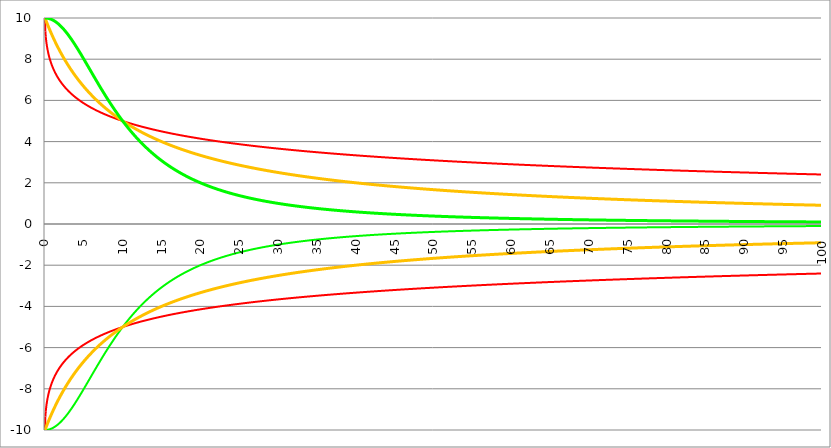
| Category | Series 1 | Series 0 | Series 2 | Series 3 | Series 4 | Series 5 |
|---|---|---|---|---|---|---|
| 0.0 | 10 | -10 | -10 | 10 | -10 | 10 |
| 0.05 | 9.34 | -9.34 | -10 | 9.95 | -9.95 | 10 |
| 0.1 | 9.091 | -9.091 | -9.999 | 9.901 | -9.901 | 9.999 |
| 0.15 | 8.909 | -8.909 | -9.998 | 9.852 | -9.852 | 9.998 |
| 0.2 | 8.761 | -8.761 | -9.996 | 9.804 | -9.804 | 9.996 |
| 0.25 | 8.635 | -8.635 | -9.994 | 9.756 | -9.756 | 9.994 |
| 0.3 | 8.524 | -8.524 | -9.991 | 9.709 | -9.709 | 9.991 |
| 0.35 | 8.424 | -8.424 | -9.988 | 9.662 | -9.662 | 9.988 |
| 0.4 | 8.333 | -8.333 | -9.984 | 9.615 | -9.615 | 9.984 |
| 0.45 | 8.25 | -8.25 | -9.98 | 9.569 | -9.569 | 9.98 |
| 0.5 | 8.173 | -8.173 | -9.975 | 9.524 | -9.524 | 9.975 |
| 0.55 | 8.1 | -8.1 | -9.97 | 9.479 | -9.479 | 9.97 |
| 0.6 | 8.032 | -8.032 | -9.964 | 9.434 | -9.434 | 9.964 |
| 0.65 | 7.968 | -7.968 | -9.958 | 9.39 | -9.39 | 9.958 |
| 0.7 | 7.908 | -7.908 | -9.951 | 9.346 | -9.346 | 9.951 |
| 0.75 | 7.85 | -7.85 | -9.944 | 9.302 | -9.302 | 9.944 |
| 0.8 | 7.795 | -7.795 | -9.936 | 9.259 | -9.259 | 9.936 |
| 0.85 | 7.743 | -7.743 | -9.928 | 9.217 | -9.217 | 9.928 |
| 0.9 | 7.692 | -7.692 | -9.92 | 9.174 | -9.174 | 9.92 |
| 0.95 | 7.644 | -7.644 | -9.911 | 9.132 | -9.132 | 9.911 |
| 1.0 | 7.597 | -7.597 | -9.901 | 9.091 | -9.091 | 9.901 |
| 1.05 | 7.553 | -7.553 | -9.891 | 9.05 | -9.05 | 9.891 |
| 1.1 | 7.509 | -7.509 | -9.88 | 9.009 | -9.009 | 9.88 |
| 1.15 | 7.468 | -7.468 | -9.869 | 8.969 | -8.969 | 9.869 |
| 1.2 | 7.427 | -7.427 | -9.858 | 8.929 | -8.929 | 9.858 |
| 1.25 | 7.388 | -7.388 | -9.846 | 8.889 | -8.889 | 9.846 |
| 1.3 | 7.35 | -7.35 | -9.834 | 8.85 | -8.85 | 9.834 |
| 1.35 | 7.313 | -7.313 | -9.821 | 8.811 | -8.811 | 9.821 |
| 1.400000000000001 | 7.277 | -7.277 | -9.808 | 8.772 | -8.772 | 9.808 |
| 1.450000000000001 | 7.242 | -7.242 | -9.794 | 8.734 | -8.734 | 9.794 |
| 1.500000000000001 | 7.208 | -7.208 | -9.78 | 8.696 | -8.696 | 9.78 |
| 1.550000000000001 | 7.175 | -7.175 | -9.765 | 8.658 | -8.658 | 9.765 |
| 1.600000000000001 | 7.143 | -7.143 | -9.75 | 8.621 | -8.621 | 9.75 |
| 1.650000000000001 | 7.111 | -7.111 | -9.735 | 8.584 | -8.584 | 9.735 |
| 1.700000000000001 | 7.081 | -7.081 | -9.719 | 8.547 | -8.547 | 9.719 |
| 1.750000000000001 | 7.051 | -7.051 | -9.703 | 8.511 | -8.511 | 9.703 |
| 1.800000000000001 | 7.021 | -7.021 | -9.686 | 8.475 | -8.475 | 9.686 |
| 1.850000000000001 | 6.992 | -6.992 | -9.669 | 8.439 | -8.439 | 9.669 |
| 1.900000000000001 | 6.964 | -6.964 | -9.652 | 8.403 | -8.403 | 9.652 |
| 1.950000000000001 | 6.937 | -6.937 | -9.634 | 8.368 | -8.368 | 9.634 |
| 2.000000000000001 | 6.91 | -6.91 | -9.615 | 8.333 | -8.333 | 9.615 |
| 2.050000000000001 | 6.883 | -6.883 | -9.597 | 8.299 | -8.299 | 9.597 |
| 2.100000000000001 | 6.857 | -6.857 | -9.578 | 8.264 | -8.264 | 9.578 |
| 2.15 | 6.832 | -6.832 | -9.558 | 8.23 | -8.23 | 9.558 |
| 2.2 | 6.807 | -6.807 | -9.538 | 8.197 | -8.197 | 9.538 |
| 2.25 | 6.783 | -6.783 | -9.518 | 8.163 | -8.163 | 9.518 |
| 2.3 | 6.759 | -6.759 | -9.498 | 8.13 | -8.13 | 9.498 |
| 2.35 | 6.735 | -6.735 | -9.477 | 8.097 | -8.097 | 9.477 |
| 2.399999999999999 | 6.712 | -6.712 | -9.455 | 8.065 | -8.065 | 9.455 |
| 2.449999999999999 | 6.689 | -6.689 | -9.434 | 8.032 | -8.032 | 9.434 |
| 2.499999999999999 | 6.667 | -6.667 | -9.412 | 8 | -8 | 9.412 |
| 2.549999999999999 | 6.645 | -6.645 | -9.389 | 7.968 | -7.968 | 9.389 |
| 2.599999999999999 | 6.623 | -6.623 | -9.367 | 7.937 | -7.937 | 9.367 |
| 2.649999999999998 | 6.602 | -6.602 | -9.344 | 7.905 | -7.905 | 9.344 |
| 2.699999999999998 | 6.581 | -6.581 | -9.321 | 7.874 | -7.874 | 9.321 |
| 2.749999999999998 | 6.56 | -6.56 | -9.297 | 7.843 | -7.843 | 9.297 |
| 2.799999999999998 | 6.54 | -6.54 | -9.273 | 7.813 | -7.813 | 9.273 |
| 2.849999999999998 | 6.52 | -6.52 | -9.249 | 7.782 | -7.782 | 9.249 |
| 2.899999999999998 | 6.5 | -6.5 | -9.224 | 7.752 | -7.752 | 9.224 |
| 2.949999999999997 | 6.48 | -6.48 | -9.199 | 7.722 | -7.722 | 9.199 |
| 2.999999999999997 | 6.461 | -6.461 | -9.174 | 7.692 | -7.692 | 9.174 |
| 3.049999999999997 | 6.442 | -6.442 | -9.149 | 7.663 | -7.663 | 9.149 |
| 3.099999999999997 | 6.424 | -6.424 | -9.123 | 7.634 | -7.634 | 9.123 |
| 3.149999999999997 | 6.405 | -6.405 | -9.097 | 7.605 | -7.605 | 9.097 |
| 3.199999999999997 | 6.387 | -6.387 | -9.071 | 7.576 | -7.576 | 9.071 |
| 3.249999999999996 | 6.369 | -6.369 | -9.045 | 7.547 | -7.547 | 9.045 |
| 3.299999999999996 | 6.351 | -6.351 | -9.018 | 7.519 | -7.519 | 9.018 |
| 3.349999999999996 | 6.334 | -6.334 | -8.991 | 7.491 | -7.491 | 8.991 |
| 3.399999999999996 | 6.317 | -6.317 | -8.964 | 7.463 | -7.463 | 8.964 |
| 3.449999999999996 | 6.3 | -6.3 | -8.936 | 7.435 | -7.435 | 8.936 |
| 3.499999999999996 | 6.283 | -6.283 | -8.909 | 7.407 | -7.407 | 8.909 |
| 3.549999999999995 | 6.266 | -6.266 | -8.881 | 7.38 | -7.38 | 8.881 |
| 3.599999999999995 | 6.25 | -6.25 | -8.853 | 7.353 | -7.353 | 8.853 |
| 3.649999999999995 | 6.234 | -6.234 | -8.824 | 7.326 | -7.326 | 8.824 |
| 3.699999999999995 | 6.218 | -6.218 | -8.796 | 7.299 | -7.299 | 8.796 |
| 3.749999999999995 | 6.202 | -6.202 | -8.767 | 7.273 | -7.273 | 8.767 |
| 3.799999999999994 | 6.186 | -6.186 | -8.738 | 7.246 | -7.246 | 8.738 |
| 3.849999999999994 | 6.171 | -6.171 | -8.709 | 7.22 | -7.22 | 8.709 |
| 3.899999999999994 | 6.156 | -6.156 | -8.68 | 7.194 | -7.194 | 8.68 |
| 3.949999999999994 | 6.141 | -6.141 | -8.65 | 7.168 | -7.168 | 8.65 |
| 3.999999999999994 | 6.126 | -6.126 | -8.621 | 7.143 | -7.143 | 8.621 |
| 4.049999999999994 | 6.111 | -6.111 | -8.591 | 7.117 | -7.117 | 8.591 |
| 4.099999999999993 | 6.096 | -6.096 | -8.561 | 7.092 | -7.092 | 8.561 |
| 4.149999999999993 | 6.082 | -6.082 | -8.531 | 7.067 | -7.067 | 8.531 |
| 4.199999999999993 | 6.068 | -6.068 | -8.501 | 7.042 | -7.042 | 8.501 |
| 4.249999999999993 | 6.054 | -6.054 | -8.47 | 7.018 | -7.018 | 8.47 |
| 4.299999999999993 | 6.04 | -6.04 | -8.44 | 6.993 | -6.993 | 8.44 |
| 4.349999999999992 | 6.026 | -6.026 | -8.409 | 6.969 | -6.969 | 8.409 |
| 4.399999999999992 | 6.012 | -6.012 | -8.378 | 6.944 | -6.944 | 8.378 |
| 4.449999999999992 | 5.999 | -5.999 | -8.347 | 6.92 | -6.92 | 8.347 |
| 4.499999999999992 | 5.985 | -5.985 | -8.316 | 6.897 | -6.897 | 8.316 |
| 4.549999999999992 | 5.972 | -5.972 | -8.285 | 6.873 | -6.873 | 8.285 |
| 4.599999999999992 | 5.959 | -5.959 | -8.254 | 6.849 | -6.849 | 8.254 |
| 4.649999999999991 | 5.946 | -5.946 | -8.222 | 6.826 | -6.826 | 8.222 |
| 4.699999999999991 | 5.933 | -5.933 | -8.191 | 6.803 | -6.803 | 8.191 |
| 4.749999999999991 | 5.92 | -5.92 | -8.159 | 6.78 | -6.78 | 8.159 |
| 4.799999999999991 | 5.907 | -5.907 | -8.127 | 6.757 | -6.757 | 8.127 |
| 4.849999999999991 | 5.895 | -5.895 | -8.096 | 6.734 | -6.734 | 8.096 |
| 4.899999999999991 | 5.882 | -5.882 | -8.064 | 6.711 | -6.711 | 8.064 |
| 4.94999999999999 | 5.87 | -5.87 | -8.032 | 6.689 | -6.689 | 8.032 |
| 4.99999999999999 | 5.858 | -5.858 | -8 | 6.667 | -6.667 | 8 |
| 5.04999999999999 | 5.846 | -5.846 | -7.968 | 6.645 | -6.645 | 7.968 |
| 5.09999999999999 | 5.834 | -5.834 | -7.936 | 6.623 | -6.623 | 7.936 |
| 5.14999999999999 | 5.822 | -5.822 | -7.904 | 6.601 | -6.601 | 7.904 |
| 5.199999999999989 | 5.81 | -5.81 | -7.872 | 6.579 | -6.579 | 7.872 |
| 5.24999999999999 | 5.799 | -5.799 | -7.839 | 6.557 | -6.557 | 7.839 |
| 5.29999999999999 | 5.787 | -5.787 | -7.807 | 6.536 | -6.536 | 7.807 |
| 5.349999999999989 | 5.776 | -5.776 | -7.775 | 6.515 | -6.515 | 7.775 |
| 5.399999999999989 | 5.764 | -5.764 | -7.742 | 6.494 | -6.494 | 7.742 |
| 5.449999999999988 | 5.753 | -5.753 | -7.71 | 6.472 | -6.472 | 7.71 |
| 5.499999999999988 | 5.742 | -5.742 | -7.678 | 6.452 | -6.452 | 7.678 |
| 5.549999999999988 | 5.731 | -5.731 | -7.645 | 6.431 | -6.431 | 7.645 |
| 5.599999999999988 | 5.72 | -5.72 | -7.613 | 6.41 | -6.41 | 7.613 |
| 5.649999999999988 | 5.709 | -5.709 | -7.58 | 6.39 | -6.39 | 7.58 |
| 5.699999999999988 | 5.698 | -5.698 | -7.548 | 6.369 | -6.369 | 7.548 |
| 5.749999999999987 | 5.687 | -5.687 | -7.515 | 6.349 | -6.349 | 7.515 |
| 5.799999999999987 | 5.677 | -5.677 | -7.483 | 6.329 | -6.329 | 7.483 |
| 5.849999999999987 | 5.666 | -5.666 | -7.45 | 6.309 | -6.309 | 7.45 |
| 5.899999999999987 | 5.656 | -5.656 | -7.418 | 6.289 | -6.289 | 7.418 |
| 5.949999999999986 | 5.645 | -5.645 | -7.385 | 6.27 | -6.27 | 7.385 |
| 5.999999999999986 | 5.635 | -5.635 | -7.353 | 6.25 | -6.25 | 7.353 |
| 6.049999999999986 | 5.625 | -5.625 | -7.321 | 6.231 | -6.231 | 7.321 |
| 6.099999999999986 | 5.615 | -5.615 | -7.288 | 6.211 | -6.211 | 7.288 |
| 6.149999999999986 | 5.605 | -5.605 | -7.256 | 6.192 | -6.192 | 7.256 |
| 6.199999999999986 | 5.595 | -5.595 | -7.223 | 6.173 | -6.173 | 7.223 |
| 6.249999999999985 | 5.585 | -5.585 | -7.191 | 6.154 | -6.154 | 7.191 |
| 6.299999999999985 | 5.575 | -5.575 | -7.159 | 6.135 | -6.135 | 7.159 |
| 6.349999999999985 | 5.565 | -5.565 | -7.126 | 6.116 | -6.116 | 7.126 |
| 6.399999999999985 | 5.556 | -5.556 | -7.094 | 6.098 | -6.098 | 7.094 |
| 6.449999999999985 | 5.546 | -5.546 | -7.062 | 6.079 | -6.079 | 7.062 |
| 6.499999999999984 | 5.536 | -5.536 | -7.03 | 6.061 | -6.061 | 7.03 |
| 6.549999999999984 | 5.527 | -5.527 | -6.998 | 6.042 | -6.042 | 6.998 |
| 6.599999999999984 | 5.518 | -5.518 | -6.966 | 6.024 | -6.024 | 6.966 |
| 6.649999999999984 | 5.508 | -5.508 | -6.934 | 6.006 | -6.006 | 6.934 |
| 6.699999999999984 | 5.499 | -5.499 | -6.902 | 5.988 | -5.988 | 6.902 |
| 6.749999999999984 | 5.49 | -5.49 | -6.87 | 5.97 | -5.97 | 6.87 |
| 6.799999999999984 | 5.481 | -5.481 | -6.838 | 5.952 | -5.952 | 6.838 |
| 6.849999999999984 | 5.472 | -5.472 | -6.806 | 5.935 | -5.935 | 6.806 |
| 6.899999999999983 | 5.463 | -5.463 | -6.775 | 5.917 | -5.917 | 6.775 |
| 6.949999999999983 | 5.454 | -5.454 | -6.743 | 5.9 | -5.9 | 6.743 |
| 6.999999999999983 | 5.445 | -5.445 | -6.711 | 5.882 | -5.882 | 6.711 |
| 7.049999999999983 | 5.436 | -5.436 | -6.68 | 5.865 | -5.865 | 6.68 |
| 7.099999999999983 | 5.427 | -5.427 | -6.648 | 5.848 | -5.848 | 6.648 |
| 7.149999999999983 | 5.418 | -5.418 | -6.617 | 5.831 | -5.831 | 6.617 |
| 7.199999999999982 | 5.41 | -5.41 | -6.586 | 5.814 | -5.814 | 6.586 |
| 7.249999999999982 | 5.401 | -5.401 | -6.555 | 5.797 | -5.797 | 6.555 |
| 7.299999999999982 | 5.393 | -5.393 | -6.524 | 5.78 | -5.78 | 6.524 |
| 7.349999999999982 | 5.384 | -5.384 | -6.493 | 5.764 | -5.764 | 6.493 |
| 7.399999999999982 | 5.376 | -5.376 | -6.462 | 5.747 | -5.747 | 6.462 |
| 7.449999999999981 | 5.367 | -5.367 | -6.431 | 5.731 | -5.731 | 6.431 |
| 7.499999999999981 | 5.359 | -5.359 | -6.4 | 5.714 | -5.714 | 6.4 |
| 7.549999999999981 | 5.351 | -5.351 | -6.369 | 5.698 | -5.698 | 6.369 |
| 7.599999999999981 | 5.343 | -5.343 | -6.339 | 5.682 | -5.682 | 6.339 |
| 7.649999999999981 | 5.334 | -5.334 | -6.308 | 5.666 | -5.666 | 6.308 |
| 7.699999999999981 | 5.326 | -5.326 | -6.278 | 5.65 | -5.65 | 6.278 |
| 7.74999999999998 | 5.318 | -5.318 | -6.248 | 5.634 | -5.634 | 6.248 |
| 7.79999999999998 | 5.31 | -5.31 | -6.217 | 5.618 | -5.618 | 6.217 |
| 7.84999999999998 | 5.302 | -5.302 | -6.187 | 5.602 | -5.602 | 6.187 |
| 7.89999999999998 | 5.294 | -5.294 | -6.157 | 5.587 | -5.587 | 6.157 |
| 7.94999999999998 | 5.286 | -5.286 | -6.127 | 5.571 | -5.571 | 6.127 |
| 7.99999999999998 | 5.279 | -5.279 | -6.098 | 5.556 | -5.556 | 6.098 |
| 8.04999999999998 | 5.271 | -5.271 | -6.068 | 5.54 | -5.54 | 6.068 |
| 8.09999999999998 | 5.263 | -5.263 | -6.038 | 5.525 | -5.525 | 6.038 |
| 8.14999999999998 | 5.255 | -5.255 | -6.009 | 5.51 | -5.51 | 6.009 |
| 8.19999999999998 | 5.248 | -5.248 | -5.979 | 5.495 | -5.495 | 5.979 |
| 8.249999999999982 | 5.24 | -5.24 | -5.95 | 5.479 | -5.479 | 5.95 |
| 8.299999999999981 | 5.233 | -5.233 | -5.921 | 5.464 | -5.464 | 5.921 |
| 8.349999999999984 | 5.225 | -5.225 | -5.892 | 5.45 | -5.45 | 5.892 |
| 8.399999999999984 | 5.218 | -5.218 | -5.863 | 5.435 | -5.435 | 5.863 |
| 8.449999999999985 | 5.21 | -5.21 | -5.834 | 5.42 | -5.42 | 5.834 |
| 8.499999999999986 | 5.203 | -5.203 | -5.806 | 5.405 | -5.405 | 5.806 |
| 8.549999999999986 | 5.196 | -5.196 | -5.777 | 5.391 | -5.391 | 5.777 |
| 8.599999999999987 | 5.188 | -5.188 | -5.748 | 5.376 | -5.376 | 5.748 |
| 8.649999999999986 | 5.181 | -5.181 | -5.72 | 5.362 | -5.362 | 5.72 |
| 8.699999999999989 | 5.174 | -5.174 | -5.692 | 5.348 | -5.348 | 5.692 |
| 8.74999999999999 | 5.167 | -5.167 | -5.664 | 5.333 | -5.333 | 5.664 |
| 8.79999999999999 | 5.16 | -5.16 | -5.636 | 5.319 | -5.319 | 5.636 |
| 8.84999999999999 | 5.153 | -5.153 | -5.608 | 5.305 | -5.305 | 5.608 |
| 8.89999999999999 | 5.146 | -5.146 | -5.58 | 5.291 | -5.291 | 5.58 |
| 8.94999999999999 | 5.139 | -5.139 | -5.552 | 5.277 | -5.277 | 5.552 |
| 8.99999999999999 | 5.132 | -5.132 | -5.525 | 5.263 | -5.263 | 5.525 |
| 9.049999999999994 | 5.125 | -5.125 | -5.497 | 5.249 | -5.249 | 5.497 |
| 9.099999999999994 | 5.118 | -5.118 | -5.47 | 5.236 | -5.236 | 5.47 |
| 9.149999999999995 | 5.111 | -5.111 | -5.443 | 5.222 | -5.222 | 5.443 |
| 9.199999999999996 | 5.104 | -5.104 | -5.416 | 5.208 | -5.208 | 5.416 |
| 9.249999999999996 | 5.097 | -5.097 | -5.389 | 5.195 | -5.195 | 5.389 |
| 9.299999999999997 | 5.091 | -5.091 | -5.362 | 5.181 | -5.181 | 5.362 |
| 9.349999999999998 | 5.084 | -5.084 | -5.336 | 5.168 | -5.168 | 5.336 |
| 9.399999999999999 | 5.077 | -5.077 | -5.309 | 5.155 | -5.155 | 5.309 |
| 9.45 | 5.071 | -5.071 | -5.283 | 5.141 | -5.141 | 5.283 |
| 9.5 | 5.064 | -5.064 | -5.256 | 5.128 | -5.128 | 5.256 |
| 9.55 | 5.058 | -5.058 | -5.23 | 5.115 | -5.115 | 5.23 |
| 9.600000000000001 | 5.051 | -5.051 | -5.204 | 5.102 | -5.102 | 5.204 |
| 9.650000000000002 | 5.045 | -5.045 | -5.178 | 5.089 | -5.089 | 5.178 |
| 9.700000000000003 | 5.038 | -5.038 | -5.152 | 5.076 | -5.076 | 5.152 |
| 9.750000000000004 | 5.032 | -5.032 | -5.127 | 5.063 | -5.063 | 5.127 |
| 9.800000000000004 | 5.025 | -5.025 | -5.101 | 5.051 | -5.051 | 5.101 |
| 9.850000000000003 | 5.019 | -5.019 | -5.076 | 5.038 | -5.038 | 5.076 |
| 9.900000000000006 | 5.013 | -5.013 | -5.05 | 5.025 | -5.025 | 5.05 |
| 9.950000000000006 | 5.006 | -5.006 | -5.025 | 5.013 | -5.013 | 5.025 |
| 10.00000000000001 | 5 | -5 | -5 | 5 | -5 | 5 |
| 10.05000000000001 | 4.994 | -4.994 | -4.975 | 4.988 | -4.988 | 4.975 |
| 10.10000000000001 | 4.988 | -4.988 | -4.95 | 4.975 | -4.975 | 4.95 |
| 10.15000000000001 | 4.981 | -4.981 | -4.926 | 4.963 | -4.963 | 4.926 |
| 10.20000000000001 | 4.975 | -4.975 | -4.901 | 4.95 | -4.95 | 4.901 |
| 10.25000000000001 | 4.969 | -4.969 | -4.877 | 4.938 | -4.938 | 4.877 |
| 10.30000000000001 | 4.963 | -4.963 | -4.852 | 4.926 | -4.926 | 4.852 |
| 10.35000000000001 | 4.957 | -4.957 | -4.828 | 4.914 | -4.914 | 4.828 |
| 10.40000000000001 | 4.951 | -4.951 | -4.804 | 4.902 | -4.902 | 4.804 |
| 10.45000000000001 | 4.945 | -4.945 | -4.78 | 4.89 | -4.89 | 4.78 |
| 10.50000000000001 | 4.939 | -4.939 | -4.756 | 4.878 | -4.878 | 4.756 |
| 10.55000000000001 | 4.933 | -4.933 | -4.733 | 4.866 | -4.866 | 4.733 |
| 10.60000000000002 | 4.927 | -4.927 | -4.709 | 4.854 | -4.854 | 4.709 |
| 10.65000000000002 | 4.921 | -4.921 | -4.686 | 4.843 | -4.843 | 4.686 |
| 10.70000000000002 | 4.915 | -4.915 | -4.662 | 4.831 | -4.831 | 4.662 |
| 10.75000000000002 | 4.91 | -4.91 | -4.639 | 4.819 | -4.819 | 4.639 |
| 10.80000000000002 | 4.904 | -4.904 | -4.616 | 4.808 | -4.808 | 4.616 |
| 10.85000000000002 | 4.898 | -4.898 | -4.593 | 4.796 | -4.796 | 4.593 |
| 10.90000000000002 | 4.892 | -4.892 | -4.57 | 4.785 | -4.785 | 4.57 |
| 10.95000000000002 | 4.887 | -4.887 | -4.547 | 4.773 | -4.773 | 4.547 |
| 11.00000000000002 | 4.881 | -4.881 | -4.525 | 4.762 | -4.762 | 4.525 |
| 11.05000000000002 | 4.875 | -4.875 | -4.502 | 4.751 | -4.751 | 4.502 |
| 11.10000000000002 | 4.87 | -4.87 | -4.48 | 4.739 | -4.739 | 4.48 |
| 11.15000000000002 | 4.864 | -4.864 | -4.458 | 4.728 | -4.728 | 4.458 |
| 11.20000000000002 | 4.858 | -4.858 | -4.436 | 4.717 | -4.717 | 4.436 |
| 11.25000000000002 | 4.853 | -4.853 | -4.414 | 4.706 | -4.706 | 4.414 |
| 11.30000000000003 | 4.847 | -4.847 | -4.392 | 4.695 | -4.695 | 4.392 |
| 11.35000000000003 | 4.842 | -4.842 | -4.37 | 4.684 | -4.684 | 4.37 |
| 11.40000000000003 | 4.836 | -4.836 | -4.349 | 4.673 | -4.673 | 4.349 |
| 11.45000000000003 | 4.831 | -4.831 | -4.327 | 4.662 | -4.662 | 4.327 |
| 11.50000000000003 | 4.825 | -4.825 | -4.306 | 4.651 | -4.651 | 4.306 |
| 11.55000000000003 | 4.82 | -4.82 | -4.284 | 4.64 | -4.64 | 4.284 |
| 11.60000000000003 | 4.815 | -4.815 | -4.263 | 4.63 | -4.63 | 4.263 |
| 11.65000000000003 | 4.809 | -4.809 | -4.242 | 4.619 | -4.619 | 4.242 |
| 11.70000000000003 | 4.804 | -4.804 | -4.221 | 4.608 | -4.608 | 4.221 |
| 11.75000000000003 | 4.799 | -4.799 | -4.201 | 4.598 | -4.598 | 4.201 |
| 11.80000000000003 | 4.793 | -4.793 | -4.18 | 4.587 | -4.587 | 4.18 |
| 11.85000000000003 | 4.788 | -4.788 | -4.159 | 4.577 | -4.577 | 4.159 |
| 11.90000000000003 | 4.783 | -4.783 | -4.139 | 4.566 | -4.566 | 4.139 |
| 11.95000000000003 | 4.777 | -4.777 | -4.119 | 4.556 | -4.556 | 4.119 |
| 12.00000000000004 | 4.772 | -4.772 | -4.098 | 4.545 | -4.545 | 4.098 |
| 12.05000000000004 | 4.767 | -4.767 | -4.078 | 4.535 | -4.535 | 4.078 |
| 12.10000000000004 | 4.762 | -4.762 | -4.058 | 4.525 | -4.525 | 4.058 |
| 12.15000000000004 | 4.757 | -4.757 | -4.038 | 4.515 | -4.515 | 4.038 |
| 12.20000000000004 | 4.752 | -4.752 | -4.019 | 4.505 | -4.505 | 4.019 |
| 12.25000000000004 | 4.747 | -4.747 | -3.999 | 4.494 | -4.494 | 3.999 |
| 12.30000000000004 | 4.741 | -4.741 | -3.979 | 4.484 | -4.484 | 3.979 |
| 12.35000000000004 | 4.736 | -4.736 | -3.96 | 4.474 | -4.474 | 3.96 |
| 12.40000000000004 | 4.731 | -4.731 | -3.941 | 4.464 | -4.464 | 3.941 |
| 12.45000000000004 | 4.726 | -4.726 | -3.922 | 4.454 | -4.454 | 3.922 |
| 12.50000000000004 | 4.721 | -4.721 | -3.902 | 4.444 | -4.444 | 3.902 |
| 12.55000000000004 | 4.716 | -4.716 | -3.883 | 4.435 | -4.435 | 3.883 |
| 12.60000000000004 | 4.711 | -4.711 | -3.865 | 4.425 | -4.425 | 3.865 |
| 12.65000000000004 | 4.706 | -4.706 | -3.846 | 4.415 | -4.415 | 3.846 |
| 12.70000000000005 | 4.702 | -4.702 | -3.827 | 4.405 | -4.405 | 3.827 |
| 12.75000000000005 | 4.697 | -4.697 | -3.809 | 4.396 | -4.396 | 3.809 |
| 12.80000000000005 | 4.692 | -4.692 | -3.79 | 4.386 | -4.386 | 3.79 |
| 12.85000000000005 | 4.687 | -4.687 | -3.772 | 4.376 | -4.376 | 3.772 |
| 12.90000000000005 | 4.682 | -4.682 | -3.754 | 4.367 | -4.367 | 3.754 |
| 12.95000000000005 | 4.677 | -4.677 | -3.735 | 4.357 | -4.357 | 3.735 |
| 13.00000000000005 | 4.673 | -4.673 | -3.717 | 4.348 | -4.348 | 3.717 |
| 13.05000000000005 | 4.668 | -4.668 | -3.7 | 4.338 | -4.338 | 3.7 |
| 13.10000000000005 | 4.663 | -4.663 | -3.682 | 4.329 | -4.329 | 3.682 |
| 13.15000000000005 | 4.658 | -4.658 | -3.664 | 4.32 | -4.32 | 3.664 |
| 13.20000000000005 | 4.654 | -4.654 | -3.646 | 4.31 | -4.31 | 3.646 |
| 13.25000000000005 | 4.649 | -4.649 | -3.629 | 4.301 | -4.301 | 3.629 |
| 13.30000000000005 | 4.644 | -4.644 | -3.612 | 4.292 | -4.292 | 3.612 |
| 13.35000000000005 | 4.639 | -4.639 | -3.594 | 4.283 | -4.283 | 3.594 |
| 13.40000000000006 | 4.635 | -4.635 | -3.577 | 4.274 | -4.274 | 3.577 |
| 13.45000000000006 | 4.63 | -4.63 | -3.56 | 4.264 | -4.264 | 3.56 |
| 13.50000000000006 | 4.626 | -4.626 | -3.543 | 4.255 | -4.255 | 3.543 |
| 13.55000000000006 | 4.621 | -4.621 | -3.526 | 4.246 | -4.246 | 3.526 |
| 13.60000000000006 | 4.616 | -4.616 | -3.509 | 4.237 | -4.237 | 3.509 |
| 13.65000000000006 | 4.612 | -4.612 | -3.493 | 4.228 | -4.228 | 3.493 |
| 13.70000000000006 | 4.607 | -4.607 | -3.476 | 4.219 | -4.219 | 3.476 |
| 13.75000000000006 | 4.603 | -4.603 | -3.459 | 4.211 | -4.211 | 3.459 |
| 13.80000000000006 | 4.598 | -4.598 | -3.443 | 4.202 | -4.202 | 3.443 |
| 13.85000000000006 | 4.594 | -4.594 | -3.427 | 4.193 | -4.193 | 3.427 |
| 13.90000000000006 | 4.589 | -4.589 | -3.411 | 4.184 | -4.184 | 3.411 |
| 13.95000000000006 | 4.585 | -4.585 | -3.394 | 4.175 | -4.175 | 3.394 |
| 14.00000000000006 | 4.58 | -4.58 | -3.378 | 4.167 | -4.167 | 3.378 |
| 14.05000000000006 | 4.576 | -4.576 | -3.362 | 4.158 | -4.158 | 3.362 |
| 14.10000000000007 | 4.572 | -4.572 | -3.347 | 4.149 | -4.149 | 3.347 |
| 14.15000000000007 | 4.567 | -4.567 | -3.331 | 4.141 | -4.141 | 3.331 |
| 14.20000000000007 | 4.563 | -4.563 | -3.315 | 4.132 | -4.132 | 3.315 |
| 14.25000000000007 | 4.558 | -4.558 | -3.3 | 4.124 | -4.124 | 3.3 |
| 14.30000000000007 | 4.554 | -4.554 | -3.284 | 4.115 | -4.115 | 3.284 |
| 14.35000000000007 | 4.55 | -4.55 | -3.269 | 4.107 | -4.107 | 3.269 |
| 14.40000000000007 | 4.545 | -4.545 | -3.254 | 4.098 | -4.098 | 3.254 |
| 14.45000000000007 | 4.541 | -4.541 | -3.238 | 4.09 | -4.09 | 3.238 |
| 14.50000000000007 | 4.537 | -4.537 | -3.223 | 4.082 | -4.082 | 3.223 |
| 14.55000000000007 | 4.533 | -4.533 | -3.208 | 4.073 | -4.073 | 3.208 |
| 14.60000000000007 | 4.528 | -4.528 | -3.193 | 4.065 | -4.065 | 3.193 |
| 14.65000000000007 | 4.524 | -4.524 | -3.178 | 4.057 | -4.057 | 3.178 |
| 14.70000000000007 | 4.52 | -4.52 | -3.164 | 4.049 | -4.049 | 3.164 |
| 14.75000000000007 | 4.516 | -4.516 | -3.149 | 4.04 | -4.04 | 3.149 |
| 14.80000000000008 | 4.512 | -4.512 | -3.134 | 4.032 | -4.032 | 3.134 |
| 14.85000000000008 | 4.507 | -4.507 | -3.12 | 4.024 | -4.024 | 3.12 |
| 14.90000000000008 | 4.503 | -4.503 | -3.105 | 4.016 | -4.016 | 3.105 |
| 14.95000000000008 | 4.499 | -4.499 | -3.091 | 4.008 | -4.008 | 3.091 |
| 15.00000000000008 | 4.495 | -4.495 | -3.077 | 4 | -4 | 3.077 |
| 15.05000000000008 | 4.491 | -4.491 | -3.063 | 3.992 | -3.992 | 3.063 |
| 15.10000000000008 | 4.487 | -4.487 | -3.049 | 3.984 | -3.984 | 3.049 |
| 15.15000000000008 | 4.483 | -4.483 | -3.035 | 3.976 | -3.976 | 3.035 |
| 15.20000000000008 | 4.479 | -4.479 | -3.021 | 3.968 | -3.968 | 3.021 |
| 15.25000000000008 | 4.474 | -4.474 | -3.007 | 3.96 | -3.96 | 3.007 |
| 15.30000000000008 | 4.47 | -4.47 | -2.993 | 3.953 | -3.953 | 2.993 |
| 15.35000000000008 | 4.466 | -4.466 | -2.98 | 3.945 | -3.945 | 2.98 |
| 15.40000000000008 | 4.462 | -4.462 | -2.966 | 3.937 | -3.937 | 2.966 |
| 15.45000000000008 | 4.458 | -4.458 | -2.952 | 3.929 | -3.929 | 2.952 |
| 15.50000000000009 | 4.454 | -4.454 | -2.939 | 3.922 | -3.922 | 2.939 |
| 15.55000000000009 | 4.45 | -4.45 | -2.926 | 3.914 | -3.914 | 2.926 |
| 15.60000000000009 | 4.446 | -4.446 | -2.912 | 3.906 | -3.906 | 2.912 |
| 15.65000000000009 | 4.442 | -4.442 | -2.899 | 3.899 | -3.899 | 2.899 |
| 15.70000000000009 | 4.439 | -4.439 | -2.886 | 3.891 | -3.891 | 2.886 |
| 15.75000000000009 | 4.435 | -4.435 | -2.873 | 3.883 | -3.883 | 2.873 |
| 15.80000000000009 | 4.431 | -4.431 | -2.86 | 3.876 | -3.876 | 2.86 |
| 15.8500000000001 | 4.427 | -4.427 | -2.847 | 3.868 | -3.868 | 2.847 |
| 15.9000000000001 | 4.423 | -4.423 | -2.834 | 3.861 | -3.861 | 2.834 |
| 15.9500000000001 | 4.419 | -4.419 | -2.822 | 3.854 | -3.854 | 2.822 |
| 16.00000000000009 | 4.415 | -4.415 | -2.809 | 3.846 | -3.846 | 2.809 |
| 16.05000000000009 | 4.411 | -4.411 | -2.796 | 3.839 | -3.839 | 2.796 |
| 16.10000000000009 | 4.408 | -4.408 | -2.784 | 3.831 | -3.831 | 2.784 |
| 16.15000000000009 | 4.404 | -4.404 | -2.771 | 3.824 | -3.824 | 2.771 |
| 16.2000000000001 | 4.4 | -4.4 | -2.759 | 3.817 | -3.817 | 2.759 |
| 16.2500000000001 | 4.396 | -4.396 | -2.747 | 3.81 | -3.81 | 2.747 |
| 16.3000000000001 | 4.392 | -4.392 | -2.735 | 3.802 | -3.802 | 2.735 |
| 16.3500000000001 | 4.389 | -4.389 | -2.722 | 3.795 | -3.795 | 2.722 |
| 16.4000000000001 | 4.385 | -4.385 | -2.71 | 3.788 | -3.788 | 2.71 |
| 16.4500000000001 | 4.381 | -4.381 | -2.698 | 3.781 | -3.781 | 2.698 |
| 16.5000000000001 | 4.377 | -4.377 | -2.686 | 3.774 | -3.774 | 2.686 |
| 16.5500000000001 | 4.374 | -4.374 | -2.674 | 3.766 | -3.766 | 2.674 |
| 16.6000000000001 | 4.37 | -4.37 | -2.663 | 3.759 | -3.759 | 2.663 |
| 16.6500000000001 | 4.366 | -4.366 | -2.651 | 3.752 | -3.752 | 2.651 |
| 16.7000000000001 | 4.362 | -4.362 | -2.639 | 3.745 | -3.745 | 2.639 |
| 16.7500000000001 | 4.359 | -4.359 | -2.628 | 3.738 | -3.738 | 2.628 |
| 16.8000000000001 | 4.355 | -4.355 | -2.616 | 3.731 | -3.731 | 2.616 |
| 16.8500000000001 | 4.351 | -4.351 | -2.605 | 3.724 | -3.724 | 2.605 |
| 16.90000000000011 | 4.348 | -4.348 | -2.593 | 3.717 | -3.717 | 2.593 |
| 16.95000000000011 | 4.344 | -4.344 | -2.582 | 3.711 | -3.711 | 2.582 |
| 17.00000000000011 | 4.341 | -4.341 | -2.571 | 3.704 | -3.704 | 2.571 |
| 17.05000000000011 | 4.337 | -4.337 | -2.559 | 3.697 | -3.697 | 2.559 |
| 17.10000000000011 | 4.333 | -4.333 | -2.548 | 3.69 | -3.69 | 2.548 |
| 17.15000000000011 | 4.33 | -4.33 | -2.537 | 3.683 | -3.683 | 2.537 |
| 17.20000000000011 | 4.326 | -4.326 | -2.526 | 3.676 | -3.676 | 2.526 |
| 17.25000000000011 | 4.323 | -4.323 | -2.515 | 3.67 | -3.67 | 2.515 |
| 17.30000000000011 | 4.319 | -4.319 | -2.504 | 3.663 | -3.663 | 2.504 |
| 17.35000000000011 | 4.316 | -4.316 | -2.494 | 3.656 | -3.656 | 2.494 |
| 17.40000000000011 | 4.312 | -4.312 | -2.483 | 3.65 | -3.65 | 2.483 |
| 17.45000000000011 | 4.309 | -4.309 | -2.472 | 3.643 | -3.643 | 2.472 |
| 17.50000000000011 | 4.305 | -4.305 | -2.462 | 3.636 | -3.636 | 2.462 |
| 17.55000000000011 | 4.302 | -4.302 | -2.451 | 3.63 | -3.63 | 2.451 |
| 17.60000000000012 | 4.298 | -4.298 | -2.44 | 3.623 | -3.623 | 2.44 |
| 17.65000000000012 | 4.295 | -4.295 | -2.43 | 3.617 | -3.617 | 2.43 |
| 17.70000000000012 | 4.291 | -4.291 | -2.42 | 3.61 | -3.61 | 2.42 |
| 17.75000000000012 | 4.288 | -4.288 | -2.409 | 3.604 | -3.604 | 2.409 |
| 17.80000000000012 | 4.284 | -4.284 | -2.399 | 3.597 | -3.597 | 2.399 |
| 17.85000000000012 | 4.281 | -4.281 | -2.389 | 3.591 | -3.591 | 2.389 |
| 17.90000000000012 | 4.277 | -4.277 | -2.379 | 3.584 | -3.584 | 2.379 |
| 17.95000000000012 | 4.274 | -4.274 | -2.369 | 3.578 | -3.578 | 2.369 |
| 18.00000000000012 | 4.271 | -4.271 | -2.358 | 3.571 | -3.571 | 2.358 |
| 18.05000000000012 | 4.267 | -4.267 | -2.349 | 3.565 | -3.565 | 2.349 |
| 18.10000000000012 | 4.264 | -4.264 | -2.339 | 3.559 | -3.559 | 2.339 |
| 18.15000000000012 | 4.26 | -4.26 | -2.329 | 3.552 | -3.552 | 2.329 |
| 18.20000000000012 | 4.257 | -4.257 | -2.319 | 3.546 | -3.546 | 2.319 |
| 18.25000000000012 | 4.254 | -4.254 | -2.309 | 3.54 | -3.54 | 2.309 |
| 18.30000000000013 | 4.25 | -4.25 | -2.299 | 3.534 | -3.534 | 2.299 |
| 18.35000000000013 | 4.247 | -4.247 | -2.29 | 3.527 | -3.527 | 2.29 |
| 18.40000000000013 | 4.244 | -4.244 | -2.28 | 3.521 | -3.521 | 2.28 |
| 18.45000000000013 | 4.24 | -4.24 | -2.271 | 3.515 | -3.515 | 2.271 |
| 18.50000000000013 | 4.237 | -4.237 | -2.261 | 3.509 | -3.509 | 2.261 |
| 18.55000000000013 | 4.234 | -4.234 | -2.252 | 3.503 | -3.503 | 2.252 |
| 18.60000000000013 | 4.23 | -4.23 | -2.242 | 3.497 | -3.497 | 2.242 |
| 18.65000000000013 | 4.227 | -4.227 | -2.233 | 3.49 | -3.49 | 2.233 |
| 18.70000000000013 | 4.224 | -4.224 | -2.224 | 3.484 | -3.484 | 2.224 |
| 18.75000000000013 | 4.221 | -4.221 | -2.215 | 3.478 | -3.478 | 2.215 |
| 18.80000000000013 | 4.217 | -4.217 | -2.205 | 3.472 | -3.472 | 2.205 |
| 18.85000000000013 | 4.214 | -4.214 | -2.196 | 3.466 | -3.466 | 2.196 |
| 18.90000000000013 | 4.211 | -4.211 | -2.187 | 3.46 | -3.46 | 2.187 |
| 18.95000000000013 | 4.208 | -4.208 | -2.178 | 3.454 | -3.454 | 2.178 |
| 19.00000000000014 | 4.204 | -4.204 | -2.169 | 3.448 | -3.448 | 2.169 |
| 19.05000000000014 | 4.201 | -4.201 | -2.16 | 3.442 | -3.442 | 2.16 |
| 19.10000000000014 | 4.198 | -4.198 | -2.151 | 3.436 | -3.436 | 2.151 |
| 19.15000000000014 | 4.195 | -4.195 | -2.143 | 3.431 | -3.431 | 2.143 |
| 19.20000000000014 | 4.192 | -4.192 | -2.134 | 3.425 | -3.425 | 2.134 |
| 19.25000000000014 | 4.189 | -4.189 | -2.125 | 3.419 | -3.419 | 2.125 |
| 19.30000000000014 | 4.185 | -4.185 | -2.116 | 3.413 | -3.413 | 2.116 |
| 19.35000000000014 | 4.182 | -4.182 | -2.108 | 3.407 | -3.407 | 2.108 |
| 19.40000000000014 | 4.179 | -4.179 | -2.099 | 3.401 | -3.401 | 2.099 |
| 19.45000000000014 | 4.176 | -4.176 | -2.091 | 3.396 | -3.396 | 2.091 |
| 19.50000000000014 | 4.173 | -4.173 | -2.082 | 3.39 | -3.39 | 2.082 |
| 19.55000000000014 | 4.17 | -4.17 | -2.074 | 3.384 | -3.384 | 2.074 |
| 19.60000000000014 | 4.167 | -4.167 | -2.065 | 3.378 | -3.378 | 2.065 |
| 19.65000000000014 | 4.164 | -4.164 | -2.057 | 3.373 | -3.373 | 2.057 |
| 19.70000000000014 | 4.16 | -4.16 | -2.049 | 3.367 | -3.367 | 2.049 |
| 19.75000000000015 | 4.157 | -4.157 | -2.041 | 3.361 | -3.361 | 2.041 |
| 19.80000000000015 | 4.154 | -4.154 | -2.032 | 3.356 | -3.356 | 2.032 |
| 19.85000000000015 | 4.151 | -4.151 | -2.024 | 3.35 | -3.35 | 2.024 |
| 19.90000000000015 | 4.148 | -4.148 | -2.016 | 3.344 | -3.344 | 2.016 |
| 19.95000000000015 | 4.145 | -4.145 | -2.008 | 3.339 | -3.339 | 2.008 |
| 20.00000000000015 | 4.142 | -4.142 | -2 | 3.333 | -3.333 | 2 |
| 20.05000000000015 | 4.139 | -4.139 | -1.992 | 3.328 | -3.328 | 1.992 |
| 20.10000000000015 | 4.136 | -4.136 | -1.984 | 3.322 | -3.322 | 1.984 |
| 20.15000000000015 | 4.133 | -4.133 | -1.976 | 3.317 | -3.317 | 1.976 |
| 20.20000000000015 | 4.13 | -4.13 | -1.968 | 3.311 | -3.311 | 1.968 |
| 20.25000000000015 | 4.127 | -4.127 | -1.961 | 3.306 | -3.306 | 1.961 |
| 20.30000000000015 | 4.124 | -4.124 | -1.953 | 3.3 | -3.3 | 1.953 |
| 20.35000000000015 | 4.121 | -4.121 | -1.945 | 3.295 | -3.295 | 1.945 |
| 20.40000000000015 | 4.118 | -4.118 | -1.937 | 3.289 | -3.289 | 1.937 |
| 20.45000000000016 | 4.115 | -4.115 | -1.93 | 3.284 | -3.284 | 1.93 |
| 20.50000000000016 | 4.112 | -4.112 | -1.922 | 3.279 | -3.279 | 1.922 |
| 20.55000000000016 | 4.109 | -4.109 | -1.915 | 3.273 | -3.273 | 1.915 |
| 20.60000000000016 | 4.106 | -4.106 | -1.907 | 3.268 | -3.268 | 1.907 |
| 20.65000000000016 | 4.103 | -4.103 | -1.9 | 3.263 | -3.263 | 1.9 |
| 20.70000000000016 | 4.1 | -4.1 | -1.892 | 3.257 | -3.257 | 1.892 |
| 20.75000000000016 | 4.098 | -4.098 | -1.885 | 3.252 | -3.252 | 1.885 |
| 20.80000000000016 | 4.095 | -4.095 | -1.877 | 3.247 | -3.247 | 1.877 |
| 20.85000000000016 | 4.092 | -4.092 | -1.87 | 3.241 | -3.241 | 1.87 |
| 20.90000000000016 | 4.089 | -4.089 | -1.863 | 3.236 | -3.236 | 1.863 |
| 20.95000000000016 | 4.086 | -4.086 | -1.856 | 3.231 | -3.231 | 1.856 |
| 21.00000000000016 | 4.083 | -4.083 | -1.848 | 3.226 | -3.226 | 1.848 |
| 21.05000000000016 | 4.08 | -4.08 | -1.841 | 3.221 | -3.221 | 1.841 |
| 21.10000000000016 | 4.077 | -4.077 | -1.834 | 3.215 | -3.215 | 1.834 |
| 21.15000000000017 | 4.074 | -4.074 | -1.827 | 3.21 | -3.21 | 1.827 |
| 21.20000000000017 | 4.072 | -4.072 | -1.82 | 3.205 | -3.205 | 1.82 |
| 21.25000000000017 | 4.069 | -4.069 | -1.813 | 3.2 | -3.2 | 1.813 |
| 21.30000000000017 | 4.066 | -4.066 | -1.806 | 3.195 | -3.195 | 1.806 |
| 21.35000000000017 | 4.063 | -4.063 | -1.799 | 3.19 | -3.19 | 1.799 |
| 21.40000000000017 | 4.06 | -4.06 | -1.792 | 3.185 | -3.185 | 1.792 |
| 21.45000000000017 | 4.057 | -4.057 | -1.785 | 3.18 | -3.18 | 1.785 |
| 21.50000000000017 | 4.055 | -4.055 | -1.779 | 3.175 | -3.175 | 1.779 |
| 21.55000000000017 | 4.052 | -4.052 | -1.772 | 3.17 | -3.17 | 1.772 |
| 21.60000000000017 | 4.049 | -4.049 | -1.765 | 3.165 | -3.165 | 1.765 |
| 21.65000000000017 | 4.046 | -4.046 | -1.758 | 3.16 | -3.16 | 1.758 |
| 21.70000000000017 | 4.044 | -4.044 | -1.752 | 3.155 | -3.155 | 1.752 |
| 21.75000000000017 | 4.041 | -4.041 | -1.745 | 3.15 | -3.15 | 1.745 |
| 21.80000000000017 | 4.038 | -4.038 | -1.738 | 3.145 | -3.145 | 1.738 |
| 21.85000000000018 | 4.035 | -4.035 | -1.732 | 3.14 | -3.14 | 1.732 |
| 21.90000000000018 | 4.032 | -4.032 | -1.725 | 3.135 | -3.135 | 1.725 |
| 21.95000000000018 | 4.03 | -4.03 | -1.719 | 3.13 | -3.13 | 1.719 |
| 22.00000000000018 | 4.027 | -4.027 | -1.712 | 3.125 | -3.125 | 1.712 |
| 22.05000000000018 | 4.024 | -4.024 | -1.706 | 3.12 | -3.12 | 1.706 |
| 22.10000000000018 | 4.022 | -4.022 | -1.699 | 3.115 | -3.115 | 1.699 |
| 22.15000000000018 | 4.019 | -4.019 | -1.693 | 3.11 | -3.11 | 1.693 |
| 22.20000000000018 | 4.016 | -4.016 | -1.687 | 3.106 | -3.106 | 1.687 |
| 22.25000000000018 | 4.013 | -4.013 | -1.68 | 3.101 | -3.101 | 1.68 |
| 22.30000000000018 | 4.011 | -4.011 | -1.674 | 3.096 | -3.096 | 1.674 |
| 22.35000000000018 | 4.008 | -4.008 | -1.668 | 3.091 | -3.091 | 1.668 |
| 22.40000000000018 | 4.005 | -4.005 | -1.662 | 3.086 | -3.086 | 1.662 |
| 22.45000000000018 | 4.003 | -4.003 | -1.656 | 3.082 | -3.082 | 1.656 |
| 22.50000000000018 | 4 | -4 | -1.649 | 3.077 | -3.077 | 1.649 |
| 22.55000000000019 | 3.997 | -3.997 | -1.643 | 3.072 | -3.072 | 1.643 |
| 22.60000000000019 | 3.995 | -3.995 | -1.637 | 3.067 | -3.067 | 1.637 |
| 22.65000000000019 | 3.992 | -3.992 | -1.631 | 3.063 | -3.063 | 1.631 |
| 22.70000000000019 | 3.989 | -3.989 | -1.625 | 3.058 | -3.058 | 1.625 |
| 22.75000000000019 | 3.987 | -3.987 | -1.619 | 3.053 | -3.053 | 1.619 |
| 22.80000000000019 | 3.984 | -3.984 | -1.613 | 3.049 | -3.049 | 1.613 |
| 22.85000000000019 | 3.981 | -3.981 | -1.607 | 3.044 | -3.044 | 1.607 |
| 22.90000000000019 | 3.979 | -3.979 | -1.602 | 3.04 | -3.04 | 1.602 |
| 22.95000000000019 | 3.976 | -3.976 | -1.596 | 3.035 | -3.035 | 1.596 |
| 23.00000000000019 | 3.974 | -3.974 | -1.59 | 3.03 | -3.03 | 1.59 |
| 23.05000000000019 | 3.971 | -3.971 | -1.584 | 3.026 | -3.026 | 1.584 |
| 23.10000000000019 | 3.968 | -3.968 | -1.578 | 3.021 | -3.021 | 1.578 |
| 23.15000000000019 | 3.966 | -3.966 | -1.573 | 3.017 | -3.017 | 1.573 |
| 23.20000000000019 | 3.963 | -3.963 | -1.567 | 3.012 | -3.012 | 1.567 |
| 23.2500000000002 | 3.961 | -3.961 | -1.561 | 3.008 | -3.008 | 1.561 |
| 23.3000000000002 | 3.958 | -3.958 | -1.555 | 3.003 | -3.003 | 1.555 |
| 23.3500000000002 | 3.956 | -3.956 | -1.55 | 2.999 | -2.999 | 1.55 |
| 23.4000000000002 | 3.953 | -3.953 | -1.544 | 2.994 | -2.994 | 1.544 |
| 23.4500000000002 | 3.95 | -3.95 | -1.539 | 2.99 | -2.99 | 1.539 |
| 23.5000000000002 | 3.948 | -3.948 | -1.533 | 2.985 | -2.985 | 1.533 |
| 23.5500000000002 | 3.945 | -3.945 | -1.528 | 2.981 | -2.981 | 1.528 |
| 23.6000000000002 | 3.943 | -3.943 | -1.522 | 2.976 | -2.976 | 1.522 |
| 23.6500000000002 | 3.94 | -3.94 | -1.517 | 2.972 | -2.972 | 1.517 |
| 23.7000000000002 | 3.938 | -3.938 | -1.511 | 2.967 | -2.967 | 1.511 |
| 23.7500000000002 | 3.935 | -3.935 | -1.506 | 2.963 | -2.963 | 1.506 |
| 23.8000000000002 | 3.933 | -3.933 | -1.501 | 2.959 | -2.959 | 1.501 |
| 23.8500000000002 | 3.93 | -3.93 | -1.495 | 2.954 | -2.954 | 1.495 |
| 23.9000000000002 | 3.928 | -3.928 | -1.49 | 2.95 | -2.95 | 1.49 |
| 23.95000000000021 | 3.925 | -3.925 | -1.485 | 2.946 | -2.946 | 1.485 |
| 24.00000000000021 | 3.923 | -3.923 | -1.479 | 2.941 | -2.941 | 1.479 |
| 24.05000000000021 | 3.92 | -3.92 | -1.474 | 2.937 | -2.937 | 1.474 |
| 24.10000000000021 | 3.918 | -3.918 | -1.469 | 2.933 | -2.933 | 1.469 |
| 24.15000000000021 | 3.915 | -3.915 | -1.464 | 2.928 | -2.928 | 1.464 |
| 24.20000000000021 | 3.913 | -3.913 | -1.458 | 2.924 | -2.924 | 1.458 |
| 24.25000000000021 | 3.91 | -3.91 | -1.453 | 2.92 | -2.92 | 1.453 |
| 24.30000000000021 | 3.908 | -3.908 | -1.448 | 2.915 | -2.915 | 1.448 |
| 24.35000000000021 | 3.906 | -3.906 | -1.443 | 2.911 | -2.911 | 1.443 |
| 24.40000000000021 | 3.903 | -3.903 | -1.438 | 2.907 | -2.907 | 1.438 |
| 24.45000000000021 | 3.901 | -3.901 | -1.433 | 2.903 | -2.903 | 1.433 |
| 24.50000000000021 | 3.898 | -3.898 | -1.428 | 2.899 | -2.899 | 1.428 |
| 24.55000000000021 | 3.896 | -3.896 | -1.423 | 2.894 | -2.894 | 1.423 |
| 24.60000000000021 | 3.893 | -3.893 | -1.418 | 2.89 | -2.89 | 1.418 |
| 24.65000000000022 | 3.891 | -3.891 | -1.413 | 2.886 | -2.886 | 1.413 |
| 24.70000000000022 | 3.889 | -3.889 | -1.408 | 2.882 | -2.882 | 1.408 |
| 24.75000000000022 | 3.886 | -3.886 | -1.403 | 2.878 | -2.878 | 1.403 |
| 24.80000000000022 | 3.884 | -3.884 | -1.399 | 2.874 | -2.874 | 1.399 |
| 24.85000000000022 | 3.881 | -3.881 | -1.394 | 2.869 | -2.869 | 1.394 |
| 24.90000000000022 | 3.879 | -3.879 | -1.389 | 2.865 | -2.865 | 1.389 |
| 24.95000000000022 | 3.877 | -3.877 | -1.384 | 2.861 | -2.861 | 1.384 |
| 25.00000000000022 | 3.874 | -3.874 | -1.379 | 2.857 | -2.857 | 1.379 |
| 25.05000000000022 | 3.872 | -3.872 | -1.375 | 2.853 | -2.853 | 1.375 |
| 25.10000000000022 | 3.87 | -3.87 | -1.37 | 2.849 | -2.849 | 1.37 |
| 25.15000000000022 | 3.867 | -3.867 | -1.365 | 2.845 | -2.845 | 1.365 |
| 25.20000000000022 | 3.865 | -3.865 | -1.36 | 2.841 | -2.841 | 1.36 |
| 25.25000000000022 | 3.862 | -3.862 | -1.356 | 2.837 | -2.837 | 1.356 |
| 25.30000000000022 | 3.86 | -3.86 | -1.351 | 2.833 | -2.833 | 1.351 |
| 25.35000000000023 | 3.858 | -3.858 | -1.347 | 2.829 | -2.829 | 1.347 |
| 25.40000000000023 | 3.855 | -3.855 | -1.342 | 2.825 | -2.825 | 1.342 |
| 25.45000000000023 | 3.853 | -3.853 | -1.337 | 2.821 | -2.821 | 1.337 |
| 25.50000000000023 | 3.851 | -3.851 | -1.333 | 2.817 | -2.817 | 1.333 |
| 25.55000000000023 | 3.848 | -3.848 | -1.328 | 2.813 | -2.813 | 1.328 |
| 25.60000000000023 | 3.846 | -3.846 | -1.324 | 2.809 | -2.809 | 1.324 |
| 25.65000000000023 | 3.844 | -3.844 | -1.319 | 2.805 | -2.805 | 1.319 |
| 25.70000000000023 | 3.842 | -3.842 | -1.315 | 2.801 | -2.801 | 1.315 |
| 25.75000000000023 | 3.839 | -3.839 | -1.311 | 2.797 | -2.797 | 1.311 |
| 25.80000000000023 | 3.837 | -3.837 | -1.306 | 2.793 | -2.793 | 1.306 |
| 25.85000000000023 | 3.835 | -3.835 | -1.302 | 2.789 | -2.789 | 1.302 |
| 25.90000000000023 | 3.832 | -3.832 | -1.297 | 2.786 | -2.786 | 1.297 |
| 25.95000000000023 | 3.83 | -3.83 | -1.293 | 2.782 | -2.782 | 1.293 |
| 26.00000000000023 | 3.828 | -3.828 | -1.289 | 2.778 | -2.778 | 1.289 |
| 26.05000000000024 | 3.826 | -3.826 | -1.284 | 2.774 | -2.774 | 1.284 |
| 26.10000000000024 | 3.823 | -3.823 | -1.28 | 2.77 | -2.77 | 1.28 |
| 26.15000000000024 | 3.821 | -3.821 | -1.276 | 2.766 | -2.766 | 1.276 |
| 26.20000000000024 | 3.819 | -3.819 | -1.272 | 2.762 | -2.762 | 1.272 |
| 26.25000000000024 | 3.817 | -3.817 | -1.267 | 2.759 | -2.759 | 1.267 |
| 26.30000000000024 | 3.814 | -3.814 | -1.263 | 2.755 | -2.755 | 1.263 |
| 26.35000000000024 | 3.812 | -3.812 | -1.259 | 2.751 | -2.751 | 1.259 |
| 26.40000000000024 | 3.81 | -3.81 | -1.255 | 2.747 | -2.747 | 1.255 |
| 26.45000000000024 | 3.808 | -3.808 | -1.251 | 2.743 | -2.743 | 1.251 |
| 26.50000000000024 | 3.805 | -3.805 | -1.246 | 2.74 | -2.74 | 1.246 |
| 26.55000000000024 | 3.803 | -3.803 | -1.242 | 2.736 | -2.736 | 1.242 |
| 26.60000000000024 | 3.801 | -3.801 | -1.238 | 2.732 | -2.732 | 1.238 |
| 26.65000000000024 | 3.799 | -3.799 | -1.234 | 2.729 | -2.729 | 1.234 |
| 26.70000000000024 | 3.796 | -3.796 | -1.23 | 2.725 | -2.725 | 1.23 |
| 26.75000000000025 | 3.794 | -3.794 | -1.226 | 2.721 | -2.721 | 1.226 |
| 26.80000000000025 | 3.792 | -3.792 | -1.222 | 2.717 | -2.717 | 1.222 |
| 26.85000000000025 | 3.79 | -3.79 | -1.218 | 2.714 | -2.714 | 1.218 |
| 26.90000000000025 | 3.788 | -3.788 | -1.214 | 2.71 | -2.71 | 1.214 |
| 26.95000000000025 | 3.786 | -3.786 | -1.21 | 2.706 | -2.706 | 1.21 |
| 27.00000000000025 | 3.783 | -3.783 | -1.206 | 2.703 | -2.703 | 1.206 |
| 27.05000000000025 | 3.781 | -3.781 | -1.202 | 2.699 | -2.699 | 1.202 |
| 27.10000000000025 | 3.779 | -3.779 | -1.198 | 2.695 | -2.695 | 1.198 |
| 27.15000000000025 | 3.777 | -3.777 | -1.195 | 2.692 | -2.692 | 1.195 |
| 27.20000000000025 | 3.775 | -3.775 | -1.191 | 2.688 | -2.688 | 1.191 |
| 27.25000000000025 | 3.773 | -3.773 | -1.187 | 2.685 | -2.685 | 1.187 |
| 27.30000000000025 | 3.77 | -3.77 | -1.183 | 2.681 | -2.681 | 1.183 |
| 27.35000000000025 | 3.768 | -3.768 | -1.179 | 2.677 | -2.677 | 1.179 |
| 27.40000000000025 | 3.766 | -3.766 | -1.175 | 2.674 | -2.674 | 1.175 |
| 27.45000000000026 | 3.764 | -3.764 | -1.172 | 2.67 | -2.67 | 1.172 |
| 27.50000000000026 | 3.762 | -3.762 | -1.168 | 2.667 | -2.667 | 1.168 |
| 27.55000000000026 | 3.76 | -3.76 | -1.164 | 2.663 | -2.663 | 1.164 |
| 27.60000000000026 | 3.758 | -3.758 | -1.16 | 2.66 | -2.66 | 1.16 |
| 27.65000000000026 | 3.755 | -3.755 | -1.157 | 2.656 | -2.656 | 1.157 |
| 27.70000000000026 | 3.753 | -3.753 | -1.153 | 2.653 | -2.653 | 1.153 |
| 27.75000000000026 | 3.751 | -3.751 | -1.149 | 2.649 | -2.649 | 1.149 |
| 27.80000000000026 | 3.749 | -3.749 | -1.146 | 2.646 | -2.646 | 1.146 |
| 27.85000000000026 | 3.747 | -3.747 | -1.142 | 2.642 | -2.642 | 1.142 |
| 27.90000000000026 | 3.745 | -3.745 | -1.138 | 2.639 | -2.639 | 1.138 |
| 27.95000000000026 | 3.743 | -3.743 | -1.135 | 2.635 | -2.635 | 1.135 |
| 28.00000000000026 | 3.741 | -3.741 | -1.131 | 2.632 | -2.632 | 1.131 |
| 28.05000000000026 | 3.739 | -3.739 | -1.128 | 2.628 | -2.628 | 1.128 |
| 28.10000000000026 | 3.736 | -3.736 | -1.124 | 2.625 | -2.625 | 1.124 |
| 28.15000000000027 | 3.734 | -3.734 | -1.121 | 2.621 | -2.621 | 1.121 |
| 28.20000000000027 | 3.732 | -3.732 | -1.117 | 2.618 | -2.618 | 1.117 |
| 28.25000000000027 | 3.73 | -3.73 | -1.114 | 2.614 | -2.614 | 1.114 |
| 28.30000000000027 | 3.728 | -3.728 | -1.11 | 2.611 | -2.611 | 1.11 |
| 28.35000000000027 | 3.726 | -3.726 | -1.107 | 2.608 | -2.608 | 1.107 |
| 28.40000000000027 | 3.724 | -3.724 | -1.103 | 2.604 | -2.604 | 1.103 |
| 28.45000000000027 | 3.722 | -3.722 | -1.1 | 2.601 | -2.601 | 1.1 |
| 28.50000000000027 | 3.72 | -3.72 | -1.096 | 2.597 | -2.597 | 1.096 |
| 28.55000000000027 | 3.718 | -3.718 | -1.093 | 2.594 | -2.594 | 1.093 |
| 28.60000000000027 | 3.716 | -3.716 | -1.089 | 2.591 | -2.591 | 1.089 |
| 28.65000000000027 | 3.714 | -3.714 | -1.086 | 2.587 | -2.587 | 1.086 |
| 28.70000000000027 | 3.712 | -3.712 | -1.083 | 2.584 | -2.584 | 1.083 |
| 28.75000000000027 | 3.71 | -3.71 | -1.079 | 2.581 | -2.581 | 1.079 |
| 28.80000000000027 | 3.708 | -3.708 | -1.076 | 2.577 | -2.577 | 1.076 |
| 28.85000000000027 | 3.706 | -3.706 | -1.073 | 2.574 | -2.574 | 1.073 |
| 28.90000000000028 | 3.704 | -3.704 | -1.069 | 2.571 | -2.571 | 1.069 |
| 28.95000000000028 | 3.702 | -3.702 | -1.066 | 2.567 | -2.567 | 1.066 |
| 29.00000000000028 | 3.7 | -3.7 | -1.063 | 2.564 | -2.564 | 1.063 |
| 29.05000000000028 | 3.698 | -3.698 | -1.059 | 2.561 | -2.561 | 1.059 |
| 29.10000000000028 | 3.696 | -3.696 | -1.056 | 2.558 | -2.558 | 1.056 |
| 29.15000000000028 | 3.694 | -3.694 | -1.053 | 2.554 | -2.554 | 1.053 |
| 29.20000000000028 | 3.692 | -3.692 | -1.05 | 2.551 | -2.551 | 1.05 |
| 29.25000000000028 | 3.69 | -3.69 | -1.047 | 2.548 | -2.548 | 1.047 |
| 29.30000000000028 | 3.688 | -3.688 | -1.043 | 2.545 | -2.545 | 1.043 |
| 29.35000000000028 | 3.686 | -3.686 | -1.04 | 2.541 | -2.541 | 1.04 |
| 29.40000000000028 | 3.684 | -3.684 | -1.037 | 2.538 | -2.538 | 1.037 |
| 29.45000000000028 | 3.682 | -3.682 | -1.034 | 2.535 | -2.535 | 1.034 |
| 29.50000000000028 | 3.68 | -3.68 | -1.031 | 2.532 | -2.532 | 1.031 |
| 29.55000000000028 | 3.678 | -3.678 | -1.028 | 2.528 | -2.528 | 1.028 |
| 29.60000000000029 | 3.676 | -3.676 | -1.024 | 2.525 | -2.525 | 1.024 |
| 29.65000000000029 | 3.674 | -3.674 | -1.021 | 2.522 | -2.522 | 1.021 |
| 29.70000000000029 | 3.672 | -3.672 | -1.018 | 2.519 | -2.519 | 1.018 |
| 29.75000000000029 | 3.67 | -3.67 | -1.015 | 2.516 | -2.516 | 1.015 |
| 29.80000000000029 | 3.668 | -3.668 | -1.012 | 2.513 | -2.513 | 1.012 |
| 29.85000000000029 | 3.666 | -3.666 | -1.009 | 2.509 | -2.509 | 1.009 |
| 29.90000000000029 | 3.664 | -3.664 | -1.006 | 2.506 | -2.506 | 1.006 |
| 29.95000000000029 | 3.662 | -3.662 | -1.003 | 2.503 | -2.503 | 1.003 |
| 30.00000000000029 | 3.66 | -3.66 | -1 | 2.5 | -2.5 | 1 |
| 30.05000000000029 | 3.658 | -3.658 | -0.997 | 2.497 | -2.497 | 0.997 |
| 30.10000000000029 | 3.656 | -3.656 | -0.994 | 2.494 | -2.494 | 0.994 |
| 30.15000000000029 | 3.654 | -3.654 | -0.991 | 2.491 | -2.491 | 0.991 |
| 30.20000000000029 | 3.653 | -3.653 | -0.988 | 2.488 | -2.488 | 0.988 |
| 30.25000000000029 | 3.651 | -3.651 | -0.985 | 2.484 | -2.484 | 0.985 |
| 30.3000000000003 | 3.649 | -3.649 | -0.982 | 2.481 | -2.481 | 0.982 |
| 30.3500000000003 | 3.647 | -3.647 | -0.979 | 2.478 | -2.478 | 0.979 |
| 30.4000000000003 | 3.645 | -3.645 | -0.976 | 2.475 | -2.475 | 0.976 |
| 30.4500000000003 | 3.643 | -3.643 | -0.974 | 2.472 | -2.472 | 0.974 |
| 30.5000000000003 | 3.641 | -3.641 | -0.971 | 2.469 | -2.469 | 0.971 |
| 30.5500000000003 | 3.639 | -3.639 | -0.968 | 2.466 | -2.466 | 0.968 |
| 30.6000000000003 | 3.637 | -3.637 | -0.965 | 2.463 | -2.463 | 0.965 |
| 30.6500000000003 | 3.635 | -3.635 | -0.962 | 2.46 | -2.46 | 0.962 |
| 30.7000000000003 | 3.634 | -3.634 | -0.959 | 2.457 | -2.457 | 0.959 |
| 30.7500000000003 | 3.632 | -3.632 | -0.956 | 2.454 | -2.454 | 0.956 |
| 30.8000000000003 | 3.63 | -3.63 | -0.954 | 2.451 | -2.451 | 0.954 |
| 30.8500000000003 | 3.628 | -3.628 | -0.951 | 2.448 | -2.448 | 0.951 |
| 30.9000000000003 | 3.626 | -3.626 | -0.948 | 2.445 | -2.445 | 0.948 |
| 30.9500000000003 | 3.624 | -3.624 | -0.945 | 2.442 | -2.442 | 0.945 |
| 31.00000000000031 | 3.622 | -3.622 | -0.943 | 2.439 | -2.439 | 0.943 |
| 31.05000000000031 | 3.62 | -3.62 | -0.94 | 2.436 | -2.436 | 0.94 |
| 31.10000000000031 | 3.619 | -3.619 | -0.937 | 2.433 | -2.433 | 0.937 |
| 31.15000000000031 | 3.617 | -3.617 | -0.934 | 2.43 | -2.43 | 0.934 |
| 31.20000000000031 | 3.615 | -3.615 | -0.932 | 2.427 | -2.427 | 0.932 |
| 31.25000000000031 | 3.613 | -3.613 | -0.929 | 2.424 | -2.424 | 0.929 |
| 31.30000000000031 | 3.611 | -3.611 | -0.926 | 2.421 | -2.421 | 0.926 |
| 31.35000000000031 | 3.609 | -3.609 | -0.924 | 2.418 | -2.418 | 0.924 |
| 31.40000000000031 | 3.607 | -3.607 | -0.921 | 2.415 | -2.415 | 0.921 |
| 31.45000000000031 | 3.606 | -3.606 | -0.918 | 2.413 | -2.413 | 0.918 |
| 31.50000000000031 | 3.604 | -3.604 | -0.916 | 2.41 | -2.41 | 0.916 |
| 31.55000000000031 | 3.602 | -3.602 | -0.913 | 2.407 | -2.407 | 0.913 |
| 31.60000000000031 | 3.6 | -3.6 | -0.91 | 2.404 | -2.404 | 0.91 |
| 31.65000000000031 | 3.598 | -3.598 | -0.908 | 2.401 | -2.401 | 0.908 |
| 31.70000000000032 | 3.597 | -3.597 | -0.905 | 2.398 | -2.398 | 0.905 |
| 31.75000000000032 | 3.595 | -3.595 | -0.902 | 2.395 | -2.395 | 0.902 |
| 31.80000000000032 | 3.593 | -3.593 | -0.9 | 2.392 | -2.392 | 0.9 |
| 31.85000000000032 | 3.591 | -3.591 | -0.897 | 2.389 | -2.389 | 0.897 |
| 31.90000000000032 | 3.589 | -3.589 | -0.895 | 2.387 | -2.387 | 0.895 |
| 31.95000000000032 | 3.588 | -3.588 | -0.892 | 2.384 | -2.384 | 0.892 |
| 32.00000000000032 | 3.586 | -3.586 | -0.89 | 2.381 | -2.381 | 0.89 |
| 32.05000000000032 | 3.584 | -3.584 | -0.887 | 2.378 | -2.378 | 0.887 |
| 32.10000000000031 | 3.582 | -3.582 | -0.885 | 2.375 | -2.375 | 0.885 |
| 32.15000000000031 | 3.58 | -3.58 | -0.882 | 2.372 | -2.372 | 0.882 |
| 32.20000000000031 | 3.579 | -3.579 | -0.88 | 2.37 | -2.37 | 0.88 |
| 32.25000000000031 | 3.577 | -3.577 | -0.877 | 2.367 | -2.367 | 0.877 |
| 32.3000000000003 | 3.575 | -3.575 | -0.875 | 2.364 | -2.364 | 0.875 |
| 32.3500000000003 | 3.573 | -3.573 | -0.872 | 2.361 | -2.361 | 0.872 |
| 32.4000000000003 | 3.571 | -3.571 | -0.87 | 2.358 | -2.358 | 0.87 |
| 32.45000000000029 | 3.57 | -3.57 | -0.867 | 2.356 | -2.356 | 0.867 |
| 32.5000000000003 | 3.568 | -3.568 | -0.865 | 2.353 | -2.353 | 0.865 |
| 32.55000000000029 | 3.566 | -3.566 | -0.862 | 2.35 | -2.35 | 0.862 |
| 32.60000000000029 | 3.564 | -3.564 | -0.86 | 2.347 | -2.347 | 0.86 |
| 32.65000000000028 | 3.563 | -3.563 | -0.858 | 2.345 | -2.345 | 0.858 |
| 32.70000000000028 | 3.561 | -3.561 | -0.855 | 2.342 | -2.342 | 0.855 |
| 32.75000000000028 | 3.559 | -3.559 | -0.853 | 2.339 | -2.339 | 0.853 |
| 32.80000000000027 | 3.557 | -3.557 | -0.85 | 2.336 | -2.336 | 0.85 |
| 32.85000000000027 | 3.556 | -3.556 | -0.848 | 2.334 | -2.334 | 0.848 |
| 32.90000000000027 | 3.554 | -3.554 | -0.846 | 2.331 | -2.331 | 0.846 |
| 32.95000000000027 | 3.552 | -3.552 | -0.843 | 2.328 | -2.328 | 0.843 |
| 33.00000000000026 | 3.55 | -3.55 | -0.841 | 2.326 | -2.326 | 0.841 |
| 33.05000000000026 | 3.549 | -3.549 | -0.839 | 2.323 | -2.323 | 0.839 |
| 33.10000000000026 | 3.547 | -3.547 | -0.836 | 2.32 | -2.32 | 0.836 |
| 33.15000000000025 | 3.545 | -3.545 | -0.834 | 2.317 | -2.317 | 0.834 |
| 33.20000000000025 | 3.543 | -3.543 | -0.832 | 2.315 | -2.315 | 0.832 |
| 33.25000000000025 | 3.542 | -3.542 | -0.829 | 2.312 | -2.312 | 0.829 |
| 33.30000000000025 | 3.54 | -3.54 | -0.827 | 2.309 | -2.309 | 0.827 |
| 33.35000000000024 | 3.538 | -3.538 | -0.825 | 2.307 | -2.307 | 0.825 |
| 33.40000000000024 | 3.537 | -3.537 | -0.823 | 2.304 | -2.304 | 0.823 |
| 33.45000000000024 | 3.535 | -3.535 | -0.82 | 2.301 | -2.301 | 0.82 |
| 33.50000000000023 | 3.533 | -3.533 | -0.818 | 2.299 | -2.299 | 0.818 |
| 33.55000000000023 | 3.531 | -3.531 | -0.816 | 2.296 | -2.296 | 0.816 |
| 33.60000000000023 | 3.53 | -3.53 | -0.814 | 2.294 | -2.294 | 0.814 |
| 33.65000000000023 | 3.528 | -3.528 | -0.811 | 2.291 | -2.291 | 0.811 |
| 33.70000000000022 | 3.526 | -3.526 | -0.809 | 2.288 | -2.288 | 0.809 |
| 33.75000000000022 | 3.525 | -3.525 | -0.807 | 2.286 | -2.286 | 0.807 |
| 33.80000000000022 | 3.523 | -3.523 | -0.805 | 2.283 | -2.283 | 0.805 |
| 33.85000000000021 | 3.521 | -3.521 | -0.803 | 2.281 | -2.281 | 0.803 |
| 33.90000000000021 | 3.52 | -3.52 | -0.801 | 2.278 | -2.278 | 0.801 |
| 33.95000000000021 | 3.518 | -3.518 | -0.798 | 2.275 | -2.275 | 0.798 |
| 34.00000000000021 | 3.516 | -3.516 | -0.796 | 2.273 | -2.273 | 0.796 |
| 34.0500000000002 | 3.515 | -3.515 | -0.794 | 2.27 | -2.27 | 0.794 |
| 34.1000000000002 | 3.513 | -3.513 | -0.792 | 2.268 | -2.268 | 0.792 |
| 34.1500000000002 | 3.511 | -3.511 | -0.79 | 2.265 | -2.265 | 0.79 |
| 34.2000000000002 | 3.51 | -3.51 | -0.788 | 2.262 | -2.262 | 0.788 |
| 34.2500000000002 | 3.508 | -3.508 | -0.786 | 2.26 | -2.26 | 0.786 |
| 34.30000000000019 | 3.506 | -3.506 | -0.783 | 2.257 | -2.257 | 0.783 |
| 34.35000000000019 | 3.505 | -3.505 | -0.781 | 2.255 | -2.255 | 0.781 |
| 34.40000000000018 | 3.503 | -3.503 | -0.779 | 2.252 | -2.252 | 0.779 |
| 34.45000000000018 | 3.501 | -3.501 | -0.777 | 2.25 | -2.25 | 0.777 |
| 34.50000000000018 | 3.5 | -3.5 | -0.775 | 2.247 | -2.247 | 0.775 |
| 34.55000000000017 | 3.498 | -3.498 | -0.773 | 2.245 | -2.245 | 0.773 |
| 34.60000000000017 | 3.496 | -3.496 | -0.771 | 2.242 | -2.242 | 0.771 |
| 34.65000000000017 | 3.495 | -3.495 | -0.769 | 2.24 | -2.24 | 0.769 |
| 34.70000000000017 | 3.493 | -3.493 | -0.767 | 2.237 | -2.237 | 0.767 |
| 34.75000000000016 | 3.491 | -3.491 | -0.765 | 2.235 | -2.235 | 0.765 |
| 34.80000000000016 | 3.49 | -3.49 | -0.763 | 2.232 | -2.232 | 0.763 |
| 34.85000000000016 | 3.488 | -3.488 | -0.761 | 2.23 | -2.23 | 0.761 |
| 34.90000000000015 | 3.487 | -3.487 | -0.759 | 2.227 | -2.227 | 0.759 |
| 34.95000000000015 | 3.485 | -3.485 | -0.757 | 2.225 | -2.225 | 0.757 |
| 35.00000000000015 | 3.483 | -3.483 | -0.755 | 2.222 | -2.222 | 0.755 |
| 35.05000000000015 | 3.482 | -3.482 | -0.753 | 2.22 | -2.22 | 0.753 |
| 35.10000000000014 | 3.48 | -3.48 | -0.751 | 2.217 | -2.217 | 0.751 |
| 35.15000000000014 | 3.478 | -3.478 | -0.749 | 2.215 | -2.215 | 0.749 |
| 35.20000000000014 | 3.477 | -3.477 | -0.747 | 2.212 | -2.212 | 0.747 |
| 35.25000000000013 | 3.475 | -3.475 | -0.745 | 2.21 | -2.21 | 0.745 |
| 35.30000000000013 | 3.474 | -3.474 | -0.743 | 2.208 | -2.208 | 0.743 |
| 35.35000000000013 | 3.472 | -3.472 | -0.741 | 2.205 | -2.205 | 0.741 |
| 35.40000000000013 | 3.47 | -3.47 | -0.739 | 2.203 | -2.203 | 0.739 |
| 35.45000000000012 | 3.469 | -3.469 | -0.737 | 2.2 | -2.2 | 0.737 |
| 35.50000000000012 | 3.467 | -3.467 | -0.735 | 2.198 | -2.198 | 0.735 |
| 35.55000000000012 | 3.466 | -3.466 | -0.733 | 2.195 | -2.195 | 0.733 |
| 35.60000000000012 | 3.464 | -3.464 | -0.731 | 2.193 | -2.193 | 0.731 |
| 35.65000000000011 | 3.462 | -3.462 | -0.729 | 2.191 | -2.191 | 0.729 |
| 35.70000000000011 | 3.461 | -3.461 | -0.728 | 2.188 | -2.188 | 0.728 |
| 35.75000000000011 | 3.459 | -3.459 | -0.726 | 2.186 | -2.186 | 0.726 |
| 35.8000000000001 | 3.458 | -3.458 | -0.724 | 2.183 | -2.183 | 0.724 |
| 35.8500000000001 | 3.456 | -3.456 | -0.722 | 2.181 | -2.181 | 0.722 |
| 35.9000000000001 | 3.455 | -3.455 | -0.72 | 2.179 | -2.179 | 0.72 |
| 35.9500000000001 | 3.453 | -3.453 | -0.718 | 2.176 | -2.176 | 0.718 |
| 36.0000000000001 | 3.451 | -3.451 | -0.716 | 2.174 | -2.174 | 0.716 |
| 36.05000000000009 | 3.45 | -3.45 | -0.714 | 2.172 | -2.172 | 0.714 |
| 36.10000000000009 | 3.448 | -3.448 | -0.713 | 2.169 | -2.169 | 0.713 |
| 36.15000000000008 | 3.447 | -3.447 | -0.711 | 2.167 | -2.167 | 0.711 |
| 36.20000000000008 | 3.445 | -3.445 | -0.709 | 2.165 | -2.165 | 0.709 |
| 36.25000000000008 | 3.444 | -3.444 | -0.707 | 2.162 | -2.162 | 0.707 |
| 36.30000000000008 | 3.442 | -3.442 | -0.705 | 2.16 | -2.16 | 0.705 |
| 36.35000000000007 | 3.44 | -3.44 | -0.704 | 2.157 | -2.157 | 0.704 |
| 36.40000000000007 | 3.439 | -3.439 | -0.702 | 2.155 | -2.155 | 0.702 |
| 36.45000000000007 | 3.437 | -3.437 | -0.7 | 2.153 | -2.153 | 0.7 |
| 36.50000000000006 | 3.436 | -3.436 | -0.698 | 2.151 | -2.151 | 0.698 |
| 36.55000000000006 | 3.434 | -3.434 | -0.696 | 2.148 | -2.148 | 0.696 |
| 36.60000000000006 | 3.433 | -3.433 | -0.695 | 2.146 | -2.146 | 0.695 |
| 36.65000000000006 | 3.431 | -3.431 | -0.693 | 2.144 | -2.144 | 0.693 |
| 36.70000000000005 | 3.43 | -3.43 | -0.691 | 2.141 | -2.141 | 0.691 |
| 36.75000000000005 | 3.428 | -3.428 | -0.689 | 2.139 | -2.139 | 0.689 |
| 36.80000000000005 | 3.427 | -3.427 | -0.688 | 2.137 | -2.137 | 0.688 |
| 36.85000000000004 | 3.425 | -3.425 | -0.686 | 2.134 | -2.134 | 0.686 |
| 36.90000000000004 | 3.424 | -3.424 | -0.684 | 2.132 | -2.132 | 0.684 |
| 36.95000000000004 | 3.422 | -3.422 | -0.682 | 2.13 | -2.13 | 0.682 |
| 37.00000000000004 | 3.421 | -3.421 | -0.681 | 2.128 | -2.128 | 0.681 |
| 37.05000000000003 | 3.419 | -3.419 | -0.679 | 2.125 | -2.125 | 0.679 |
| 37.10000000000003 | 3.417 | -3.417 | -0.677 | 2.123 | -2.123 | 0.677 |
| 37.15000000000003 | 3.416 | -3.416 | -0.676 | 2.121 | -2.121 | 0.676 |
| 37.20000000000002 | 3.414 | -3.414 | -0.674 | 2.119 | -2.119 | 0.674 |
| 37.25000000000002 | 3.413 | -3.413 | -0.672 | 2.116 | -2.116 | 0.672 |
| 37.30000000000002 | 3.411 | -3.411 | -0.671 | 2.114 | -2.114 | 0.671 |
| 37.35000000000002 | 3.41 | -3.41 | -0.669 | 2.112 | -2.112 | 0.669 |
| 37.40000000000001 | 3.408 | -3.408 | -0.667 | 2.11 | -2.11 | 0.667 |
| 37.45000000000001 | 3.407 | -3.407 | -0.666 | 2.107 | -2.107 | 0.666 |
| 37.50000000000001 | 3.405 | -3.405 | -0.664 | 2.105 | -2.105 | 0.664 |
| 37.55 | 3.404 | -3.404 | -0.662 | 2.103 | -2.103 | 0.662 |
| 37.6 | 3.402 | -3.402 | -0.661 | 2.101 | -2.101 | 0.661 |
| 37.65 | 3.401 | -3.401 | -0.659 | 2.099 | -2.099 | 0.659 |
| 37.7 | 3.399 | -3.399 | -0.657 | 2.096 | -2.096 | 0.657 |
| 37.75 | 3.398 | -3.398 | -0.656 | 2.094 | -2.094 | 0.656 |
| 37.79999999999998 | 3.396 | -3.396 | -0.654 | 2.092 | -2.092 | 0.654 |
| 37.84999999999999 | 3.395 | -3.395 | -0.652 | 2.09 | -2.09 | 0.652 |
| 37.89999999999998 | 3.394 | -3.394 | -0.651 | 2.088 | -2.088 | 0.651 |
| 37.94999999999998 | 3.392 | -3.392 | -0.649 | 2.086 | -2.086 | 0.649 |
| 37.99999999999997 | 3.391 | -3.391 | -0.648 | 2.083 | -2.083 | 0.648 |
| 38.04999999999997 | 3.389 | -3.389 | -0.646 | 2.081 | -2.081 | 0.646 |
| 38.09999999999997 | 3.388 | -3.388 | -0.644 | 2.079 | -2.079 | 0.644 |
| 38.14999999999997 | 3.386 | -3.386 | -0.643 | 2.077 | -2.077 | 0.643 |
| 38.19999999999996 | 3.385 | -3.385 | -0.641 | 2.075 | -2.075 | 0.641 |
| 38.24999999999996 | 3.383 | -3.383 | -0.64 | 2.073 | -2.073 | 0.64 |
| 38.29999999999996 | 3.382 | -3.382 | -0.638 | 2.07 | -2.07 | 0.638 |
| 38.34999999999996 | 3.38 | -3.38 | -0.637 | 2.068 | -2.068 | 0.637 |
| 38.39999999999995 | 3.379 | -3.379 | -0.635 | 2.066 | -2.066 | 0.635 |
| 38.44999999999995 | 3.377 | -3.377 | -0.634 | 2.064 | -2.064 | 0.634 |
| 38.49999999999995 | 3.376 | -3.376 | -0.632 | 2.062 | -2.062 | 0.632 |
| 38.54999999999994 | 3.374 | -3.374 | -0.63 | 2.06 | -2.06 | 0.63 |
| 38.59999999999994 | 3.373 | -3.373 | -0.629 | 2.058 | -2.058 | 0.629 |
| 38.64999999999994 | 3.372 | -3.372 | -0.627 | 2.055 | -2.055 | 0.627 |
| 38.69999999999993 | 3.37 | -3.37 | -0.626 | 2.053 | -2.053 | 0.626 |
| 38.74999999999993 | 3.369 | -3.369 | -0.624 | 2.051 | -2.051 | 0.624 |
| 38.79999999999993 | 3.367 | -3.367 | -0.623 | 2.049 | -2.049 | 0.623 |
| 38.84999999999993 | 3.366 | -3.366 | -0.621 | 2.047 | -2.047 | 0.621 |
| 38.89999999999992 | 3.364 | -3.364 | -0.62 | 2.045 | -2.045 | 0.62 |
| 38.94999999999992 | 3.363 | -3.363 | -0.618 | 2.043 | -2.043 | 0.618 |
| 38.99999999999992 | 3.362 | -3.362 | -0.617 | 2.041 | -2.041 | 0.617 |
| 39.04999999999992 | 3.36 | -3.36 | -0.615 | 2.039 | -2.039 | 0.615 |
| 39.09999999999991 | 3.359 | -3.359 | -0.614 | 2.037 | -2.037 | 0.614 |
| 39.14999999999991 | 3.357 | -3.357 | -0.612 | 2.035 | -2.035 | 0.612 |
| 39.1999999999999 | 3.356 | -3.356 | -0.611 | 2.033 | -2.033 | 0.611 |
| 39.2499999999999 | 3.354 | -3.354 | -0.61 | 2.03 | -2.03 | 0.61 |
| 39.2999999999999 | 3.353 | -3.353 | -0.608 | 2.028 | -2.028 | 0.608 |
| 39.3499999999999 | 3.352 | -3.352 | -0.607 | 2.026 | -2.026 | 0.607 |
| 39.3999999999999 | 3.35 | -3.35 | -0.605 | 2.024 | -2.024 | 0.605 |
| 39.4499999999999 | 3.349 | -3.349 | -0.604 | 2.022 | -2.022 | 0.604 |
| 39.4999999999999 | 3.347 | -3.347 | -0.602 | 2.02 | -2.02 | 0.602 |
| 39.5499999999999 | 3.346 | -3.346 | -0.601 | 2.018 | -2.018 | 0.601 |
| 39.59999999999988 | 3.345 | -3.345 | -0.599 | 2.016 | -2.016 | 0.599 |
| 39.64999999999988 | 3.343 | -3.343 | -0.598 | 2.014 | -2.014 | 0.598 |
| 39.69999999999988 | 3.342 | -3.342 | -0.597 | 2.012 | -2.012 | 0.597 |
| 39.74999999999987 | 3.34 | -3.34 | -0.595 | 2.01 | -2.01 | 0.595 |
| 39.79999999999987 | 3.339 | -3.339 | -0.594 | 2.008 | -2.008 | 0.594 |
| 39.84999999999987 | 3.338 | -3.338 | -0.592 | 2.006 | -2.006 | 0.592 |
| 39.89999999999987 | 3.336 | -3.336 | -0.591 | 2.004 | -2.004 | 0.591 |
| 39.94999999999987 | 3.335 | -3.335 | -0.59 | 2.002 | -2.002 | 0.59 |
| 39.99999999999986 | 3.333 | -3.333 | -0.588 | 2 | -2 | 0.588 |
| 40.04999999999986 | 3.332 | -3.332 | -0.587 | 1.998 | -1.998 | 0.587 |
| 40.09999999999985 | 3.331 | -3.331 | -0.585 | 1.996 | -1.996 | 0.585 |
| 40.14999999999985 | 3.329 | -3.329 | -0.584 | 1.994 | -1.994 | 0.584 |
| 40.19999999999985 | 3.328 | -3.328 | -0.583 | 1.992 | -1.992 | 0.583 |
| 40.24999999999985 | 3.326 | -3.326 | -0.581 | 1.99 | -1.99 | 0.581 |
| 40.29999999999984 | 3.325 | -3.325 | -0.58 | 1.988 | -1.988 | 0.58 |
| 40.34999999999984 | 3.324 | -3.324 | -0.579 | 1.986 | -1.986 | 0.579 |
| 40.39999999999984 | 3.322 | -3.322 | -0.577 | 1.984 | -1.984 | 0.577 |
| 40.44999999999984 | 3.321 | -3.321 | -0.576 | 1.982 | -1.982 | 0.576 |
| 40.49999999999983 | 3.32 | -3.32 | -0.575 | 1.98 | -1.98 | 0.575 |
| 40.54999999999983 | 3.318 | -3.318 | -0.573 | 1.978 | -1.978 | 0.573 |
| 40.59999999999983 | 3.317 | -3.317 | -0.572 | 1.976 | -1.976 | 0.572 |
| 40.64999999999982 | 3.315 | -3.315 | -0.571 | 1.974 | -1.974 | 0.571 |
| 40.69999999999982 | 3.314 | -3.314 | -0.569 | 1.972 | -1.972 | 0.569 |
| 40.74999999999982 | 3.313 | -3.313 | -0.568 | 1.97 | -1.97 | 0.568 |
| 40.79999999999981 | 3.311 | -3.311 | -0.567 | 1.969 | -1.969 | 0.567 |
| 40.84999999999982 | 3.31 | -3.31 | -0.565 | 1.967 | -1.967 | 0.565 |
| 40.89999999999981 | 3.309 | -3.309 | -0.564 | 1.965 | -1.965 | 0.564 |
| 40.94999999999981 | 3.307 | -3.307 | -0.563 | 1.963 | -1.963 | 0.563 |
| 40.9999999999998 | 3.306 | -3.306 | -0.561 | 1.961 | -1.961 | 0.561 |
| 41.0499999999998 | 3.305 | -3.305 | -0.56 | 1.959 | -1.959 | 0.56 |
| 41.0999999999998 | 3.303 | -3.303 | -0.559 | 1.957 | -1.957 | 0.559 |
| 41.1499999999998 | 3.302 | -3.302 | -0.558 | 1.955 | -1.955 | 0.558 |
| 41.1999999999998 | 3.301 | -3.301 | -0.556 | 1.953 | -1.953 | 0.556 |
| 41.2499999999998 | 3.299 | -3.299 | -0.555 | 1.951 | -1.951 | 0.555 |
| 41.2999999999998 | 3.298 | -3.298 | -0.554 | 1.949 | -1.949 | 0.554 |
| 41.34999999999979 | 3.297 | -3.297 | -0.553 | 1.947 | -1.947 | 0.553 |
| 41.39999999999978 | 3.295 | -3.295 | -0.551 | 1.946 | -1.946 | 0.551 |
| 41.44999999999978 | 3.294 | -3.294 | -0.55 | 1.944 | -1.944 | 0.55 |
| 41.49999999999977 | 3.293 | -3.293 | -0.549 | 1.942 | -1.942 | 0.549 |
| 41.54999999999977 | 3.291 | -3.291 | -0.548 | 1.94 | -1.94 | 0.548 |
| 41.59999999999977 | 3.29 | -3.29 | -0.546 | 1.938 | -1.938 | 0.546 |
| 41.64999999999977 | 3.289 | -3.289 | -0.545 | 1.936 | -1.936 | 0.545 |
| 41.69999999999976 | 3.287 | -3.287 | -0.544 | 1.934 | -1.934 | 0.544 |
| 41.74999999999976 | 3.286 | -3.286 | -0.543 | 1.932 | -1.932 | 0.543 |
| 41.79999999999976 | 3.285 | -3.285 | -0.541 | 1.931 | -1.931 | 0.541 |
| 41.84999999999976 | 3.283 | -3.283 | -0.54 | 1.929 | -1.929 | 0.54 |
| 41.89999999999975 | 3.282 | -3.282 | -0.539 | 1.927 | -1.927 | 0.539 |
| 41.94999999999975 | 3.281 | -3.281 | -0.538 | 1.925 | -1.925 | 0.538 |
| 41.99999999999975 | 3.279 | -3.279 | -0.536 | 1.923 | -1.923 | 0.536 |
| 42.04999999999974 | 3.278 | -3.278 | -0.535 | 1.921 | -1.921 | 0.535 |
| 42.09999999999974 | 3.277 | -3.277 | -0.534 | 1.919 | -1.919 | 0.534 |
| 42.14999999999974 | 3.275 | -3.275 | -0.533 | 1.918 | -1.918 | 0.533 |
| 42.19999999999973 | 3.274 | -3.274 | -0.532 | 1.916 | -1.916 | 0.532 |
| 42.24999999999973 | 3.273 | -3.273 | -0.53 | 1.914 | -1.914 | 0.53 |
| 42.29999999999973 | 3.272 | -3.272 | -0.529 | 1.912 | -1.912 | 0.529 |
| 42.34999999999973 | 3.27 | -3.27 | -0.528 | 1.91 | -1.91 | 0.528 |
| 42.39999999999972 | 3.269 | -3.269 | -0.527 | 1.908 | -1.908 | 0.527 |
| 42.44999999999972 | 3.268 | -3.268 | -0.526 | 1.907 | -1.907 | 0.526 |
| 42.49999999999972 | 3.266 | -3.266 | -0.525 | 1.905 | -1.905 | 0.525 |
| 42.54999999999972 | 3.265 | -3.265 | -0.523 | 1.903 | -1.903 | 0.523 |
| 42.59999999999971 | 3.264 | -3.264 | -0.522 | 1.901 | -1.901 | 0.522 |
| 42.64999999999971 | 3.262 | -3.262 | -0.521 | 1.899 | -1.899 | 0.521 |
| 42.6999999999997 | 3.261 | -3.261 | -0.52 | 1.898 | -1.898 | 0.52 |
| 42.7499999999997 | 3.26 | -3.26 | -0.519 | 1.896 | -1.896 | 0.519 |
| 42.7999999999997 | 3.259 | -3.259 | -0.518 | 1.894 | -1.894 | 0.518 |
| 42.8499999999997 | 3.257 | -3.257 | -0.516 | 1.892 | -1.892 | 0.516 |
| 42.8999999999997 | 3.256 | -3.256 | -0.515 | 1.89 | -1.89 | 0.515 |
| 42.9499999999997 | 3.255 | -3.255 | -0.514 | 1.889 | -1.889 | 0.514 |
| 42.9999999999997 | 3.253 | -3.253 | -0.513 | 1.887 | -1.887 | 0.513 |
| 43.0499999999997 | 3.252 | -3.252 | -0.512 | 1.885 | -1.885 | 0.512 |
| 43.09999999999969 | 3.251 | -3.251 | -0.511 | 1.883 | -1.883 | 0.511 |
| 43.14999999999969 | 3.25 | -3.25 | -0.51 | 1.881 | -1.881 | 0.51 |
| 43.19999999999968 | 3.248 | -3.248 | -0.509 | 1.88 | -1.88 | 0.509 |
| 43.24999999999968 | 3.247 | -3.247 | -0.507 | 1.878 | -1.878 | 0.507 |
| 43.29999999999967 | 3.246 | -3.246 | -0.506 | 1.876 | -1.876 | 0.506 |
| 43.34999999999967 | 3.245 | -3.245 | -0.505 | 1.874 | -1.874 | 0.505 |
| 43.39999999999967 | 3.243 | -3.243 | -0.504 | 1.873 | -1.873 | 0.504 |
| 43.44999999999967 | 3.242 | -3.242 | -0.503 | 1.871 | -1.871 | 0.503 |
| 43.49999999999967 | 3.241 | -3.241 | -0.502 | 1.869 | -1.869 | 0.502 |
| 43.54999999999966 | 3.24 | -3.24 | -0.501 | 1.867 | -1.867 | 0.501 |
| 43.59999999999966 | 3.238 | -3.238 | -0.5 | 1.866 | -1.866 | 0.5 |
| 43.64999999999966 | 3.237 | -3.237 | -0.499 | 1.864 | -1.864 | 0.499 |
| 43.69999999999965 | 3.236 | -3.236 | -0.498 | 1.862 | -1.862 | 0.498 |
| 43.74999999999965 | 3.235 | -3.235 | -0.497 | 1.86 | -1.86 | 0.497 |
| 43.79999999999964 | 3.233 | -3.233 | -0.495 | 1.859 | -1.859 | 0.495 |
| 43.84999999999965 | 3.232 | -3.232 | -0.494 | 1.857 | -1.857 | 0.494 |
| 43.89999999999964 | 3.231 | -3.231 | -0.493 | 1.855 | -1.855 | 0.493 |
| 43.94999999999964 | 3.23 | -3.23 | -0.492 | 1.854 | -1.854 | 0.492 |
| 43.99999999999964 | 3.228 | -3.228 | -0.491 | 1.852 | -1.852 | 0.491 |
| 44.04999999999963 | 3.227 | -3.227 | -0.49 | 1.85 | -1.85 | 0.49 |
| 44.09999999999963 | 3.226 | -3.226 | -0.489 | 1.848 | -1.848 | 0.489 |
| 44.14999999999963 | 3.225 | -3.225 | -0.488 | 1.847 | -1.847 | 0.488 |
| 44.19999999999962 | 3.223 | -3.223 | -0.487 | 1.845 | -1.845 | 0.487 |
| 44.24999999999962 | 3.222 | -3.222 | -0.486 | 1.843 | -1.843 | 0.486 |
| 44.29999999999962 | 3.221 | -3.221 | -0.485 | 1.842 | -1.842 | 0.485 |
| 44.34999999999962 | 3.22 | -3.22 | -0.484 | 1.84 | -1.84 | 0.484 |
| 44.39999999999961 | 3.218 | -3.218 | -0.483 | 1.838 | -1.838 | 0.483 |
| 44.44999999999961 | 3.217 | -3.217 | -0.482 | 1.837 | -1.837 | 0.482 |
| 44.49999999999961 | 3.216 | -3.216 | -0.481 | 1.835 | -1.835 | 0.481 |
| 44.54999999999961 | 3.215 | -3.215 | -0.48 | 1.833 | -1.833 | 0.48 |
| 44.5999999999996 | 3.214 | -3.214 | -0.479 | 1.832 | -1.832 | 0.479 |
| 44.6499999999996 | 3.212 | -3.212 | -0.478 | 1.83 | -1.83 | 0.478 |
| 44.6999999999996 | 3.211 | -3.211 | -0.477 | 1.828 | -1.828 | 0.477 |
| 44.7499999999996 | 3.21 | -3.21 | -0.476 | 1.826 | -1.826 | 0.476 |
| 44.7999999999996 | 3.209 | -3.209 | -0.475 | 1.825 | -1.825 | 0.475 |
| 44.84999999999959 | 3.207 | -3.207 | -0.474 | 1.823 | -1.823 | 0.474 |
| 44.89999999999959 | 3.206 | -3.206 | -0.473 | 1.821 | -1.821 | 0.473 |
| 44.94999999999958 | 3.205 | -3.205 | -0.472 | 1.82 | -1.82 | 0.472 |
| 44.99999999999958 | 3.204 | -3.204 | -0.471 | 1.818 | -1.818 | 0.471 |
| 45.04999999999958 | 3.203 | -3.203 | -0.47 | 1.817 | -1.817 | 0.47 |
| 45.09999999999957 | 3.201 | -3.201 | -0.469 | 1.815 | -1.815 | 0.469 |
| 45.14999999999957 | 3.2 | -3.2 | -0.468 | 1.813 | -1.813 | 0.468 |
| 45.19999999999957 | 3.199 | -3.199 | -0.467 | 1.812 | -1.812 | 0.467 |
| 45.24999999999957 | 3.198 | -3.198 | -0.466 | 1.81 | -1.81 | 0.466 |
| 45.29999999999956 | 3.197 | -3.197 | -0.465 | 1.808 | -1.808 | 0.465 |
| 45.34999999999956 | 3.195 | -3.195 | -0.464 | 1.807 | -1.807 | 0.464 |
| 45.39999999999956 | 3.194 | -3.194 | -0.463 | 1.805 | -1.805 | 0.463 |
| 45.44999999999956 | 3.193 | -3.193 | -0.462 | 1.803 | -1.803 | 0.462 |
| 45.49999999999955 | 3.192 | -3.192 | -0.461 | 1.802 | -1.802 | 0.461 |
| 45.54999999999955 | 3.191 | -3.191 | -0.46 | 1.8 | -1.8 | 0.46 |
| 45.59999999999954 | 3.189 | -3.189 | -0.459 | 1.799 | -1.799 | 0.459 |
| 45.64999999999954 | 3.188 | -3.188 | -0.458 | 1.797 | -1.797 | 0.458 |
| 45.69999999999954 | 3.187 | -3.187 | -0.457 | 1.795 | -1.795 | 0.457 |
| 45.74999999999954 | 3.186 | -3.186 | -0.456 | 1.794 | -1.794 | 0.456 |
| 45.79999999999953 | 3.185 | -3.185 | -0.455 | 1.792 | -1.792 | 0.455 |
| 45.84999999999953 | 3.183 | -3.183 | -0.454 | 1.791 | -1.791 | 0.454 |
| 45.89999999999953 | 3.182 | -3.182 | -0.453 | 1.789 | -1.789 | 0.453 |
| 45.94999999999953 | 3.181 | -3.181 | -0.452 | 1.787 | -1.787 | 0.452 |
| 45.99999999999952 | 3.18 | -3.18 | -0.451 | 1.786 | -1.786 | 0.451 |
| 46.04999999999952 | 3.179 | -3.179 | -0.45 | 1.784 | -1.784 | 0.45 |
| 46.09999999999952 | 3.178 | -3.178 | -0.449 | 1.783 | -1.783 | 0.449 |
| 46.14999999999952 | 3.176 | -3.176 | -0.448 | 1.781 | -1.781 | 0.448 |
| 46.19999999999951 | 3.175 | -3.175 | -0.448 | 1.779 | -1.779 | 0.448 |
| 46.24999999999951 | 3.174 | -3.174 | -0.447 | 1.778 | -1.778 | 0.447 |
| 46.2999999999995 | 3.173 | -3.173 | -0.446 | 1.776 | -1.776 | 0.446 |
| 46.3499999999995 | 3.172 | -3.172 | -0.445 | 1.775 | -1.775 | 0.445 |
| 46.3999999999995 | 3.171 | -3.171 | -0.444 | 1.773 | -1.773 | 0.444 |
| 46.4499999999995 | 3.169 | -3.169 | -0.443 | 1.771 | -1.771 | 0.443 |
| 46.4999999999995 | 3.168 | -3.168 | -0.442 | 1.77 | -1.77 | 0.442 |
| 46.5499999999995 | 3.167 | -3.167 | -0.441 | 1.768 | -1.768 | 0.441 |
| 46.59999999999949 | 3.166 | -3.166 | -0.44 | 1.767 | -1.767 | 0.44 |
| 46.64999999999949 | 3.165 | -3.165 | -0.439 | 1.765 | -1.765 | 0.439 |
| 46.69999999999948 | 3.164 | -3.164 | -0.438 | 1.764 | -1.764 | 0.438 |
| 46.74999999999948 | 3.162 | -3.162 | -0.438 | 1.762 | -1.762 | 0.438 |
| 46.79999999999947 | 3.161 | -3.161 | -0.437 | 1.761 | -1.761 | 0.437 |
| 46.84999999999948 | 3.16 | -3.16 | -0.436 | 1.759 | -1.759 | 0.436 |
| 46.89999999999947 | 3.159 | -3.159 | -0.435 | 1.757 | -1.757 | 0.435 |
| 46.94999999999947 | 3.158 | -3.158 | -0.434 | 1.756 | -1.756 | 0.434 |
| 46.99999999999947 | 3.157 | -3.157 | -0.433 | 1.754 | -1.754 | 0.433 |
| 47.04999999999946 | 3.155 | -3.155 | -0.432 | 1.753 | -1.753 | 0.432 |
| 47.09999999999946 | 3.154 | -3.154 | -0.431 | 1.751 | -1.751 | 0.431 |
| 47.14999999999946 | 3.153 | -3.153 | -0.43 | 1.75 | -1.75 | 0.43 |
| 47.19999999999945 | 3.152 | -3.152 | -0.43 | 1.748 | -1.748 | 0.43 |
| 47.24999999999945 | 3.151 | -3.151 | -0.429 | 1.747 | -1.747 | 0.429 |
| 47.29999999999945 | 3.15 | -3.15 | -0.428 | 1.745 | -1.745 | 0.428 |
| 47.34999999999945 | 3.149 | -3.149 | -0.427 | 1.744 | -1.744 | 0.427 |
| 47.39999999999944 | 3.147 | -3.147 | -0.426 | 1.742 | -1.742 | 0.426 |
| 47.44999999999944 | 3.146 | -3.146 | -0.425 | 1.741 | -1.741 | 0.425 |
| 47.49999999999944 | 3.145 | -3.145 | -0.424 | 1.739 | -1.739 | 0.424 |
| 47.54999999999944 | 3.144 | -3.144 | -0.424 | 1.738 | -1.738 | 0.424 |
| 47.59999999999943 | 3.143 | -3.143 | -0.423 | 1.736 | -1.736 | 0.423 |
| 47.64999999999943 | 3.142 | -3.142 | -0.422 | 1.735 | -1.735 | 0.422 |
| 47.69999999999942 | 3.141 | -3.141 | -0.421 | 1.733 | -1.733 | 0.421 |
| 47.74999999999942 | 3.14 | -3.14 | -0.42 | 1.732 | -1.732 | 0.42 |
| 47.79999999999942 | 3.138 | -3.138 | -0.419 | 1.73 | -1.73 | 0.419 |
| 47.84999999999942 | 3.137 | -3.137 | -0.418 | 1.729 | -1.729 | 0.418 |
| 47.89999999999942 | 3.136 | -3.136 | -0.418 | 1.727 | -1.727 | 0.418 |
| 47.94999999999941 | 3.135 | -3.135 | -0.417 | 1.726 | -1.726 | 0.417 |
| 47.99999999999941 | 3.134 | -3.134 | -0.416 | 1.724 | -1.724 | 0.416 |
| 48.04999999999941 | 3.133 | -3.133 | -0.415 | 1.723 | -1.723 | 0.415 |
| 48.0999999999994 | 3.132 | -3.132 | -0.414 | 1.721 | -1.721 | 0.414 |
| 48.1499999999994 | 3.131 | -3.131 | -0.413 | 1.72 | -1.72 | 0.413 |
| 48.1999999999994 | 3.129 | -3.129 | -0.413 | 1.718 | -1.718 | 0.413 |
| 48.2499999999994 | 3.128 | -3.128 | -0.412 | 1.717 | -1.717 | 0.412 |
| 48.2999999999994 | 3.127 | -3.127 | -0.411 | 1.715 | -1.715 | 0.411 |
| 48.3499999999994 | 3.126 | -3.126 | -0.41 | 1.714 | -1.714 | 0.41 |
| 48.39999999999939 | 3.125 | -3.125 | -0.409 | 1.712 | -1.712 | 0.409 |
| 48.44999999999938 | 3.124 | -3.124 | -0.409 | 1.711 | -1.711 | 0.409 |
| 48.49999999999938 | 3.123 | -3.123 | -0.408 | 1.709 | -1.709 | 0.408 |
| 48.54999999999938 | 3.122 | -3.122 | -0.407 | 1.708 | -1.708 | 0.407 |
| 48.59999999999937 | 3.121 | -3.121 | -0.406 | 1.706 | -1.706 | 0.406 |
| 48.64999999999937 | 3.119 | -3.119 | -0.405 | 1.705 | -1.705 | 0.405 |
| 48.69999999999937 | 3.118 | -3.118 | -0.405 | 1.704 | -1.704 | 0.405 |
| 48.74999999999937 | 3.117 | -3.117 | -0.404 | 1.702 | -1.702 | 0.404 |
| 48.79999999999936 | 3.116 | -3.116 | -0.403 | 1.701 | -1.701 | 0.403 |
| 48.84999999999936 | 3.115 | -3.115 | -0.402 | 1.699 | -1.699 | 0.402 |
| 48.89999999999936 | 3.114 | -3.114 | -0.401 | 1.698 | -1.698 | 0.401 |
| 48.94999999999936 | 3.113 | -3.113 | -0.401 | 1.696 | -1.696 | 0.401 |
| 48.99999999999935 | 3.112 | -3.112 | -0.4 | 1.695 | -1.695 | 0.4 |
| 49.04999999999935 | 3.111 | -3.111 | -0.399 | 1.693 | -1.693 | 0.399 |
| 49.09999999999934 | 3.11 | -3.11 | -0.398 | 1.692 | -1.692 | 0.398 |
| 49.14999999999934 | 3.109 | -3.109 | -0.398 | 1.691 | -1.691 | 0.398 |
| 49.19999999999934 | 3.107 | -3.107 | -0.397 | 1.689 | -1.689 | 0.397 |
| 49.24999999999934 | 3.106 | -3.106 | -0.396 | 1.688 | -1.688 | 0.396 |
| 49.29999999999933 | 3.105 | -3.105 | -0.395 | 1.686 | -1.686 | 0.395 |
| 49.34999999999933 | 3.104 | -3.104 | -0.394 | 1.685 | -1.685 | 0.394 |
| 49.39999999999933 | 3.103 | -3.103 | -0.394 | 1.684 | -1.684 | 0.394 |
| 49.44999999999933 | 3.102 | -3.102 | -0.393 | 1.682 | -1.682 | 0.393 |
| 49.49999999999932 | 3.101 | -3.101 | -0.392 | 1.681 | -1.681 | 0.392 |
| 49.54999999999932 | 3.1 | -3.1 | -0.391 | 1.679 | -1.679 | 0.391 |
| 49.59999999999932 | 3.099 | -3.099 | -0.391 | 1.678 | -1.678 | 0.391 |
| 49.64999999999932 | 3.098 | -3.098 | -0.39 | 1.676 | -1.676 | 0.39 |
| 49.69999999999931 | 3.097 | -3.097 | -0.389 | 1.675 | -1.675 | 0.389 |
| 49.74999999999931 | 3.096 | -3.096 | -0.388 | 1.674 | -1.674 | 0.388 |
| 49.7999999999993 | 3.094 | -3.094 | -0.388 | 1.672 | -1.672 | 0.388 |
| 49.84999999999931 | 3.093 | -3.093 | -0.387 | 1.671 | -1.671 | 0.387 |
| 49.8999999999993 | 3.092 | -3.092 | -0.386 | 1.669 | -1.669 | 0.386 |
| 49.9499999999993 | 3.091 | -3.091 | -0.385 | 1.668 | -1.668 | 0.385 |
| 49.9999999999993 | 3.09 | -3.09 | -0.385 | 1.667 | -1.667 | 0.385 |
| 50.0499999999993 | 3.089 | -3.089 | -0.384 | 1.665 | -1.665 | 0.384 |
| 50.0999999999993 | 3.088 | -3.088 | -0.383 | 1.664 | -1.664 | 0.383 |
| 50.14999999999929 | 3.087 | -3.087 | -0.382 | 1.663 | -1.663 | 0.382 |
| 50.19999999999928 | 3.086 | -3.086 | -0.382 | 1.661 | -1.661 | 0.382 |
| 50.24999999999928 | 3.085 | -3.085 | -0.381 | 1.66 | -1.66 | 0.381 |
| 50.29999999999927 | 3.084 | -3.084 | -0.38 | 1.658 | -1.658 | 0.38 |
| 50.34999999999928 | 3.083 | -3.083 | -0.379 | 1.657 | -1.657 | 0.379 |
| 50.39999999999927 | 3.082 | -3.082 | -0.379 | 1.656 | -1.656 | 0.379 |
| 50.44999999999927 | 3.081 | -3.081 | -0.378 | 1.654 | -1.654 | 0.378 |
| 50.49999999999927 | 3.08 | -3.08 | -0.377 | 1.653 | -1.653 | 0.377 |
| 50.54999999999927 | 3.079 | -3.079 | -0.377 | 1.652 | -1.652 | 0.377 |
| 50.59999999999926 | 3.077 | -3.077 | -0.376 | 1.65 | -1.65 | 0.376 |
| 50.64999999999926 | 3.076 | -3.076 | -0.375 | 1.649 | -1.649 | 0.375 |
| 50.69999999999925 | 3.075 | -3.075 | -0.374 | 1.647 | -1.647 | 0.374 |
| 50.74999999999925 | 3.074 | -3.074 | -0.374 | 1.646 | -1.646 | 0.374 |
| 50.79999999999925 | 3.073 | -3.073 | -0.373 | 1.645 | -1.645 | 0.373 |
| 50.84999999999925 | 3.072 | -3.072 | -0.372 | 1.643 | -1.643 | 0.372 |
| 50.89999999999924 | 3.071 | -3.071 | -0.372 | 1.642 | -1.642 | 0.372 |
| 50.94999999999924 | 3.07 | -3.07 | -0.371 | 1.641 | -1.641 | 0.371 |
| 50.99999999999924 | 3.069 | -3.069 | -0.37 | 1.639 | -1.639 | 0.37 |
| 51.04999999999924 | 3.068 | -3.068 | -0.37 | 1.638 | -1.638 | 0.37 |
| 51.09999999999923 | 3.067 | -3.067 | -0.369 | 1.637 | -1.637 | 0.369 |
| 51.14999999999923 | 3.066 | -3.066 | -0.368 | 1.635 | -1.635 | 0.368 |
| 51.19999999999922 | 3.065 | -3.065 | -0.367 | 1.634 | -1.634 | 0.367 |
| 51.24999999999922 | 3.064 | -3.064 | -0.367 | 1.633 | -1.633 | 0.367 |
| 51.29999999999922 | 3.063 | -3.063 | -0.366 | 1.631 | -1.631 | 0.366 |
| 51.34999999999922 | 3.062 | -3.062 | -0.365 | 1.63 | -1.63 | 0.365 |
| 51.39999999999922 | 3.061 | -3.061 | -0.365 | 1.629 | -1.629 | 0.365 |
| 51.44999999999921 | 3.06 | -3.06 | -0.364 | 1.627 | -1.627 | 0.364 |
| 51.49999999999921 | 3.059 | -3.059 | -0.363 | 1.626 | -1.626 | 0.363 |
| 51.54999999999921 | 3.058 | -3.058 | -0.363 | 1.625 | -1.625 | 0.363 |
| 51.5999999999992 | 3.057 | -3.057 | -0.362 | 1.623 | -1.623 | 0.362 |
| 51.6499999999992 | 3.056 | -3.056 | -0.361 | 1.622 | -1.622 | 0.361 |
| 51.6999999999992 | 3.055 | -3.055 | -0.361 | 1.621 | -1.621 | 0.361 |
| 51.7499999999992 | 3.054 | -3.054 | -0.36 | 1.619 | -1.619 | 0.36 |
| 51.7999999999992 | 3.053 | -3.053 | -0.359 | 1.618 | -1.618 | 0.359 |
| 51.8499999999992 | 3.052 | -3.052 | -0.359 | 1.617 | -1.617 | 0.359 |
| 51.89999999999919 | 3.05 | -3.05 | -0.358 | 1.616 | -1.616 | 0.358 |
| 51.94999999999919 | 3.049 | -3.049 | -0.357 | 1.614 | -1.614 | 0.357 |
| 51.99999999999918 | 3.048 | -3.048 | -0.357 | 1.613 | -1.613 | 0.357 |
| 52.04999999999918 | 3.047 | -3.047 | -0.356 | 1.612 | -1.612 | 0.356 |
| 52.09999999999917 | 3.046 | -3.046 | -0.355 | 1.61 | -1.61 | 0.355 |
| 52.14999999999917 | 3.045 | -3.045 | -0.355 | 1.609 | -1.609 | 0.355 |
| 52.19999999999917 | 3.044 | -3.044 | -0.354 | 1.608 | -1.608 | 0.354 |
| 52.24999999999917 | 3.043 | -3.043 | -0.353 | 1.606 | -1.606 | 0.353 |
| 52.29999999999916 | 3.042 | -3.042 | -0.353 | 1.605 | -1.605 | 0.353 |
| 52.34999999999916 | 3.041 | -3.041 | -0.352 | 1.604 | -1.604 | 0.352 |
| 52.39999999999916 | 3.04 | -3.04 | -0.351 | 1.603 | -1.603 | 0.351 |
| 52.44999999999916 | 3.039 | -3.039 | -0.351 | 1.601 | -1.601 | 0.351 |
| 52.49999999999915 | 3.038 | -3.038 | -0.35 | 1.6 | -1.6 | 0.35 |
| 52.54999999999915 | 3.037 | -3.037 | -0.349 | 1.599 | -1.599 | 0.349 |
| 52.59999999999914 | 3.036 | -3.036 | -0.349 | 1.597 | -1.597 | 0.349 |
| 52.64999999999914 | 3.035 | -3.035 | -0.348 | 1.596 | -1.596 | 0.348 |
| 52.69999999999914 | 3.034 | -3.034 | -0.348 | 1.595 | -1.595 | 0.348 |
| 52.74999999999914 | 3.033 | -3.033 | -0.347 | 1.594 | -1.594 | 0.347 |
| 52.79999999999913 | 3.032 | -3.032 | -0.346 | 1.592 | -1.592 | 0.346 |
| 52.84999999999913 | 3.031 | -3.031 | -0.346 | 1.591 | -1.591 | 0.346 |
| 52.89999999999913 | 3.03 | -3.03 | -0.345 | 1.59 | -1.59 | 0.345 |
| 52.94999999999913 | 3.029 | -3.029 | -0.344 | 1.589 | -1.589 | 0.344 |
| 52.99999999999912 | 3.028 | -3.028 | -0.344 | 1.587 | -1.587 | 0.344 |
| 53.04999999999912 | 3.027 | -3.027 | -0.343 | 1.586 | -1.586 | 0.343 |
| 53.09999999999912 | 3.026 | -3.026 | -0.343 | 1.585 | -1.585 | 0.343 |
| 53.14999999999912 | 3.025 | -3.025 | -0.342 | 1.584 | -1.584 | 0.342 |
| 53.19999999999911 | 3.024 | -3.024 | -0.341 | 1.582 | -1.582 | 0.341 |
| 53.24999999999911 | 3.023 | -3.023 | -0.341 | 1.581 | -1.581 | 0.341 |
| 53.2999999999991 | 3.022 | -3.022 | -0.34 | 1.58 | -1.58 | 0.34 |
| 53.34999999999911 | 3.021 | -3.021 | -0.339 | 1.579 | -1.579 | 0.339 |
| 53.3999999999991 | 3.02 | -3.02 | -0.339 | 1.577 | -1.577 | 0.339 |
| 53.4499999999991 | 3.019 | -3.019 | -0.338 | 1.576 | -1.576 | 0.338 |
| 53.4999999999991 | 3.018 | -3.018 | -0.338 | 1.575 | -1.575 | 0.338 |
| 53.5499999999991 | 3.017 | -3.017 | -0.337 | 1.574 | -1.574 | 0.337 |
| 53.5999999999991 | 3.016 | -3.016 | -0.336 | 1.572 | -1.572 | 0.336 |
| 53.64999999999909 | 3.015 | -3.015 | -0.336 | 1.571 | -1.571 | 0.336 |
| 53.69999999999908 | 3.014 | -3.014 | -0.335 | 1.57 | -1.57 | 0.335 |
| 53.74999999999908 | 3.013 | -3.013 | -0.335 | 1.569 | -1.569 | 0.335 |
| 53.79999999999908 | 3.013 | -3.013 | -0.334 | 1.567 | -1.567 | 0.334 |
| 53.84999999999908 | 3.012 | -3.012 | -0.333 | 1.566 | -1.566 | 0.333 |
| 53.89999999999907 | 3.011 | -3.011 | -0.333 | 1.565 | -1.565 | 0.333 |
| 53.94999999999907 | 3.01 | -3.01 | -0.332 | 1.564 | -1.564 | 0.332 |
| 53.99999999999907 | 3.009 | -3.009 | -0.332 | 1.563 | -1.563 | 0.332 |
| 54.04999999999907 | 3.008 | -3.008 | -0.331 | 1.561 | -1.561 | 0.331 |
| 54.09999999999906 | 3.007 | -3.007 | -0.33 | 1.56 | -1.56 | 0.33 |
| 54.14999999999906 | 3.006 | -3.006 | -0.33 | 1.559 | -1.559 | 0.33 |
| 54.19999999999905 | 3.005 | -3.005 | -0.329 | 1.558 | -1.558 | 0.329 |
| 54.24999999999905 | 3.004 | -3.004 | -0.329 | 1.556 | -1.556 | 0.329 |
| 54.29999999999905 | 3.003 | -3.003 | -0.328 | 1.555 | -1.555 | 0.328 |
| 54.34999999999905 | 3.002 | -3.002 | -0.327 | 1.554 | -1.554 | 0.327 |
| 54.39999999999904 | 3.001 | -3.001 | -0.327 | 1.553 | -1.553 | 0.327 |
| 54.44999999999904 | 3 | -3 | -0.326 | 1.552 | -1.552 | 0.326 |
| 54.49999999999904 | 2.999 | -2.999 | -0.326 | 1.55 | -1.55 | 0.326 |
| 54.54999999999904 | 2.998 | -2.998 | -0.325 | 1.549 | -1.549 | 0.325 |
| 54.59999999999903 | 2.997 | -2.997 | -0.325 | 1.548 | -1.548 | 0.325 |
| 54.64999999999903 | 2.996 | -2.996 | -0.324 | 1.547 | -1.547 | 0.324 |
| 54.69999999999902 | 2.995 | -2.995 | -0.323 | 1.546 | -1.546 | 0.323 |
| 54.74999999999902 | 2.994 | -2.994 | -0.323 | 1.544 | -1.544 | 0.323 |
| 54.79999999999902 | 2.993 | -2.993 | -0.322 | 1.543 | -1.543 | 0.322 |
| 54.84999999999902 | 2.992 | -2.992 | -0.322 | 1.542 | -1.542 | 0.322 |
| 54.89999999999902 | 2.991 | -2.991 | -0.321 | 1.541 | -1.541 | 0.321 |
| 54.94999999999902 | 2.99 | -2.99 | -0.321 | 1.54 | -1.54 | 0.321 |
| 54.99999999999901 | 2.989 | -2.989 | -0.32 | 1.538 | -1.538 | 0.32 |
| 55.04999999999901 | 2.988 | -2.988 | -0.319 | 1.537 | -1.537 | 0.319 |
| 55.099999999999 | 2.987 | -2.987 | -0.319 | 1.536 | -1.536 | 0.319 |
| 55.149999999999 | 2.986 | -2.986 | -0.318 | 1.535 | -1.535 | 0.318 |
| 55.199999999999 | 2.986 | -2.986 | -0.318 | 1.534 | -1.534 | 0.318 |
| 55.249999999999 | 2.985 | -2.985 | -0.317 | 1.533 | -1.533 | 0.317 |
| 55.299999999999 | 2.984 | -2.984 | -0.317 | 1.531 | -1.531 | 0.317 |
| 55.349999999999 | 2.983 | -2.983 | -0.316 | 1.53 | -1.53 | 0.316 |
| 55.39999999999899 | 2.982 | -2.982 | -0.316 | 1.529 | -1.529 | 0.316 |
| 55.44999999999899 | 2.981 | -2.981 | -0.315 | 1.528 | -1.528 | 0.315 |
| 55.49999999999898 | 2.98 | -2.98 | -0.314 | 1.527 | -1.527 | 0.314 |
| 55.54999999999898 | 2.979 | -2.979 | -0.314 | 1.526 | -1.526 | 0.314 |
| 55.59999999999897 | 2.978 | -2.978 | -0.313 | 1.524 | -1.524 | 0.313 |
| 55.64999999999897 | 2.977 | -2.977 | -0.313 | 1.523 | -1.523 | 0.313 |
| 55.69999999999897 | 2.976 | -2.976 | -0.312 | 1.522 | -1.522 | 0.312 |
| 55.74999999999897 | 2.975 | -2.975 | -0.312 | 1.521 | -1.521 | 0.312 |
| 55.79999999999896 | 2.974 | -2.974 | -0.311 | 1.52 | -1.52 | 0.311 |
| 55.84999999999896 | 2.973 | -2.973 | -0.311 | 1.519 | -1.519 | 0.311 |
| 55.89999999999896 | 2.972 | -2.972 | -0.31 | 1.517 | -1.517 | 0.31 |
| 55.94999999999896 | 2.971 | -2.971 | -0.31 | 1.516 | -1.516 | 0.31 |
| 55.99999999999895 | 2.971 | -2.971 | -0.309 | 1.515 | -1.515 | 0.309 |
| 56.04999999999895 | 2.97 | -2.97 | -0.308 | 1.514 | -1.514 | 0.308 |
| 56.09999999999894 | 2.969 | -2.969 | -0.308 | 1.513 | -1.513 | 0.308 |
| 56.14999999999894 | 2.968 | -2.968 | -0.307 | 1.512 | -1.512 | 0.307 |
| 56.19999999999894 | 2.967 | -2.967 | -0.307 | 1.511 | -1.511 | 0.307 |
| 56.24999999999894 | 2.966 | -2.966 | -0.306 | 1.509 | -1.509 | 0.306 |
| 56.29999999999893 | 2.965 | -2.965 | -0.306 | 1.508 | -1.508 | 0.306 |
| 56.34999999999894 | 2.964 | -2.964 | -0.305 | 1.507 | -1.507 | 0.305 |
| 56.39999999999893 | 2.963 | -2.963 | -0.305 | 1.506 | -1.506 | 0.305 |
| 56.44999999999893 | 2.962 | -2.962 | -0.304 | 1.505 | -1.505 | 0.304 |
| 56.49999999999892 | 2.961 | -2.961 | -0.304 | 1.504 | -1.504 | 0.304 |
| 56.54999999999892 | 2.96 | -2.96 | -0.303 | 1.503 | -1.503 | 0.303 |
| 56.59999999999892 | 2.959 | -2.959 | -0.303 | 1.502 | -1.502 | 0.303 |
| 56.64999999999892 | 2.958 | -2.958 | -0.302 | 1.5 | -1.5 | 0.302 |
| 56.69999999999891 | 2.958 | -2.958 | -0.302 | 1.499 | -1.499 | 0.302 |
| 56.74999999999891 | 2.957 | -2.957 | -0.301 | 1.498 | -1.498 | 0.301 |
| 56.7999999999989 | 2.956 | -2.956 | -0.301 | 1.497 | -1.497 | 0.301 |
| 56.84999999999891 | 2.955 | -2.955 | -0.3 | 1.496 | -1.496 | 0.3 |
| 56.8999999999989 | 2.954 | -2.954 | -0.3 | 1.495 | -1.495 | 0.3 |
| 56.9499999999989 | 2.953 | -2.953 | -0.299 | 1.494 | -1.494 | 0.299 |
| 56.9999999999989 | 2.952 | -2.952 | -0.299 | 1.493 | -1.493 | 0.299 |
| 57.0499999999989 | 2.951 | -2.951 | -0.298 | 1.491 | -1.491 | 0.298 |
| 57.0999999999989 | 2.95 | -2.95 | -0.298 | 1.49 | -1.49 | 0.298 |
| 57.1499999999989 | 2.949 | -2.949 | -0.297 | 1.489 | -1.489 | 0.297 |
| 57.19999999999888 | 2.948 | -2.948 | -0.297 | 1.488 | -1.488 | 0.297 |
| 57.24999999999888 | 2.948 | -2.948 | -0.296 | 1.487 | -1.487 | 0.296 |
| 57.29999999999888 | 2.947 | -2.947 | -0.296 | 1.486 | -1.486 | 0.296 |
| 57.34999999999888 | 2.946 | -2.946 | -0.295 | 1.485 | -1.485 | 0.295 |
| 57.39999999999887 | 2.945 | -2.945 | -0.295 | 1.484 | -1.484 | 0.295 |
| 57.44999999999887 | 2.944 | -2.944 | -0.294 | 1.483 | -1.483 | 0.294 |
| 57.49999999999887 | 2.943 | -2.943 | -0.294 | 1.481 | -1.481 | 0.294 |
| 57.54999999999887 | 2.942 | -2.942 | -0.293 | 1.48 | -1.48 | 0.293 |
| 57.59999999999886 | 2.941 | -2.941 | -0.293 | 1.479 | -1.479 | 0.293 |
| 57.64999999999886 | 2.94 | -2.94 | -0.292 | 1.478 | -1.478 | 0.292 |
| 57.69999999999885 | 2.939 | -2.939 | -0.292 | 1.477 | -1.477 | 0.292 |
| 57.74999999999885 | 2.938 | -2.938 | -0.291 | 1.476 | -1.476 | 0.291 |
| 57.79999999999885 | 2.938 | -2.938 | -0.291 | 1.475 | -1.475 | 0.291 |
| 57.84999999999885 | 2.937 | -2.937 | -0.29 | 1.474 | -1.474 | 0.29 |
| 57.89999999999884 | 2.936 | -2.936 | -0.29 | 1.473 | -1.473 | 0.29 |
| 57.94999999999884 | 2.935 | -2.935 | -0.289 | 1.472 | -1.472 | 0.289 |
| 57.99999999999884 | 2.934 | -2.934 | -0.289 | 1.471 | -1.471 | 0.289 |
| 58.04999999999884 | 2.933 | -2.933 | -0.288 | 1.47 | -1.47 | 0.288 |
| 58.09999999999883 | 2.932 | -2.932 | -0.288 | 1.468 | -1.468 | 0.288 |
| 58.14999999999883 | 2.931 | -2.931 | -0.287 | 1.467 | -1.467 | 0.287 |
| 58.19999999999883 | 2.93 | -2.93 | -0.287 | 1.466 | -1.466 | 0.287 |
| 58.24999999999882 | 2.93 | -2.93 | -0.286 | 1.465 | -1.465 | 0.286 |
| 58.29999999999882 | 2.929 | -2.929 | -0.286 | 1.464 | -1.464 | 0.286 |
| 58.34999999999882 | 2.928 | -2.928 | -0.285 | 1.463 | -1.463 | 0.285 |
| 58.39999999999882 | 2.927 | -2.927 | -0.285 | 1.462 | -1.462 | 0.285 |
| 58.44999999999882 | 2.926 | -2.926 | -0.284 | 1.461 | -1.461 | 0.284 |
| 58.49999999999881 | 2.925 | -2.925 | -0.284 | 1.46 | -1.46 | 0.284 |
| 58.54999999999881 | 2.924 | -2.924 | -0.283 | 1.459 | -1.459 | 0.283 |
| 58.5999999999988 | 2.923 | -2.923 | -0.283 | 1.458 | -1.458 | 0.283 |
| 58.6499999999988 | 2.922 | -2.922 | -0.283 | 1.457 | -1.457 | 0.283 |
| 58.6999999999988 | 2.922 | -2.922 | -0.282 | 1.456 | -1.456 | 0.282 |
| 58.7499999999988 | 2.921 | -2.921 | -0.282 | 1.455 | -1.455 | 0.282 |
| 58.7999999999988 | 2.92 | -2.92 | -0.281 | 1.453 | -1.453 | 0.281 |
| 58.8499999999988 | 2.919 | -2.919 | -0.281 | 1.452 | -1.452 | 0.281 |
| 58.8999999999988 | 2.918 | -2.918 | -0.28 | 1.451 | -1.451 | 0.28 |
| 58.94999999999879 | 2.917 | -2.917 | -0.28 | 1.45 | -1.45 | 0.28 |
| 58.99999999999878 | 2.916 | -2.916 | -0.279 | 1.449 | -1.449 | 0.279 |
| 59.04999999999878 | 2.915 | -2.915 | -0.279 | 1.448 | -1.448 | 0.279 |
| 59.09999999999877 | 2.915 | -2.915 | -0.278 | 1.447 | -1.447 | 0.278 |
| 59.14999999999877 | 2.914 | -2.914 | -0.278 | 1.446 | -1.446 | 0.278 |
| 59.19999999999877 | 2.913 | -2.913 | -0.277 | 1.445 | -1.445 | 0.277 |
| 59.24999999999877 | 2.912 | -2.912 | -0.277 | 1.444 | -1.444 | 0.277 |
| 59.29999999999876 | 2.911 | -2.911 | -0.277 | 1.443 | -1.443 | 0.277 |
| 59.34999999999877 | 2.91 | -2.91 | -0.276 | 1.442 | -1.442 | 0.276 |
| 59.39999999999876 | 2.909 | -2.909 | -0.276 | 1.441 | -1.441 | 0.276 |
| 59.44999999999876 | 2.908 | -2.908 | -0.275 | 1.44 | -1.44 | 0.275 |
| 59.49999999999875 | 2.908 | -2.908 | -0.275 | 1.439 | -1.439 | 0.275 |
| 59.54999999999875 | 2.907 | -2.907 | -0.274 | 1.438 | -1.438 | 0.274 |
| 59.59999999999875 | 2.906 | -2.906 | -0.274 | 1.437 | -1.437 | 0.274 |
| 59.64999999999874 | 2.905 | -2.905 | -0.273 | 1.436 | -1.436 | 0.273 |
| 59.69999999999874 | 2.904 | -2.904 | -0.273 | 1.435 | -1.435 | 0.273 |
| 59.74999999999874 | 2.903 | -2.903 | -0.272 | 1.434 | -1.434 | 0.272 |
| 59.79999999999873 | 2.902 | -2.902 | -0.272 | 1.433 | -1.433 | 0.272 |
| 59.84999999999874 | 2.902 | -2.902 | -0.272 | 1.432 | -1.432 | 0.272 |
| 59.89999999999873 | 2.901 | -2.901 | -0.271 | 1.431 | -1.431 | 0.271 |
| 59.94999999999873 | 2.9 | -2.9 | -0.271 | 1.43 | -1.43 | 0.271 |
| 59.99999999999872 | 2.899 | -2.899 | -0.27 | 1.429 | -1.429 | 0.27 |
| 60.04999999999872 | 2.898 | -2.898 | -0.27 | 1.428 | -1.428 | 0.27 |
| 60.09999999999872 | 2.897 | -2.897 | -0.269 | 1.427 | -1.427 | 0.269 |
| 60.14999999999872 | 2.896 | -2.896 | -0.269 | 1.426 | -1.426 | 0.269 |
| 60.19999999999871 | 2.896 | -2.896 | -0.269 | 1.425 | -1.425 | 0.269 |
| 60.24999999999871 | 2.895 | -2.895 | -0.268 | 1.423 | -1.423 | 0.268 |
| 60.2999999999987 | 2.894 | -2.894 | -0.268 | 1.422 | -1.422 | 0.268 |
| 60.34999999999871 | 2.893 | -2.893 | -0.267 | 1.421 | -1.421 | 0.267 |
| 60.3999999999987 | 2.892 | -2.892 | -0.267 | 1.42 | -1.42 | 0.267 |
| 60.4499999999987 | 2.891 | -2.891 | -0.266 | 1.419 | -1.419 | 0.266 |
| 60.4999999999987 | 2.89 | -2.89 | -0.266 | 1.418 | -1.418 | 0.266 |
| 60.5499999999987 | 2.89 | -2.89 | -0.266 | 1.417 | -1.417 | 0.266 |
| 60.5999999999987 | 2.889 | -2.889 | -0.265 | 1.416 | -1.416 | 0.265 |
| 60.6499999999987 | 2.888 | -2.888 | -0.265 | 1.415 | -1.415 | 0.265 |
| 60.69999999999869 | 2.887 | -2.887 | -0.264 | 1.414 | -1.414 | 0.264 |
| 60.74999999999869 | 2.886 | -2.886 | -0.264 | 1.413 | -1.413 | 0.264 |
| 60.79999999999868 | 2.885 | -2.885 | -0.263 | 1.412 | -1.412 | 0.263 |
| 60.84999999999868 | 2.885 | -2.885 | -0.263 | 1.411 | -1.411 | 0.263 |
| 60.89999999999868 | 2.884 | -2.884 | -0.263 | 1.41 | -1.41 | 0.263 |
| 60.94999999999867 | 2.883 | -2.883 | -0.262 | 1.409 | -1.409 | 0.262 |
| 60.99999999999867 | 2.882 | -2.882 | -0.262 | 1.408 | -1.408 | 0.262 |
| 61.04999999999867 | 2.881 | -2.881 | -0.261 | 1.407 | -1.407 | 0.261 |
| 61.09999999999867 | 2.88 | -2.88 | -0.261 | 1.406 | -1.406 | 0.261 |
| 61.14999999999866 | 2.879 | -2.879 | -0.26 | 1.405 | -1.405 | 0.26 |
| 61.19999999999866 | 2.879 | -2.879 | -0.26 | 1.404 | -1.404 | 0.26 |
| 61.24999999999866 | 2.878 | -2.878 | -0.26 | 1.404 | -1.404 | 0.26 |
| 61.29999999999865 | 2.877 | -2.877 | -0.259 | 1.403 | -1.403 | 0.259 |
| 61.34999999999865 | 2.876 | -2.876 | -0.259 | 1.402 | -1.402 | 0.259 |
| 61.39999999999865 | 2.875 | -2.875 | -0.258 | 1.401 | -1.401 | 0.258 |
| 61.44999999999865 | 2.874 | -2.874 | -0.258 | 1.4 | -1.4 | 0.258 |
| 61.49999999999864 | 2.874 | -2.874 | -0.258 | 1.399 | -1.399 | 0.258 |
| 61.54999999999864 | 2.873 | -2.873 | -0.257 | 1.398 | -1.398 | 0.257 |
| 61.59999999999864 | 2.872 | -2.872 | -0.257 | 1.397 | -1.397 | 0.257 |
| 61.64999999999863 | 2.871 | -2.871 | -0.256 | 1.396 | -1.396 | 0.256 |
| 61.69999999999863 | 2.87 | -2.87 | -0.256 | 1.395 | -1.395 | 0.256 |
| 61.74999999999863 | 2.869 | -2.869 | -0.256 | 1.394 | -1.394 | 0.256 |
| 61.79999999999862 | 2.869 | -2.869 | -0.255 | 1.393 | -1.393 | 0.255 |
| 61.84999999999862 | 2.868 | -2.868 | -0.255 | 1.392 | -1.392 | 0.255 |
| 61.89999999999862 | 2.867 | -2.867 | -0.254 | 1.391 | -1.391 | 0.254 |
| 61.94999999999862 | 2.866 | -2.866 | -0.254 | 1.39 | -1.39 | 0.254 |
| 61.99999999999861 | 2.865 | -2.865 | -0.254 | 1.389 | -1.389 | 0.254 |
| 62.04999999999861 | 2.865 | -2.865 | -0.253 | 1.388 | -1.388 | 0.253 |
| 62.09999999999861 | 2.864 | -2.864 | -0.253 | 1.387 | -1.387 | 0.253 |
| 62.14999999999861 | 2.863 | -2.863 | -0.252 | 1.386 | -1.386 | 0.252 |
| 62.1999999999986 | 2.862 | -2.862 | -0.252 | 1.385 | -1.385 | 0.252 |
| 62.2499999999986 | 2.861 | -2.861 | -0.252 | 1.384 | -1.384 | 0.252 |
| 62.2999999999986 | 2.86 | -2.86 | -0.251 | 1.383 | -1.383 | 0.251 |
| 62.34999999999859 | 2.86 | -2.86 | -0.251 | 1.382 | -1.382 | 0.251 |
| 62.3999999999986 | 2.859 | -2.859 | -0.25 | 1.381 | -1.381 | 0.25 |
| 62.44999999999859 | 2.858 | -2.858 | -0.25 | 1.38 | -1.38 | 0.25 |
| 62.49999999999859 | 2.857 | -2.857 | -0.25 | 1.379 | -1.379 | 0.25 |
| 62.54999999999858 | 2.856 | -2.856 | -0.249 | 1.378 | -1.378 | 0.249 |
| 62.59999999999858 | 2.856 | -2.856 | -0.249 | 1.377 | -1.377 | 0.249 |
| 62.64999999999858 | 2.855 | -2.855 | -0.248 | 1.376 | -1.376 | 0.248 |
| 62.69999999999857 | 2.854 | -2.854 | -0.248 | 1.376 | -1.376 | 0.248 |
| 62.74999999999857 | 2.853 | -2.853 | -0.248 | 1.375 | -1.375 | 0.248 |
| 62.79999999999857 | 2.852 | -2.852 | -0.247 | 1.374 | -1.374 | 0.247 |
| 62.84999999999857 | 2.851 | -2.851 | -0.247 | 1.373 | -1.373 | 0.247 |
| 62.89999999999856 | 2.851 | -2.851 | -0.247 | 1.372 | -1.372 | 0.247 |
| 62.94999999999856 | 2.85 | -2.85 | -0.246 | 1.371 | -1.371 | 0.246 |
| 62.99999999999856 | 2.849 | -2.849 | -0.246 | 1.37 | -1.37 | 0.246 |
| 63.04999999999855 | 2.848 | -2.848 | -0.245 | 1.369 | -1.369 | 0.245 |
| 63.09999999999855 | 2.847 | -2.847 | -0.245 | 1.368 | -1.368 | 0.245 |
| 63.14999999999855 | 2.847 | -2.847 | -0.245 | 1.367 | -1.367 | 0.245 |
| 63.19999999999854 | 2.846 | -2.846 | -0.244 | 1.366 | -1.366 | 0.244 |
| 63.24999999999854 | 2.845 | -2.845 | -0.244 | 1.365 | -1.365 | 0.244 |
| 63.29999999999854 | 2.844 | -2.844 | -0.243 | 1.364 | -1.364 | 0.243 |
| 63.34999999999854 | 2.843 | -2.843 | -0.243 | 1.363 | -1.363 | 0.243 |
| 63.39999999999853 | 2.843 | -2.843 | -0.243 | 1.362 | -1.362 | 0.243 |
| 63.44999999999853 | 2.842 | -2.842 | -0.242 | 1.361 | -1.361 | 0.242 |
| 63.49999999999853 | 2.841 | -2.841 | -0.242 | 1.361 | -1.361 | 0.242 |
| 63.54999999999853 | 2.84 | -2.84 | -0.242 | 1.36 | -1.36 | 0.242 |
| 63.59999999999852 | 2.839 | -2.839 | -0.241 | 1.359 | -1.359 | 0.241 |
| 63.64999999999852 | 2.839 | -2.839 | -0.241 | 1.358 | -1.358 | 0.241 |
| 63.69999999999852 | 2.838 | -2.838 | -0.241 | 1.357 | -1.357 | 0.241 |
| 63.74999999999851 | 2.837 | -2.837 | -0.24 | 1.356 | -1.356 | 0.24 |
| 63.79999999999851 | 2.836 | -2.836 | -0.24 | 1.355 | -1.355 | 0.24 |
| 63.84999999999851 | 2.835 | -2.835 | -0.239 | 1.354 | -1.354 | 0.239 |
| 63.89999999999851 | 2.835 | -2.835 | -0.239 | 1.353 | -1.353 | 0.239 |
| 63.9499999999985 | 2.834 | -2.834 | -0.239 | 1.352 | -1.352 | 0.239 |
| 63.9999999999985 | 2.833 | -2.833 | -0.238 | 1.351 | -1.351 | 0.238 |
| 64.0499999999985 | 2.832 | -2.832 | -0.238 | 1.35 | -1.35 | 0.238 |
| 64.0999999999985 | 2.831 | -2.831 | -0.238 | 1.35 | -1.35 | 0.238 |
| 64.1499999999985 | 2.831 | -2.831 | -0.237 | 1.349 | -1.349 | 0.237 |
| 64.1999999999985 | 2.83 | -2.83 | -0.237 | 1.348 | -1.348 | 0.237 |
| 64.2499999999985 | 2.829 | -2.829 | -0.237 | 1.347 | -1.347 | 0.237 |
| 64.2999999999985 | 2.828 | -2.828 | -0.236 | 1.346 | -1.346 | 0.236 |
| 64.34999999999847 | 2.827 | -2.827 | -0.236 | 1.345 | -1.345 | 0.236 |
| 64.39999999999849 | 2.827 | -2.827 | -0.235 | 1.344 | -1.344 | 0.235 |
| 64.44999999999848 | 2.826 | -2.826 | -0.235 | 1.343 | -1.343 | 0.235 |
| 64.49999999999847 | 2.825 | -2.825 | -0.235 | 1.342 | -1.342 | 0.235 |
| 64.54999999999848 | 2.824 | -2.824 | -0.234 | 1.341 | -1.341 | 0.234 |
| 64.59999999999847 | 2.824 | -2.824 | -0.234 | 1.34 | -1.34 | 0.234 |
| 64.64999999999847 | 2.823 | -2.823 | -0.234 | 1.34 | -1.34 | 0.234 |
| 64.69999999999845 | 2.822 | -2.822 | -0.233 | 1.339 | -1.339 | 0.233 |
| 64.74999999999847 | 2.821 | -2.821 | -0.233 | 1.338 | -1.338 | 0.233 |
| 64.79999999999846 | 2.82 | -2.82 | -0.233 | 1.337 | -1.337 | 0.233 |
| 64.84999999999845 | 2.82 | -2.82 | -0.232 | 1.336 | -1.336 | 0.232 |
| 64.89999999999846 | 2.819 | -2.819 | -0.232 | 1.335 | -1.335 | 0.232 |
| 64.94999999999845 | 2.818 | -2.818 | -0.232 | 1.334 | -1.334 | 0.232 |
| 64.99999999999845 | 2.817 | -2.817 | -0.231 | 1.333 | -1.333 | 0.231 |
| 65.04999999999843 | 2.817 | -2.817 | -0.231 | 1.332 | -1.332 | 0.231 |
| 65.09999999999845 | 2.816 | -2.816 | -0.231 | 1.332 | -1.332 | 0.231 |
| 65.14999999999844 | 2.815 | -2.815 | -0.23 | 1.331 | -1.331 | 0.23 |
| 65.19999999999843 | 2.814 | -2.814 | -0.23 | 1.33 | -1.33 | 0.23 |
| 65.24999999999844 | 2.813 | -2.813 | -0.229 | 1.329 | -1.329 | 0.229 |
| 65.29999999999843 | 2.813 | -2.813 | -0.229 | 1.328 | -1.328 | 0.229 |
| 65.34999999999843 | 2.812 | -2.812 | -0.229 | 1.327 | -1.327 | 0.229 |
| 65.39999999999841 | 2.811 | -2.811 | -0.228 | 1.326 | -1.326 | 0.228 |
| 65.4499999999984 | 2.81 | -2.81 | -0.228 | 1.325 | -1.325 | 0.228 |
| 65.4999999999984 | 2.81 | -2.81 | -0.228 | 1.325 | -1.325 | 0.228 |
| 65.5499999999984 | 2.809 | -2.809 | -0.227 | 1.324 | -1.324 | 0.227 |
| 65.5999999999984 | 2.808 | -2.808 | -0.227 | 1.323 | -1.323 | 0.227 |
| 65.6499999999984 | 2.807 | -2.807 | -0.227 | 1.322 | -1.322 | 0.227 |
| 65.6999999999984 | 2.806 | -2.806 | -0.226 | 1.321 | -1.321 | 0.226 |
| 65.7499999999984 | 2.806 | -2.806 | -0.226 | 1.32 | -1.32 | 0.226 |
| 65.7999999999984 | 2.805 | -2.805 | -0.226 | 1.319 | -1.319 | 0.226 |
| 65.8499999999984 | 2.804 | -2.804 | -0.225 | 1.318 | -1.318 | 0.225 |
| 65.8999999999984 | 2.803 | -2.803 | -0.225 | 1.318 | -1.318 | 0.225 |
| 65.9499999999984 | 2.803 | -2.803 | -0.225 | 1.317 | -1.317 | 0.225 |
| 65.9999999999984 | 2.802 | -2.802 | -0.224 | 1.316 | -1.316 | 0.224 |
| 66.0499999999984 | 2.801 | -2.801 | -0.224 | 1.315 | -1.315 | 0.224 |
| 66.09999999999837 | 2.8 | -2.8 | -0.224 | 1.314 | -1.314 | 0.224 |
| 66.14999999999839 | 2.8 | -2.8 | -0.223 | 1.313 | -1.313 | 0.223 |
| 66.19999999999838 | 2.799 | -2.799 | -0.223 | 1.312 | -1.312 | 0.223 |
| 66.24999999999837 | 2.798 | -2.798 | -0.223 | 1.311 | -1.311 | 0.223 |
| 66.29999999999836 | 2.797 | -2.797 | -0.222 | 1.311 | -1.311 | 0.222 |
| 66.34999999999837 | 2.797 | -2.797 | -0.222 | 1.31 | -1.31 | 0.222 |
| 66.39999999999837 | 2.796 | -2.796 | -0.222 | 1.309 | -1.309 | 0.222 |
| 66.44999999999835 | 2.795 | -2.795 | -0.221 | 1.308 | -1.308 | 0.221 |
| 66.49999999999837 | 2.794 | -2.794 | -0.221 | 1.307 | -1.307 | 0.221 |
| 66.54999999999836 | 2.794 | -2.794 | -0.221 | 1.306 | -1.306 | 0.221 |
| 66.59999999999836 | 2.793 | -2.793 | -0.22 | 1.305 | -1.305 | 0.22 |
| 66.64999999999834 | 2.792 | -2.792 | -0.22 | 1.305 | -1.305 | 0.22 |
| 66.69999999999835 | 2.791 | -2.791 | -0.22 | 1.304 | -1.304 | 0.22 |
| 66.74999999999835 | 2.79 | -2.79 | -0.22 | 1.303 | -1.303 | 0.22 |
| 66.79999999999833 | 2.79 | -2.79 | -0.219 | 1.302 | -1.302 | 0.219 |
| 66.84999999999835 | 2.789 | -2.789 | -0.219 | 1.301 | -1.301 | 0.219 |
| 66.89999999999834 | 2.788 | -2.788 | -0.219 | 1.3 | -1.3 | 0.219 |
| 66.94999999999834 | 2.787 | -2.787 | -0.218 | 1.3 | -1.3 | 0.218 |
| 66.99999999999832 | 2.787 | -2.787 | -0.218 | 1.299 | -1.299 | 0.218 |
| 67.04999999999833 | 2.786 | -2.786 | -0.218 | 1.298 | -1.298 | 0.218 |
| 67.09999999999833 | 2.785 | -2.785 | -0.217 | 1.297 | -1.297 | 0.217 |
| 67.14999999999831 | 2.784 | -2.784 | -0.217 | 1.296 | -1.296 | 0.217 |
| 67.19999999999833 | 2.784 | -2.784 | -0.217 | 1.295 | -1.295 | 0.217 |
| 67.2499999999983 | 2.783 | -2.783 | -0.216 | 1.294 | -1.294 | 0.216 |
| 67.2999999999983 | 2.782 | -2.782 | -0.216 | 1.294 | -1.294 | 0.216 |
| 67.3499999999983 | 2.781 | -2.781 | -0.216 | 1.293 | -1.293 | 0.216 |
| 67.3999999999983 | 2.781 | -2.781 | -0.215 | 1.292 | -1.292 | 0.215 |
| 67.4499999999983 | 2.78 | -2.78 | -0.215 | 1.291 | -1.291 | 0.215 |
| 67.4999999999983 | 2.779 | -2.779 | -0.215 | 1.29 | -1.29 | 0.215 |
| 67.5499999999983 | 2.779 | -2.779 | -0.214 | 1.289 | -1.289 | 0.214 |
| 67.5999999999983 | 2.778 | -2.778 | -0.214 | 1.289 | -1.289 | 0.214 |
| 67.6499999999983 | 2.777 | -2.777 | -0.214 | 1.288 | -1.288 | 0.214 |
| 67.6999999999983 | 2.776 | -2.776 | -0.214 | 1.287 | -1.287 | 0.214 |
| 67.7499999999983 | 2.776 | -2.776 | -0.213 | 1.286 | -1.286 | 0.213 |
| 67.7999999999983 | 2.775 | -2.775 | -0.213 | 1.285 | -1.285 | 0.213 |
| 67.84999999999827 | 2.774 | -2.774 | -0.213 | 1.285 | -1.285 | 0.213 |
| 67.89999999999829 | 2.773 | -2.773 | -0.212 | 1.284 | -1.284 | 0.212 |
| 67.94999999999828 | 2.773 | -2.773 | -0.212 | 1.283 | -1.283 | 0.212 |
| 67.99999999999828 | 2.772 | -2.772 | -0.212 | 1.282 | -1.282 | 0.212 |
| 68.04999999999826 | 2.771 | -2.771 | -0.211 | 1.281 | -1.281 | 0.211 |
| 68.09999999999827 | 2.77 | -2.77 | -0.211 | 1.28 | -1.28 | 0.211 |
| 68.14999999999827 | 2.77 | -2.77 | -0.211 | 1.28 | -1.28 | 0.211 |
| 68.19999999999825 | 2.769 | -2.769 | -0.21 | 1.279 | -1.279 | 0.21 |
| 68.24999999999827 | 2.768 | -2.768 | -0.21 | 1.278 | -1.278 | 0.21 |
| 68.29999999999826 | 2.767 | -2.767 | -0.21 | 1.277 | -1.277 | 0.21 |
| 68.34999999999826 | 2.767 | -2.767 | -0.21 | 1.276 | -1.276 | 0.21 |
| 68.39999999999824 | 2.766 | -2.766 | -0.209 | 1.276 | -1.276 | 0.209 |
| 68.44999999999825 | 2.765 | -2.765 | -0.209 | 1.275 | -1.275 | 0.209 |
| 68.49999999999825 | 2.765 | -2.765 | -0.209 | 1.274 | -1.274 | 0.209 |
| 68.54999999999824 | 2.764 | -2.764 | -0.208 | 1.273 | -1.273 | 0.208 |
| 68.59999999999825 | 2.763 | -2.763 | -0.208 | 1.272 | -1.272 | 0.208 |
| 68.64999999999824 | 2.762 | -2.762 | -0.208 | 1.271 | -1.271 | 0.208 |
| 68.69999999999824 | 2.762 | -2.762 | -0.207 | 1.271 | -1.271 | 0.207 |
| 68.74999999999822 | 2.761 | -2.761 | -0.207 | 1.27 | -1.27 | 0.207 |
| 68.79999999999824 | 2.76 | -2.76 | -0.207 | 1.269 | -1.269 | 0.207 |
| 68.84999999999823 | 2.759 | -2.759 | -0.207 | 1.268 | -1.268 | 0.207 |
| 68.89999999999822 | 2.759 | -2.759 | -0.206 | 1.267 | -1.267 | 0.206 |
| 68.9499999999982 | 2.758 | -2.758 | -0.206 | 1.267 | -1.267 | 0.206 |
| 68.9999999999982 | 2.757 | -2.757 | -0.206 | 1.266 | -1.266 | 0.206 |
| 69.0499999999982 | 2.757 | -2.757 | -0.205 | 1.265 | -1.265 | 0.205 |
| 69.0999999999982 | 2.756 | -2.756 | -0.205 | 1.264 | -1.264 | 0.205 |
| 69.1499999999982 | 2.755 | -2.755 | -0.205 | 1.263 | -1.263 | 0.205 |
| 69.1999999999982 | 2.754 | -2.754 | -0.205 | 1.263 | -1.263 | 0.205 |
| 69.2499999999982 | 2.754 | -2.754 | -0.204 | 1.262 | -1.262 | 0.204 |
| 69.2999999999982 | 2.753 | -2.753 | -0.204 | 1.261 | -1.261 | 0.204 |
| 69.3499999999982 | 2.752 | -2.752 | -0.204 | 1.26 | -1.26 | 0.204 |
| 69.3999999999982 | 2.751 | -2.751 | -0.203 | 1.259 | -1.259 | 0.203 |
| 69.4499999999982 | 2.751 | -2.751 | -0.203 | 1.259 | -1.259 | 0.203 |
| 69.4999999999982 | 2.75 | -2.75 | -0.203 | 1.258 | -1.258 | 0.203 |
| 69.5499999999982 | 2.749 | -2.749 | -0.203 | 1.257 | -1.257 | 0.203 |
| 69.59999999999818 | 2.749 | -2.749 | -0.202 | 1.256 | -1.256 | 0.202 |
| 69.64999999999819 | 2.748 | -2.748 | -0.202 | 1.255 | -1.255 | 0.202 |
| 69.69999999999818 | 2.747 | -2.747 | -0.202 | 1.255 | -1.255 | 0.202 |
| 69.74999999999818 | 2.746 | -2.746 | -0.201 | 1.254 | -1.254 | 0.201 |
| 69.79999999999816 | 2.746 | -2.746 | -0.201 | 1.253 | -1.253 | 0.201 |
| 69.84999999999818 | 2.745 | -2.745 | -0.201 | 1.252 | -1.252 | 0.201 |
| 69.89999999999817 | 2.744 | -2.744 | -0.201 | 1.252 | -1.252 | 0.201 |
| 69.94999999999816 | 2.744 | -2.744 | -0.2 | 1.251 | -1.251 | 0.2 |
| 69.99999999999817 | 2.743 | -2.743 | -0.2 | 1.25 | -1.25 | 0.2 |
| 70.04999999999816 | 2.742 | -2.742 | -0.2 | 1.249 | -1.249 | 0.2 |
| 70.09999999999816 | 2.741 | -2.741 | -0.199 | 1.248 | -1.248 | 0.199 |
| 70.14999999999814 | 2.741 | -2.741 | -0.199 | 1.248 | -1.248 | 0.199 |
| 70.19999999999816 | 2.74 | -2.74 | -0.199 | 1.247 | -1.247 | 0.199 |
| 70.24999999999815 | 2.739 | -2.739 | -0.199 | 1.246 | -1.246 | 0.199 |
| 70.29999999999814 | 2.739 | -2.739 | -0.198 | 1.245 | -1.245 | 0.198 |
| 70.34999999999815 | 2.738 | -2.738 | -0.198 | 1.245 | -1.245 | 0.198 |
| 70.39999999999814 | 2.737 | -2.737 | -0.198 | 1.244 | -1.244 | 0.198 |
| 70.44999999999814 | 2.737 | -2.737 | -0.198 | 1.243 | -1.243 | 0.198 |
| 70.49999999999812 | 2.736 | -2.736 | -0.197 | 1.242 | -1.242 | 0.197 |
| 70.54999999999814 | 2.735 | -2.735 | -0.197 | 1.241 | -1.241 | 0.197 |
| 70.59999999999813 | 2.734 | -2.734 | -0.197 | 1.241 | -1.241 | 0.197 |
| 70.64999999999812 | 2.734 | -2.734 | -0.196 | 1.24 | -1.24 | 0.196 |
| 70.69999999999813 | 2.733 | -2.733 | -0.196 | 1.239 | -1.239 | 0.196 |
| 70.7499999999981 | 2.732 | -2.732 | -0.196 | 1.238 | -1.238 | 0.196 |
| 70.7999999999981 | 2.732 | -2.732 | -0.196 | 1.238 | -1.238 | 0.196 |
| 70.8499999999981 | 2.731 | -2.731 | -0.195 | 1.237 | -1.237 | 0.195 |
| 70.8999999999981 | 2.73 | -2.73 | -0.195 | 1.236 | -1.236 | 0.195 |
| 70.9499999999981 | 2.73 | -2.73 | -0.195 | 1.235 | -1.235 | 0.195 |
| 70.9999999999981 | 2.729 | -2.729 | -0.195 | 1.235 | -1.235 | 0.195 |
| 71.0499999999981 | 2.728 | -2.728 | -0.194 | 1.234 | -1.234 | 0.194 |
| 71.0999999999981 | 2.727 | -2.727 | -0.194 | 1.233 | -1.233 | 0.194 |
| 71.1499999999981 | 2.727 | -2.727 | -0.194 | 1.232 | -1.232 | 0.194 |
| 71.1999999999981 | 2.726 | -2.726 | -0.193 | 1.232 | -1.232 | 0.193 |
| 71.2499999999981 | 2.725 | -2.725 | -0.193 | 1.231 | -1.231 | 0.193 |
| 71.2999999999981 | 2.725 | -2.725 | -0.193 | 1.23 | -1.23 | 0.193 |
| 71.3499999999981 | 2.724 | -2.724 | -0.193 | 1.229 | -1.229 | 0.193 |
| 71.39999999999807 | 2.723 | -2.723 | -0.192 | 1.229 | -1.229 | 0.192 |
| 71.44999999999808 | 2.723 | -2.723 | -0.192 | 1.228 | -1.228 | 0.192 |
| 71.49999999999808 | 2.722 | -2.722 | -0.192 | 1.227 | -1.227 | 0.192 |
| 71.54999999999806 | 2.721 | -2.721 | -0.192 | 1.226 | -1.226 | 0.192 |
| 71.59999999999808 | 2.72 | -2.72 | -0.191 | 1.225 | -1.225 | 0.191 |
| 71.64999999999807 | 2.72 | -2.72 | -0.191 | 1.225 | -1.225 | 0.191 |
| 71.69999999999807 | 2.719 | -2.719 | -0.191 | 1.224 | -1.224 | 0.191 |
| 71.74999999999805 | 2.718 | -2.718 | -0.191 | 1.223 | -1.223 | 0.191 |
| 71.79999999999806 | 2.718 | -2.718 | -0.19 | 1.222 | -1.222 | 0.19 |
| 71.84999999999806 | 2.717 | -2.717 | -0.19 | 1.222 | -1.222 | 0.19 |
| 71.89999999999804 | 2.716 | -2.716 | -0.19 | 1.221 | -1.221 | 0.19 |
| 71.94999999999806 | 2.716 | -2.716 | -0.19 | 1.22 | -1.22 | 0.19 |
| 71.99999999999805 | 2.715 | -2.715 | -0.189 | 1.22 | -1.22 | 0.189 |
| 72.04999999999805 | 2.714 | -2.714 | -0.189 | 1.219 | -1.219 | 0.189 |
| 72.09999999999803 | 2.714 | -2.714 | -0.189 | 1.218 | -1.218 | 0.189 |
| 72.14999999999804 | 2.713 | -2.713 | -0.188 | 1.217 | -1.217 | 0.188 |
| 72.19999999999804 | 2.712 | -2.712 | -0.188 | 1.217 | -1.217 | 0.188 |
| 72.24999999999802 | 2.712 | -2.712 | -0.188 | 1.216 | -1.216 | 0.188 |
| 72.29999999999804 | 2.711 | -2.711 | -0.188 | 1.215 | -1.215 | 0.188 |
| 72.34999999999803 | 2.71 | -2.71 | -0.187 | 1.214 | -1.214 | 0.187 |
| 72.39999999999803 | 2.709 | -2.709 | -0.187 | 1.214 | -1.214 | 0.187 |
| 72.449999999998 | 2.709 | -2.709 | -0.187 | 1.213 | -1.213 | 0.187 |
| 72.499999999998 | 2.708 | -2.708 | -0.187 | 1.212 | -1.212 | 0.187 |
| 72.549999999998 | 2.707 | -2.707 | -0.186 | 1.211 | -1.211 | 0.186 |
| 72.599999999998 | 2.707 | -2.707 | -0.186 | 1.211 | -1.211 | 0.186 |
| 72.649999999998 | 2.706 | -2.706 | -0.186 | 1.21 | -1.21 | 0.186 |
| 72.699999999998 | 2.705 | -2.705 | -0.186 | 1.209 | -1.209 | 0.186 |
| 72.749999999998 | 2.705 | -2.705 | -0.185 | 1.208 | -1.208 | 0.185 |
| 72.799999999998 | 2.704 | -2.704 | -0.185 | 1.208 | -1.208 | 0.185 |
| 72.849999999998 | 2.703 | -2.703 | -0.185 | 1.207 | -1.207 | 0.185 |
| 72.899999999998 | 2.703 | -2.703 | -0.185 | 1.206 | -1.206 | 0.185 |
| 72.949999999998 | 2.702 | -2.702 | -0.184 | 1.206 | -1.206 | 0.184 |
| 72.999999999998 | 2.701 | -2.701 | -0.184 | 1.205 | -1.205 | 0.184 |
| 73.049999999998 | 2.701 | -2.701 | -0.184 | 1.204 | -1.204 | 0.184 |
| 73.099999999998 | 2.7 | -2.7 | -0.184 | 1.203 | -1.203 | 0.184 |
| 73.14999999999797 | 2.699 | -2.699 | -0.183 | 1.203 | -1.203 | 0.183 |
| 73.19999999999798 | 2.699 | -2.699 | -0.183 | 1.202 | -1.202 | 0.183 |
| 73.24999999999798 | 2.698 | -2.698 | -0.183 | 1.201 | -1.201 | 0.183 |
| 73.29999999999797 | 2.697 | -2.697 | -0.183 | 1.2 | -1.2 | 0.183 |
| 73.34999999999798 | 2.697 | -2.697 | -0.182 | 1.2 | -1.2 | 0.182 |
| 73.39999999999797 | 2.696 | -2.696 | -0.182 | 1.199 | -1.199 | 0.182 |
| 73.44999999999797 | 2.695 | -2.695 | -0.182 | 1.198 | -1.198 | 0.182 |
| 73.49999999999795 | 2.695 | -2.695 | -0.182 | 1.198 | -1.198 | 0.182 |
| 73.54999999999797 | 2.694 | -2.694 | -0.182 | 1.197 | -1.197 | 0.182 |
| 73.59999999999796 | 2.693 | -2.693 | -0.181 | 1.196 | -1.196 | 0.181 |
| 73.64999999999795 | 2.693 | -2.693 | -0.181 | 1.195 | -1.195 | 0.181 |
| 73.69999999999796 | 2.692 | -2.692 | -0.181 | 1.195 | -1.195 | 0.181 |
| 73.74999999999795 | 2.691 | -2.691 | -0.181 | 1.194 | -1.194 | 0.181 |
| 73.79999999999795 | 2.691 | -2.691 | -0.18 | 1.193 | -1.193 | 0.18 |
| 73.84999999999793 | 2.69 | -2.69 | -0.18 | 1.193 | -1.193 | 0.18 |
| 73.89999999999795 | 2.689 | -2.689 | -0.18 | 1.192 | -1.192 | 0.18 |
| 73.94999999999794 | 2.689 | -2.689 | -0.18 | 1.191 | -1.191 | 0.18 |
| 73.99999999999793 | 2.688 | -2.688 | -0.179 | 1.19 | -1.19 | 0.179 |
| 74.04999999999794 | 2.687 | -2.687 | -0.179 | 1.19 | -1.19 | 0.179 |
| 74.09999999999793 | 2.687 | -2.687 | -0.179 | 1.189 | -1.189 | 0.179 |
| 74.14999999999793 | 2.686 | -2.686 | -0.179 | 1.188 | -1.188 | 0.179 |
| 74.19999999999791 | 2.685 | -2.685 | -0.178 | 1.188 | -1.188 | 0.178 |
| 74.2499999999979 | 2.685 | -2.685 | -0.178 | 1.187 | -1.187 | 0.178 |
| 74.2999999999979 | 2.684 | -2.684 | -0.178 | 1.186 | -1.186 | 0.178 |
| 74.3499999999979 | 2.683 | -2.683 | -0.178 | 1.186 | -1.186 | 0.178 |
| 74.3999999999979 | 2.683 | -2.683 | -0.177 | 1.185 | -1.185 | 0.177 |
| 74.4499999999979 | 2.682 | -2.682 | -0.177 | 1.184 | -1.184 | 0.177 |
| 74.4999999999979 | 2.681 | -2.681 | -0.177 | 1.183 | -1.183 | 0.177 |
| 74.5499999999979 | 2.681 | -2.681 | -0.177 | 1.183 | -1.183 | 0.177 |
| 74.5999999999979 | 2.68 | -2.68 | -0.177 | 1.182 | -1.182 | 0.177 |
| 74.6499999999979 | 2.679 | -2.679 | -0.176 | 1.181 | -1.181 | 0.176 |
| 74.6999999999979 | 2.679 | -2.679 | -0.176 | 1.181 | -1.181 | 0.176 |
| 74.7499999999979 | 2.678 | -2.678 | -0.176 | 1.18 | -1.18 | 0.176 |
| 74.7999999999979 | 2.677 | -2.677 | -0.176 | 1.179 | -1.179 | 0.176 |
| 74.8499999999979 | 2.677 | -2.677 | -0.175 | 1.179 | -1.179 | 0.175 |
| 74.89999999999787 | 2.676 | -2.676 | -0.175 | 1.178 | -1.178 | 0.175 |
| 74.94999999999789 | 2.675 | -2.675 | -0.175 | 1.177 | -1.177 | 0.175 |
| 74.99999999999788 | 2.675 | -2.675 | -0.175 | 1.176 | -1.176 | 0.175 |
| 75.04999999999787 | 2.674 | -2.674 | -0.174 | 1.176 | -1.176 | 0.174 |
| 75.09999999999788 | 2.673 | -2.673 | -0.174 | 1.175 | -1.175 | 0.174 |
| 75.14999999999787 | 2.673 | -2.673 | -0.174 | 1.174 | -1.174 | 0.174 |
| 75.19999999999787 | 2.672 | -2.672 | -0.174 | 1.174 | -1.174 | 0.174 |
| 75.24999999999785 | 2.672 | -2.672 | -0.174 | 1.173 | -1.173 | 0.174 |
| 75.29999999999787 | 2.671 | -2.671 | -0.173 | 1.172 | -1.172 | 0.173 |
| 75.34999999999786 | 2.67 | -2.67 | -0.173 | 1.172 | -1.172 | 0.173 |
| 75.39999999999785 | 2.67 | -2.67 | -0.173 | 1.171 | -1.171 | 0.173 |
| 75.44999999999786 | 2.669 | -2.669 | -0.173 | 1.17 | -1.17 | 0.173 |
| 75.49999999999785 | 2.668 | -2.668 | -0.172 | 1.17 | -1.17 | 0.172 |
| 75.54999999999785 | 2.668 | -2.668 | -0.172 | 1.169 | -1.169 | 0.172 |
| 75.59999999999783 | 2.667 | -2.667 | -0.172 | 1.168 | -1.168 | 0.172 |
| 75.64999999999785 | 2.666 | -2.666 | -0.172 | 1.168 | -1.168 | 0.172 |
| 75.69999999999784 | 2.666 | -2.666 | -0.172 | 1.167 | -1.167 | 0.172 |
| 75.74999999999783 | 2.665 | -2.665 | -0.171 | 1.166 | -1.166 | 0.171 |
| 75.79999999999782 | 2.664 | -2.664 | -0.171 | 1.166 | -1.166 | 0.171 |
| 75.84999999999783 | 2.664 | -2.664 | -0.171 | 1.165 | -1.165 | 0.171 |
| 75.89999999999783 | 2.663 | -2.663 | -0.171 | 1.164 | -1.164 | 0.171 |
| 75.9499999999978 | 2.662 | -2.662 | -0.17 | 1.163 | -1.163 | 0.17 |
| 75.9999999999978 | 2.662 | -2.662 | -0.17 | 1.163 | -1.163 | 0.17 |
| 76.0499999999978 | 2.661 | -2.661 | -0.17 | 1.162 | -1.162 | 0.17 |
| 76.0999999999978 | 2.661 | -2.661 | -0.17 | 1.161 | -1.161 | 0.17 |
| 76.1499999999978 | 2.66 | -2.66 | -0.17 | 1.161 | -1.161 | 0.17 |
| 76.1999999999978 | 2.659 | -2.659 | -0.169 | 1.16 | -1.16 | 0.169 |
| 76.2499999999978 | 2.659 | -2.659 | -0.169 | 1.159 | -1.159 | 0.169 |
| 76.2999999999978 | 2.658 | -2.658 | -0.169 | 1.159 | -1.159 | 0.169 |
| 76.3499999999978 | 2.657 | -2.657 | -0.169 | 1.158 | -1.158 | 0.169 |
| 76.3999999999978 | 2.657 | -2.657 | -0.168 | 1.157 | -1.157 | 0.168 |
| 76.4499999999978 | 2.656 | -2.656 | -0.168 | 1.157 | -1.157 | 0.168 |
| 76.4999999999978 | 2.655 | -2.655 | -0.168 | 1.156 | -1.156 | 0.168 |
| 76.5499999999978 | 2.655 | -2.655 | -0.168 | 1.155 | -1.155 | 0.168 |
| 76.5999999999978 | 2.654 | -2.654 | -0.168 | 1.155 | -1.155 | 0.168 |
| 76.64999999999777 | 2.654 | -2.654 | -0.167 | 1.154 | -1.154 | 0.167 |
| 76.69999999999779 | 2.653 | -2.653 | -0.167 | 1.153 | -1.153 | 0.167 |
| 76.74999999999778 | 2.652 | -2.652 | -0.167 | 1.153 | -1.153 | 0.167 |
| 76.79999999999778 | 2.652 | -2.652 | -0.167 | 1.152 | -1.152 | 0.167 |
| 76.84999999999776 | 2.651 | -2.651 | -0.167 | 1.151 | -1.151 | 0.167 |
| 76.89999999999777 | 2.65 | -2.65 | -0.166 | 1.151 | -1.151 | 0.166 |
| 76.94999999999777 | 2.65 | -2.65 | -0.166 | 1.15 | -1.15 | 0.166 |
| 76.99999999999775 | 2.649 | -2.649 | -0.166 | 1.149 | -1.149 | 0.166 |
| 77.04999999999777 | 2.648 | -2.648 | -0.166 | 1.149 | -1.149 | 0.166 |
| 77.09999999999776 | 2.648 | -2.648 | -0.165 | 1.148 | -1.148 | 0.165 |
| 77.14999999999776 | 2.647 | -2.647 | -0.165 | 1.147 | -1.147 | 0.165 |
| 77.19999999999774 | 2.647 | -2.647 | -0.165 | 1.147 | -1.147 | 0.165 |
| 77.24999999999775 | 2.646 | -2.646 | -0.165 | 1.146 | -1.146 | 0.165 |
| 77.29999999999775 | 2.645 | -2.645 | -0.165 | 1.145 | -1.145 | 0.165 |
| 77.34999999999773 | 2.645 | -2.645 | -0.164 | 1.145 | -1.145 | 0.164 |
| 77.39999999999775 | 2.644 | -2.644 | -0.164 | 1.144 | -1.144 | 0.164 |
| 77.44999999999774 | 2.643 | -2.643 | -0.164 | 1.144 | -1.144 | 0.164 |
| 77.49999999999774 | 2.643 | -2.643 | -0.164 | 1.143 | -1.143 | 0.164 |
| 77.54999999999772 | 2.642 | -2.642 | -0.164 | 1.142 | -1.142 | 0.164 |
| 77.59999999999773 | 2.642 | -2.642 | -0.163 | 1.142 | -1.142 | 0.163 |
| 77.64999999999773 | 2.641 | -2.641 | -0.163 | 1.141 | -1.141 | 0.163 |
| 77.69999999999771 | 2.64 | -2.64 | -0.163 | 1.14 | -1.14 | 0.163 |
| 77.7499999999977 | 2.64 | -2.64 | -0.163 | 1.14 | -1.14 | 0.163 |
| 77.7999999999977 | 2.639 | -2.639 | -0.163 | 1.139 | -1.139 | 0.163 |
| 77.8499999999977 | 2.638 | -2.638 | -0.162 | 1.138 | -1.138 | 0.162 |
| 77.8999999999977 | 2.638 | -2.638 | -0.162 | 1.138 | -1.138 | 0.162 |
| 77.9499999999977 | 2.637 | -2.637 | -0.162 | 1.137 | -1.137 | 0.162 |
| 77.9999999999977 | 2.637 | -2.637 | -0.162 | 1.136 | -1.136 | 0.162 |
| 78.0499999999977 | 2.636 | -2.636 | -0.162 | 1.136 | -1.136 | 0.162 |
| 78.0999999999977 | 2.635 | -2.635 | -0.161 | 1.135 | -1.135 | 0.161 |
| 78.1499999999977 | 2.635 | -2.635 | -0.161 | 1.134 | -1.134 | 0.161 |
| 78.1999999999977 | 2.634 | -2.634 | -0.161 | 1.134 | -1.134 | 0.161 |
| 78.2499999999977 | 2.633 | -2.633 | -0.161 | 1.133 | -1.133 | 0.161 |
| 78.2999999999977 | 2.633 | -2.633 | -0.16 | 1.133 | -1.133 | 0.16 |
| 78.3499999999977 | 2.632 | -2.632 | -0.16 | 1.132 | -1.132 | 0.16 |
| 78.39999999999768 | 2.632 | -2.632 | -0.16 | 1.131 | -1.131 | 0.16 |
| 78.44999999999769 | 2.631 | -2.631 | -0.16 | 1.131 | -1.131 | 0.16 |
| 78.49999999999768 | 2.63 | -2.63 | -0.16 | 1.13 | -1.13 | 0.16 |
| 78.54999999999768 | 2.63 | -2.63 | -0.159 | 1.129 | -1.129 | 0.159 |
| 78.59999999999766 | 2.629 | -2.629 | -0.159 | 1.129 | -1.129 | 0.159 |
| 78.64999999999768 | 2.628 | -2.628 | -0.159 | 1.128 | -1.128 | 0.159 |
| 78.69999999999767 | 2.628 | -2.628 | -0.159 | 1.127 | -1.127 | 0.159 |
| 78.74999999999766 | 2.627 | -2.627 | -0.159 | 1.127 | -1.127 | 0.159 |
| 78.79999999999767 | 2.627 | -2.627 | -0.158 | 1.126 | -1.126 | 0.158 |
| 78.84999999999766 | 2.626 | -2.626 | -0.158 | 1.125 | -1.125 | 0.158 |
| 78.89999999999766 | 2.625 | -2.625 | -0.158 | 1.125 | -1.125 | 0.158 |
| 78.94999999999764 | 2.625 | -2.625 | -0.158 | 1.124 | -1.124 | 0.158 |
| 78.99999999999766 | 2.624 | -2.624 | -0.158 | 1.124 | -1.124 | 0.158 |
| 79.04999999999765 | 2.624 | -2.624 | -0.158 | 1.123 | -1.123 | 0.158 |
| 79.09999999999764 | 2.623 | -2.623 | -0.157 | 1.122 | -1.122 | 0.157 |
| 79.14999999999765 | 2.622 | -2.622 | -0.157 | 1.122 | -1.122 | 0.157 |
| 79.19999999999764 | 2.622 | -2.622 | -0.157 | 1.121 | -1.121 | 0.157 |
| 79.24999999999764 | 2.621 | -2.621 | -0.157 | 1.12 | -1.12 | 0.157 |
| 79.29999999999762 | 2.621 | -2.621 | -0.157 | 1.12 | -1.12 | 0.157 |
| 79.34999999999764 | 2.62 | -2.62 | -0.156 | 1.119 | -1.119 | 0.156 |
| 79.39999999999763 | 2.619 | -2.619 | -0.156 | 1.119 | -1.119 | 0.156 |
| 79.4499999999976 | 2.619 | -2.619 | -0.156 | 1.118 | -1.118 | 0.156 |
| 79.4999999999976 | 2.618 | -2.618 | -0.156 | 1.117 | -1.117 | 0.156 |
| 79.5499999999976 | 2.617 | -2.617 | -0.156 | 1.117 | -1.117 | 0.156 |
| 79.5999999999976 | 2.617 | -2.617 | -0.155 | 1.116 | -1.116 | 0.155 |
| 79.6499999999976 | 2.616 | -2.616 | -0.155 | 1.115 | -1.115 | 0.155 |
| 79.6999999999976 | 2.616 | -2.616 | -0.155 | 1.115 | -1.115 | 0.155 |
| 79.7499999999976 | 2.615 | -2.615 | -0.155 | 1.114 | -1.114 | 0.155 |
| 79.7999999999976 | 2.614 | -2.614 | -0.155 | 1.114 | -1.114 | 0.155 |
| 79.8499999999976 | 2.614 | -2.614 | -0.154 | 1.113 | -1.113 | 0.154 |
| 79.8999999999976 | 2.613 | -2.613 | -0.154 | 1.112 | -1.112 | 0.154 |
| 79.9499999999976 | 2.613 | -2.613 | -0.154 | 1.112 | -1.112 | 0.154 |
| 79.9999999999976 | 2.612 | -2.612 | -0.154 | 1.111 | -1.111 | 0.154 |
| 80.0499999999976 | 2.611 | -2.611 | -0.154 | 1.11 | -1.11 | 0.154 |
| 80.0999999999976 | 2.611 | -2.611 | -0.153 | 1.11 | -1.11 | 0.153 |
| 80.14999999999758 | 2.61 | -2.61 | -0.153 | 1.109 | -1.109 | 0.153 |
| 80.19999999999759 | 2.61 | -2.61 | -0.153 | 1.109 | -1.109 | 0.153 |
| 80.24999999999758 | 2.609 | -2.609 | -0.153 | 1.108 | -1.108 | 0.153 |
| 80.29999999999758 | 2.608 | -2.608 | -0.153 | 1.107 | -1.107 | 0.153 |
| 80.34999999999756 | 2.608 | -2.608 | -0.153 | 1.107 | -1.107 | 0.153 |
| 80.39999999999758 | 2.607 | -2.607 | -0.152 | 1.106 | -1.106 | 0.152 |
| 80.44999999999757 | 2.607 | -2.607 | -0.152 | 1.106 | -1.106 | 0.152 |
| 80.49999999999756 | 2.606 | -2.606 | -0.152 | 1.105 | -1.105 | 0.152 |
| 80.54999999999757 | 2.605 | -2.605 | -0.152 | 1.104 | -1.104 | 0.152 |
| 80.59999999999756 | 2.605 | -2.605 | -0.152 | 1.104 | -1.104 | 0.152 |
| 80.64999999999756 | 2.604 | -2.604 | -0.151 | 1.103 | -1.103 | 0.151 |
| 80.69999999999754 | 2.604 | -2.604 | -0.151 | 1.103 | -1.103 | 0.151 |
| 80.74999999999756 | 2.603 | -2.603 | -0.151 | 1.102 | -1.102 | 0.151 |
| 80.79999999999755 | 2.602 | -2.602 | -0.151 | 1.101 | -1.101 | 0.151 |
| 80.84999999999754 | 2.602 | -2.602 | -0.151 | 1.101 | -1.101 | 0.151 |
| 80.89999999999753 | 2.601 | -2.601 | -0.15 | 1.1 | -1.1 | 0.15 |
| 80.94999999999754 | 2.601 | -2.601 | -0.15 | 1.1 | -1.1 | 0.15 |
| 80.99999999999754 | 2.6 | -2.6 | -0.15 | 1.099 | -1.099 | 0.15 |
| 81.04999999999752 | 2.599 | -2.599 | -0.15 | 1.098 | -1.098 | 0.15 |
| 81.09999999999754 | 2.599 | -2.599 | -0.15 | 1.098 | -1.098 | 0.15 |
| 81.14999999999753 | 2.598 | -2.598 | -0.15 | 1.097 | -1.097 | 0.15 |
| 81.19999999999753 | 2.598 | -2.598 | -0.149 | 1.096 | -1.096 | 0.149 |
| 81.2499999999975 | 2.597 | -2.597 | -0.149 | 1.096 | -1.096 | 0.149 |
| 81.2999999999975 | 2.597 | -2.597 | -0.149 | 1.095 | -1.095 | 0.149 |
| 81.3499999999975 | 2.596 | -2.596 | -0.149 | 1.095 | -1.095 | 0.149 |
| 81.3999999999975 | 2.595 | -2.595 | -0.149 | 1.094 | -1.094 | 0.149 |
| 81.4499999999975 | 2.595 | -2.595 | -0.148 | 1.093 | -1.093 | 0.148 |
| 81.4999999999975 | 2.594 | -2.594 | -0.148 | 1.093 | -1.093 | 0.148 |
| 81.5499999999975 | 2.594 | -2.594 | -0.148 | 1.092 | -1.092 | 0.148 |
| 81.5999999999975 | 2.593 | -2.593 | -0.148 | 1.092 | -1.092 | 0.148 |
| 81.6499999999975 | 2.592 | -2.592 | -0.148 | 1.091 | -1.091 | 0.148 |
| 81.6999999999975 | 2.592 | -2.592 | -0.148 | 1.091 | -1.091 | 0.148 |
| 81.7499999999975 | 2.591 | -2.591 | -0.147 | 1.09 | -1.09 | 0.147 |
| 81.7999999999975 | 2.591 | -2.591 | -0.147 | 1.089 | -1.089 | 0.147 |
| 81.8499999999975 | 2.59 | -2.59 | -0.147 | 1.089 | -1.089 | 0.147 |
| 81.8999999999975 | 2.589 | -2.589 | -0.147 | 1.088 | -1.088 | 0.147 |
| 81.94999999999747 | 2.589 | -2.589 | -0.147 | 1.088 | -1.088 | 0.147 |
| 81.99999999999748 | 2.588 | -2.588 | -0.147 | 1.087 | -1.087 | 0.147 |
| 82.04999999999748 | 2.588 | -2.588 | -0.146 | 1.086 | -1.086 | 0.146 |
| 82.09999999999746 | 2.587 | -2.587 | -0.146 | 1.086 | -1.086 | 0.146 |
| 82.14999999999748 | 2.587 | -2.587 | -0.146 | 1.085 | -1.085 | 0.146 |
| 82.19999999999747 | 2.586 | -2.586 | -0.146 | 1.085 | -1.085 | 0.146 |
| 82.24999999999747 | 2.585 | -2.585 | -0.146 | 1.084 | -1.084 | 0.146 |
| 82.29999999999745 | 2.585 | -2.585 | -0.145 | 1.083 | -1.083 | 0.145 |
| 82.34999999999746 | 2.584 | -2.584 | -0.145 | 1.083 | -1.083 | 0.145 |
| 82.39999999999746 | 2.584 | -2.584 | -0.145 | 1.082 | -1.082 | 0.145 |
| 82.44999999999744 | 2.583 | -2.583 | -0.145 | 1.082 | -1.082 | 0.145 |
| 82.49999999999746 | 2.582 | -2.582 | -0.145 | 1.081 | -1.081 | 0.145 |
| 82.54999999999745 | 2.582 | -2.582 | -0.145 | 1.08 | -1.08 | 0.145 |
| 82.59999999999745 | 2.581 | -2.581 | -0.144 | 1.08 | -1.08 | 0.144 |
| 82.64999999999743 | 2.581 | -2.581 | -0.144 | 1.079 | -1.079 | 0.144 |
| 82.69999999999744 | 2.58 | -2.58 | -0.144 | 1.079 | -1.079 | 0.144 |
| 82.74999999999744 | 2.58 | -2.58 | -0.144 | 1.078 | -1.078 | 0.144 |
| 82.79999999999742 | 2.579 | -2.579 | -0.144 | 1.078 | -1.078 | 0.144 |
| 82.84999999999744 | 2.578 | -2.578 | -0.144 | 1.077 | -1.077 | 0.144 |
| 82.89999999999743 | 2.578 | -2.578 | -0.143 | 1.076 | -1.076 | 0.143 |
| 82.9499999999974 | 2.577 | -2.577 | -0.143 | 1.076 | -1.076 | 0.143 |
| 82.9999999999974 | 2.577 | -2.577 | -0.143 | 1.075 | -1.075 | 0.143 |
| 83.0499999999974 | 2.576 | -2.576 | -0.143 | 1.075 | -1.075 | 0.143 |
| 83.0999999999974 | 2.576 | -2.576 | -0.143 | 1.074 | -1.074 | 0.143 |
| 83.1499999999974 | 2.575 | -2.575 | -0.143 | 1.074 | -1.074 | 0.143 |
| 83.1999999999974 | 2.574 | -2.574 | -0.142 | 1.073 | -1.073 | 0.142 |
| 83.2499999999974 | 2.574 | -2.574 | -0.142 | 1.072 | -1.072 | 0.142 |
| 83.2999999999974 | 2.573 | -2.573 | -0.142 | 1.072 | -1.072 | 0.142 |
| 83.3499999999974 | 2.573 | -2.573 | -0.142 | 1.071 | -1.071 | 0.142 |
| 83.3999999999974 | 2.572 | -2.572 | -0.142 | 1.071 | -1.071 | 0.142 |
| 83.4499999999974 | 2.572 | -2.572 | -0.142 | 1.07 | -1.07 | 0.142 |
| 83.4999999999974 | 2.571 | -2.571 | -0.141 | 1.07 | -1.07 | 0.141 |
| 83.5499999999974 | 2.57 | -2.57 | -0.141 | 1.069 | -1.069 | 0.141 |
| 83.5999999999974 | 2.57 | -2.57 | -0.141 | 1.068 | -1.068 | 0.141 |
| 83.6499999999974 | 2.569 | -2.569 | -0.141 | 1.068 | -1.068 | 0.141 |
| 83.69999999999737 | 2.569 | -2.569 | -0.141 | 1.067 | -1.067 | 0.141 |
| 83.74999999999739 | 2.568 | -2.568 | -0.141 | 1.067 | -1.067 | 0.141 |
| 83.79999999999738 | 2.568 | -2.568 | -0.14 | 1.066 | -1.066 | 0.14 |
| 83.84999999999737 | 2.567 | -2.567 | -0.14 | 1.066 | -1.066 | 0.14 |
| 83.89999999999738 | 2.566 | -2.566 | -0.14 | 1.065 | -1.065 | 0.14 |
| 83.94999999999737 | 2.566 | -2.566 | -0.14 | 1.064 | -1.064 | 0.14 |
| 83.99999999999737 | 2.565 | -2.565 | -0.14 | 1.064 | -1.064 | 0.14 |
| 84.04999999999735 | 2.565 | -2.565 | -0.14 | 1.063 | -1.063 | 0.14 |
| 84.09999999999737 | 2.564 | -2.564 | -0.139 | 1.063 | -1.063 | 0.139 |
| 84.14999999999736 | 2.564 | -2.564 | -0.139 | 1.062 | -1.062 | 0.139 |
| 84.19999999999735 | 2.563 | -2.563 | -0.139 | 1.062 | -1.062 | 0.139 |
| 84.24999999999736 | 2.562 | -2.562 | -0.139 | 1.061 | -1.061 | 0.139 |
| 84.29999999999735 | 2.562 | -2.562 | -0.139 | 1.06 | -1.06 | 0.139 |
| 84.34999999999735 | 2.561 | -2.561 | -0.139 | 1.06 | -1.06 | 0.139 |
| 84.39999999999733 | 2.561 | -2.561 | -0.138 | 1.059 | -1.059 | 0.138 |
| 84.44999999999735 | 2.56 | -2.56 | -0.138 | 1.059 | -1.059 | 0.138 |
| 84.49999999999734 | 2.56 | -2.56 | -0.138 | 1.058 | -1.058 | 0.138 |
| 84.54999999999733 | 2.559 | -2.559 | -0.138 | 1.058 | -1.058 | 0.138 |
| 84.59999999999734 | 2.558 | -2.558 | -0.138 | 1.057 | -1.057 | 0.138 |
| 84.64999999999733 | 2.558 | -2.558 | -0.138 | 1.057 | -1.057 | 0.138 |
| 84.69999999999733 | 2.557 | -2.557 | -0.137 | 1.056 | -1.056 | 0.137 |
| 84.7499999999973 | 2.557 | -2.557 | -0.137 | 1.055 | -1.055 | 0.137 |
| 84.7999999999973 | 2.556 | -2.556 | -0.137 | 1.055 | -1.055 | 0.137 |
| 84.8499999999973 | 2.556 | -2.556 | -0.137 | 1.054 | -1.054 | 0.137 |
| 84.8999999999973 | 2.555 | -2.555 | -0.137 | 1.054 | -1.054 | 0.137 |
| 84.9499999999973 | 2.555 | -2.555 | -0.137 | 1.053 | -1.053 | 0.137 |
| 84.9999999999973 | 2.554 | -2.554 | -0.137 | 1.053 | -1.053 | 0.137 |
| 85.0499999999973 | 2.553 | -2.553 | -0.136 | 1.052 | -1.052 | 0.136 |
| 85.0999999999973 | 2.553 | -2.553 | -0.136 | 1.052 | -1.052 | 0.136 |
| 85.1499999999973 | 2.552 | -2.552 | -0.136 | 1.051 | -1.051 | 0.136 |
| 85.1999999999973 | 2.552 | -2.552 | -0.136 | 1.05 | -1.05 | 0.136 |
| 85.2499999999973 | 2.551 | -2.551 | -0.136 | 1.05 | -1.05 | 0.136 |
| 85.2999999999973 | 2.551 | -2.551 | -0.136 | 1.049 | -1.049 | 0.136 |
| 85.3499999999973 | 2.55 | -2.55 | -0.135 | 1.049 | -1.049 | 0.135 |
| 85.3999999999973 | 2.55 | -2.55 | -0.135 | 1.048 | -1.048 | 0.135 |
| 85.44999999999727 | 2.549 | -2.549 | -0.135 | 1.048 | -1.048 | 0.135 |
| 85.49999999999729 | 2.548 | -2.548 | -0.135 | 1.047 | -1.047 | 0.135 |
| 85.54999999999728 | 2.548 | -2.548 | -0.135 | 1.047 | -1.047 | 0.135 |
| 85.59999999999728 | 2.547 | -2.547 | -0.135 | 1.046 | -1.046 | 0.135 |
| 85.64999999999726 | 2.547 | -2.547 | -0.134 | 1.045 | -1.045 | 0.134 |
| 85.69999999999727 | 2.546 | -2.546 | -0.134 | 1.045 | -1.045 | 0.134 |
| 85.74999999999727 | 2.546 | -2.546 | -0.134 | 1.044 | -1.044 | 0.134 |
| 85.79999999999725 | 2.545 | -2.545 | -0.134 | 1.044 | -1.044 | 0.134 |
| 85.84999999999727 | 2.545 | -2.545 | -0.134 | 1.043 | -1.043 | 0.134 |
| 85.89999999999726 | 2.544 | -2.544 | -0.134 | 1.043 | -1.043 | 0.134 |
| 85.94999999999726 | 2.543 | -2.543 | -0.134 | 1.042 | -1.042 | 0.134 |
| 85.99999999999724 | 2.543 | -2.543 | -0.133 | 1.042 | -1.042 | 0.133 |
| 86.04999999999725 | 2.542 | -2.542 | -0.133 | 1.041 | -1.041 | 0.133 |
| 86.09999999999725 | 2.542 | -2.542 | -0.133 | 1.041 | -1.041 | 0.133 |
| 86.14999999999723 | 2.541 | -2.541 | -0.133 | 1.04 | -1.04 | 0.133 |
| 86.19999999999725 | 2.541 | -2.541 | -0.133 | 1.04 | -1.04 | 0.133 |
| 86.24999999999724 | 2.54 | -2.54 | -0.133 | 1.039 | -1.039 | 0.133 |
| 86.29999999999724 | 2.54 | -2.54 | -0.132 | 1.038 | -1.038 | 0.132 |
| 86.34999999999722 | 2.539 | -2.539 | -0.132 | 1.038 | -1.038 | 0.132 |
| 86.39999999999723 | 2.538 | -2.538 | -0.132 | 1.037 | -1.037 | 0.132 |
| 86.4499999999972 | 2.538 | -2.538 | -0.132 | 1.037 | -1.037 | 0.132 |
| 86.4999999999972 | 2.537 | -2.537 | -0.132 | 1.036 | -1.036 | 0.132 |
| 86.5499999999972 | 2.537 | -2.537 | -0.132 | 1.036 | -1.036 | 0.132 |
| 86.5999999999972 | 2.536 | -2.536 | -0.132 | 1.035 | -1.035 | 0.132 |
| 86.6499999999972 | 2.536 | -2.536 | -0.131 | 1.035 | -1.035 | 0.131 |
| 86.6999999999972 | 2.535 | -2.535 | -0.131 | 1.034 | -1.034 | 0.131 |
| 86.7499999999972 | 2.535 | -2.535 | -0.131 | 1.034 | -1.034 | 0.131 |
| 86.7999999999972 | 2.534 | -2.534 | -0.131 | 1.033 | -1.033 | 0.131 |
| 86.8499999999972 | 2.534 | -2.534 | -0.131 | 1.033 | -1.033 | 0.131 |
| 86.8999999999972 | 2.533 | -2.533 | -0.131 | 1.032 | -1.032 | 0.131 |
| 86.9499999999972 | 2.532 | -2.532 | -0.131 | 1.031 | -1.031 | 0.131 |
| 86.9999999999972 | 2.532 | -2.532 | -0.13 | 1.031 | -1.031 | 0.13 |
| 87.0499999999972 | 2.531 | -2.531 | -0.13 | 1.03 | -1.03 | 0.13 |
| 87.0999999999972 | 2.531 | -2.531 | -0.13 | 1.03 | -1.03 | 0.13 |
| 87.1499999999972 | 2.53 | -2.53 | -0.13 | 1.029 | -1.029 | 0.13 |
| 87.19999999999717 | 2.53 | -2.53 | -0.13 | 1.029 | -1.029 | 0.13 |
| 87.24999999999719 | 2.529 | -2.529 | -0.13 | 1.028 | -1.028 | 0.13 |
| 87.29999999999718 | 2.529 | -2.529 | -0.13 | 1.028 | -1.028 | 0.13 |
| 87.34999999999718 | 2.528 | -2.528 | -0.129 | 1.027 | -1.027 | 0.129 |
| 87.39999999999716 | 2.528 | -2.528 | -0.129 | 1.027 | -1.027 | 0.129 |
| 87.44999999999717 | 2.527 | -2.527 | -0.129 | 1.026 | -1.026 | 0.129 |
| 87.49999999999717 | 2.527 | -2.527 | -0.129 | 1.026 | -1.026 | 0.129 |
| 87.54999999999715 | 2.526 | -2.526 | -0.129 | 1.025 | -1.025 | 0.129 |
| 87.59999999999717 | 2.525 | -2.525 | -0.129 | 1.025 | -1.025 | 0.129 |
| 87.64999999999716 | 2.525 | -2.525 | -0.128 | 1.024 | -1.024 | 0.128 |
| 87.69999999999716 | 2.524 | -2.524 | -0.128 | 1.024 | -1.024 | 0.128 |
| 87.74999999999714 | 2.524 | -2.524 | -0.128 | 1.023 | -1.023 | 0.128 |
| 87.79999999999715 | 2.523 | -2.523 | -0.128 | 1.022 | -1.022 | 0.128 |
| 87.84999999999715 | 2.523 | -2.523 | -0.128 | 1.022 | -1.022 | 0.128 |
| 87.89999999999714 | 2.522 | -2.522 | -0.128 | 1.021 | -1.021 | 0.128 |
| 87.94999999999715 | 2.522 | -2.522 | -0.128 | 1.021 | -1.021 | 0.128 |
| 87.99999999999714 | 2.521 | -2.521 | -0.127 | 1.02 | -1.02 | 0.127 |
| 88.04999999999714 | 2.521 | -2.521 | -0.127 | 1.02 | -1.02 | 0.127 |
| 88.09999999999712 | 2.52 | -2.52 | -0.127 | 1.019 | -1.019 | 0.127 |
| 88.14999999999714 | 2.52 | -2.52 | -0.127 | 1.019 | -1.019 | 0.127 |
| 88.19999999999713 | 2.519 | -2.519 | -0.127 | 1.018 | -1.018 | 0.127 |
| 88.2499999999971 | 2.518 | -2.518 | -0.127 | 1.018 | -1.018 | 0.127 |
| 88.2999999999971 | 2.518 | -2.518 | -0.127 | 1.017 | -1.017 | 0.127 |
| 88.3499999999971 | 2.517 | -2.517 | -0.126 | 1.017 | -1.017 | 0.126 |
| 88.3999999999971 | 2.517 | -2.517 | -0.126 | 1.016 | -1.016 | 0.126 |
| 88.4499999999971 | 2.516 | -2.516 | -0.126 | 1.016 | -1.016 | 0.126 |
| 88.4999999999971 | 2.516 | -2.516 | -0.126 | 1.015 | -1.015 | 0.126 |
| 88.5499999999971 | 2.515 | -2.515 | -0.126 | 1.015 | -1.015 | 0.126 |
| 88.5999999999971 | 2.515 | -2.515 | -0.126 | 1.014 | -1.014 | 0.126 |
| 88.6499999999971 | 2.514 | -2.514 | -0.126 | 1.014 | -1.014 | 0.126 |
| 88.6999999999971 | 2.514 | -2.514 | -0.126 | 1.013 | -1.013 | 0.126 |
| 88.7499999999971 | 2.513 | -2.513 | -0.125 | 1.013 | -1.013 | 0.125 |
| 88.7999999999971 | 2.513 | -2.513 | -0.125 | 1.012 | -1.012 | 0.125 |
| 88.8499999999971 | 2.512 | -2.512 | -0.125 | 1.012 | -1.012 | 0.125 |
| 88.8999999999971 | 2.512 | -2.512 | -0.125 | 1.011 | -1.011 | 0.125 |
| 88.94999999999708 | 2.511 | -2.511 | -0.125 | 1.011 | -1.011 | 0.125 |
| 88.99999999999709 | 2.51 | -2.51 | -0.125 | 1.01 | -1.01 | 0.125 |
| 89.04999999999708 | 2.51 | -2.51 | -0.125 | 1.01 | -1.01 | 0.125 |
| 89.09999999999708 | 2.509 | -2.509 | -0.124 | 1.009 | -1.009 | 0.124 |
| 89.14999999999706 | 2.509 | -2.509 | -0.124 | 1.009 | -1.009 | 0.124 |
| 89.19999999999708 | 2.508 | -2.508 | -0.124 | 1.008 | -1.008 | 0.124 |
| 89.24999999999707 | 2.508 | -2.508 | -0.124 | 1.008 | -1.008 | 0.124 |
| 89.29999999999706 | 2.507 | -2.507 | -0.124 | 1.007 | -1.007 | 0.124 |
| 89.34999999999707 | 2.507 | -2.507 | -0.124 | 1.007 | -1.007 | 0.124 |
| 89.39999999999706 | 2.506 | -2.506 | -0.124 | 1.006 | -1.006 | 0.124 |
| 89.44999999999706 | 2.506 | -2.506 | -0.123 | 1.006 | -1.006 | 0.123 |
| 89.49999999999704 | 2.505 | -2.505 | -0.123 | 1.005 | -1.005 | 0.123 |
| 89.54999999999706 | 2.505 | -2.505 | -0.123 | 1.005 | -1.005 | 0.123 |
| 89.59999999999705 | 2.504 | -2.504 | -0.123 | 1.004 | -1.004 | 0.123 |
| 89.64999999999704 | 2.504 | -2.504 | -0.123 | 1.004 | -1.004 | 0.123 |
| 89.69999999999705 | 2.503 | -2.503 | -0.123 | 1.003 | -1.003 | 0.123 |
| 89.74999999999704 | 2.503 | -2.503 | -0.123 | 1.003 | -1.003 | 0.123 |
| 89.79999999999704 | 2.502 | -2.502 | -0.122 | 1.002 | -1.002 | 0.122 |
| 89.84999999999702 | 2.502 | -2.502 | -0.122 | 1.002 | -1.002 | 0.122 |
| 89.89999999999704 | 2.501 | -2.501 | -0.122 | 1.001 | -1.001 | 0.122 |
| 89.949999999997 | 2.501 | -2.501 | -0.122 | 1.001 | -1.001 | 0.122 |
| 89.999999999997 | 2.5 | -2.5 | -0.122 | 1 | -1 | 0.122 |
| 90.049999999997 | 2.499 | -2.499 | -0.122 | 1 | -1 | 0.122 |
| 90.099999999997 | 2.499 | -2.499 | -0.122 | 0.999 | -0.999 | 0.122 |
| 90.149999999997 | 2.498 | -2.498 | -0.122 | 0.999 | -0.999 | 0.122 |
| 90.199999999997 | 2.498 | -2.498 | -0.121 | 0.998 | -0.998 | 0.121 |
| 90.249999999997 | 2.497 | -2.497 | -0.121 | 0.998 | -0.998 | 0.121 |
| 90.299999999997 | 2.497 | -2.497 | -0.121 | 0.997 | -0.997 | 0.121 |
| 90.349999999997 | 2.496 | -2.496 | -0.121 | 0.997 | -0.997 | 0.121 |
| 90.399999999997 | 2.496 | -2.496 | -0.121 | 0.996 | -0.996 | 0.121 |
| 90.449999999997 | 2.495 | -2.495 | -0.121 | 0.996 | -0.996 | 0.121 |
| 90.499999999997 | 2.495 | -2.495 | -0.121 | 0.995 | -0.995 | 0.121 |
| 90.549999999997 | 2.494 | -2.494 | -0.12 | 0.995 | -0.995 | 0.12 |
| 90.599999999997 | 2.494 | -2.494 | -0.12 | 0.994 | -0.994 | 0.12 |
| 90.649999999997 | 2.493 | -2.493 | -0.12 | 0.994 | -0.994 | 0.12 |
| 90.699999999997 | 2.493 | -2.493 | -0.12 | 0.993 | -0.993 | 0.12 |
| 90.74999999999697 | 2.492 | -2.492 | -0.12 | 0.993 | -0.993 | 0.12 |
| 90.79999999999698 | 2.492 | -2.492 | -0.12 | 0.992 | -0.992 | 0.12 |
| 90.84999999999698 | 2.491 | -2.491 | -0.12 | 0.992 | -0.992 | 0.12 |
| 90.89999999999696 | 2.491 | -2.491 | -0.12 | 0.991 | -0.991 | 0.12 |
| 90.94999999999698 | 2.49 | -2.49 | -0.119 | 0.991 | -0.991 | 0.119 |
| 90.99999999999697 | 2.49 | -2.49 | -0.119 | 0.99 | -0.99 | 0.119 |
| 91.04999999999697 | 2.489 | -2.489 | -0.119 | 0.99 | -0.99 | 0.119 |
| 91.09999999999695 | 2.489 | -2.489 | -0.119 | 0.989 | -0.989 | 0.119 |
| 91.14999999999696 | 2.488 | -2.488 | -0.119 | 0.989 | -0.989 | 0.119 |
| 91.19999999999696 | 2.488 | -2.488 | -0.119 | 0.988 | -0.988 | 0.119 |
| 91.24999999999694 | 2.487 | -2.487 | -0.119 | 0.988 | -0.988 | 0.119 |
| 91.29999999999696 | 2.487 | -2.487 | -0.119 | 0.987 | -0.987 | 0.119 |
| 91.34999999999695 | 2.486 | -2.486 | -0.118 | 0.987 | -0.987 | 0.118 |
| 91.39999999999695 | 2.486 | -2.486 | -0.118 | 0.986 | -0.986 | 0.118 |
| 91.44999999999693 | 2.485 | -2.485 | -0.118 | 0.986 | -0.986 | 0.118 |
| 91.49999999999694 | 2.485 | -2.485 | -0.118 | 0.985 | -0.985 | 0.118 |
| 91.54999999999694 | 2.484 | -2.484 | -0.118 | 0.985 | -0.985 | 0.118 |
| 91.59999999999692 | 2.484 | -2.484 | -0.118 | 0.984 | -0.984 | 0.118 |
| 91.64999999999694 | 2.483 | -2.483 | -0.118 | 0.984 | -0.984 | 0.118 |
| 91.69999999999693 | 2.482 | -2.482 | -0.118 | 0.983 | -0.983 | 0.118 |
| 91.74999999999693 | 2.482 | -2.482 | -0.117 | 0.983 | -0.983 | 0.117 |
| 91.79999999999691 | 2.481 | -2.481 | -0.117 | 0.982 | -0.982 | 0.117 |
| 91.84999999999692 | 2.481 | -2.481 | -0.117 | 0.982 | -0.982 | 0.117 |
| 91.89999999999692 | 2.48 | -2.48 | -0.117 | 0.981 | -0.981 | 0.117 |
| 91.9499999999969 | 2.48 | -2.48 | -0.117 | 0.981 | -0.981 | 0.117 |
| 91.9999999999969 | 2.479 | -2.479 | -0.117 | 0.98 | -0.98 | 0.117 |
| 92.0499999999969 | 2.479 | -2.479 | -0.117 | 0.98 | -0.98 | 0.117 |
| 92.0999999999969 | 2.478 | -2.478 | -0.117 | 0.979 | -0.979 | 0.117 |
| 92.1499999999969 | 2.478 | -2.478 | -0.116 | 0.979 | -0.979 | 0.116 |
| 92.1999999999969 | 2.477 | -2.477 | -0.116 | 0.978 | -0.978 | 0.116 |
| 92.2499999999969 | 2.477 | -2.477 | -0.116 | 0.978 | -0.978 | 0.116 |
| 92.2999999999969 | 2.476 | -2.476 | -0.116 | 0.978 | -0.978 | 0.116 |
| 92.3499999999969 | 2.476 | -2.476 | -0.116 | 0.977 | -0.977 | 0.116 |
| 92.3999999999969 | 2.475 | -2.475 | -0.116 | 0.977 | -0.977 | 0.116 |
| 92.4499999999969 | 2.475 | -2.475 | -0.116 | 0.976 | -0.976 | 0.116 |
| 92.49999999999687 | 2.474 | -2.474 | -0.116 | 0.976 | -0.976 | 0.116 |
| 92.54999999999688 | 2.474 | -2.474 | -0.115 | 0.975 | -0.975 | 0.115 |
| 92.59999999999688 | 2.473 | -2.473 | -0.115 | 0.975 | -0.975 | 0.115 |
| 92.64999999999687 | 2.473 | -2.473 | -0.115 | 0.974 | -0.974 | 0.115 |
| 92.69999999999688 | 2.472 | -2.472 | -0.115 | 0.974 | -0.974 | 0.115 |
| 92.74999999999687 | 2.472 | -2.472 | -0.115 | 0.973 | -0.973 | 0.115 |
| 92.79999999999687 | 2.471 | -2.471 | -0.115 | 0.973 | -0.973 | 0.115 |
| 92.84999999999685 | 2.471 | -2.471 | -0.115 | 0.972 | -0.972 | 0.115 |
| 92.89999999999687 | 2.47 | -2.47 | -0.115 | 0.972 | -0.972 | 0.115 |
| 92.94999999999686 | 2.47 | -2.47 | -0.114 | 0.971 | -0.971 | 0.114 |
| 92.99999999999685 | 2.469 | -2.469 | -0.114 | 0.971 | -0.971 | 0.114 |
| 93.04999999999686 | 2.469 | -2.469 | -0.114 | 0.97 | -0.97 | 0.114 |
| 93.09999999999685 | 2.468 | -2.468 | -0.114 | 0.97 | -0.97 | 0.114 |
| 93.14999999999685 | 2.468 | -2.468 | -0.114 | 0.969 | -0.969 | 0.114 |
| 93.19999999999683 | 2.467 | -2.467 | -0.114 | 0.969 | -0.969 | 0.114 |
| 93.24999999999685 | 2.467 | -2.467 | -0.114 | 0.969 | -0.969 | 0.114 |
| 93.29999999999684 | 2.466 | -2.466 | -0.114 | 0.968 | -0.968 | 0.114 |
| 93.34999999999683 | 2.466 | -2.466 | -0.113 | 0.968 | -0.968 | 0.113 |
| 93.39999999999684 | 2.465 | -2.465 | -0.113 | 0.967 | -0.967 | 0.113 |
| 93.44999999999683 | 2.465 | -2.465 | -0.113 | 0.967 | -0.967 | 0.113 |
| 93.49999999999683 | 2.464 | -2.464 | -0.113 | 0.966 | -0.966 | 0.113 |
| 93.54999999999681 | 2.464 | -2.464 | -0.113 | 0.966 | -0.966 | 0.113 |
| 93.59999999999683 | 2.463 | -2.463 | -0.113 | 0.965 | -0.965 | 0.113 |
| 93.64999999999682 | 2.463 | -2.463 | -0.113 | 0.965 | -0.965 | 0.113 |
| 93.6999999999968 | 2.462 | -2.462 | -0.113 | 0.964 | -0.964 | 0.113 |
| 93.7499999999968 | 2.462 | -2.462 | -0.112 | 0.964 | -0.964 | 0.112 |
| 93.7999999999968 | 2.461 | -2.461 | -0.112 | 0.963 | -0.963 | 0.112 |
| 93.8499999999968 | 2.461 | -2.461 | -0.112 | 0.963 | -0.963 | 0.112 |
| 93.8999999999968 | 2.46 | -2.46 | -0.112 | 0.962 | -0.962 | 0.112 |
| 93.9499999999968 | 2.46 | -2.46 | -0.112 | 0.962 | -0.962 | 0.112 |
| 93.9999999999968 | 2.459 | -2.459 | -0.112 | 0.962 | -0.962 | 0.112 |
| 94.0499999999968 | 2.459 | -2.459 | -0.112 | 0.961 | -0.961 | 0.112 |
| 94.0999999999968 | 2.458 | -2.458 | -0.112 | 0.961 | -0.961 | 0.112 |
| 94.1499999999968 | 2.458 | -2.458 | -0.112 | 0.96 | -0.96 | 0.112 |
| 94.1999999999968 | 2.457 | -2.457 | -0.111 | 0.96 | -0.96 | 0.111 |
| 94.24999999999677 | 2.457 | -2.457 | -0.111 | 0.959 | -0.959 | 0.111 |
| 94.29999999999679 | 2.457 | -2.457 | -0.111 | 0.959 | -0.959 | 0.111 |
| 94.34999999999678 | 2.456 | -2.456 | -0.111 | 0.958 | -0.958 | 0.111 |
| 94.39999999999677 | 2.456 | -2.456 | -0.111 | 0.958 | -0.958 | 0.111 |
| 94.44999999999678 | 2.455 | -2.455 | -0.111 | 0.957 | -0.957 | 0.111 |
| 94.49999999999677 | 2.455 | -2.455 | -0.111 | 0.957 | -0.957 | 0.111 |
| 94.54999999999677 | 2.454 | -2.454 | -0.111 | 0.956 | -0.956 | 0.111 |
| 94.59999999999675 | 2.454 | -2.454 | -0.111 | 0.956 | -0.956 | 0.111 |
| 94.64999999999677 | 2.453 | -2.453 | -0.11 | 0.956 | -0.956 | 0.11 |
| 94.69999999999676 | 2.453 | -2.453 | -0.11 | 0.955 | -0.955 | 0.11 |
| 94.74999999999675 | 2.452 | -2.452 | -0.11 | 0.955 | -0.955 | 0.11 |
| 94.79999999999676 | 2.452 | -2.452 | -0.11 | 0.954 | -0.954 | 0.11 |
| 94.84999999999675 | 2.451 | -2.451 | -0.11 | 0.954 | -0.954 | 0.11 |
| 94.89999999999675 | 2.451 | -2.451 | -0.11 | 0.953 | -0.953 | 0.11 |
| 94.94999999999673 | 2.45 | -2.45 | -0.11 | 0.953 | -0.953 | 0.11 |
| 94.99999999999675 | 2.45 | -2.45 | -0.11 | 0.952 | -0.952 | 0.11 |
| 95.04999999999674 | 2.449 | -2.449 | -0.109 | 0.952 | -0.952 | 0.109 |
| 95.09999999999674 | 2.449 | -2.449 | -0.109 | 0.951 | -0.951 | 0.109 |
| 95.14999999999672 | 2.448 | -2.448 | -0.109 | 0.951 | -0.951 | 0.109 |
| 95.19999999999673 | 2.448 | -2.448 | -0.109 | 0.951 | -0.951 | 0.109 |
| 95.24999999999673 | 2.447 | -2.447 | -0.109 | 0.95 | -0.95 | 0.109 |
| 95.29999999999671 | 2.447 | -2.447 | -0.109 | 0.95 | -0.95 | 0.109 |
| 95.34999999999673 | 2.446 | -2.446 | -0.109 | 0.949 | -0.949 | 0.109 |
| 95.39999999999672 | 2.446 | -2.446 | -0.109 | 0.949 | -0.949 | 0.109 |
| 95.4499999999967 | 2.445 | -2.445 | -0.109 | 0.948 | -0.948 | 0.109 |
| 95.4999999999967 | 2.445 | -2.445 | -0.108 | 0.948 | -0.948 | 0.108 |
| 95.5499999999967 | 2.444 | -2.444 | -0.108 | 0.947 | -0.947 | 0.108 |
| 95.5999999999967 | 2.444 | -2.444 | -0.108 | 0.947 | -0.947 | 0.108 |
| 95.6499999999967 | 2.443 | -2.443 | -0.108 | 0.947 | -0.947 | 0.108 |
| 95.6999999999967 | 2.443 | -2.443 | -0.108 | 0.946 | -0.946 | 0.108 |
| 95.7499999999967 | 2.442 | -2.442 | -0.108 | 0.946 | -0.946 | 0.108 |
| 95.7999999999967 | 2.442 | -2.442 | -0.108 | 0.945 | -0.945 | 0.108 |
| 95.8499999999967 | 2.441 | -2.441 | -0.108 | 0.945 | -0.945 | 0.108 |
| 95.8999999999967 | 2.441 | -2.441 | -0.108 | 0.944 | -0.944 | 0.108 |
| 95.9499999999967 | 2.44 | -2.44 | -0.107 | 0.944 | -0.944 | 0.107 |
| 95.99999999999667 | 2.44 | -2.44 | -0.107 | 0.943 | -0.943 | 0.107 |
| 96.04999999999669 | 2.44 | -2.44 | -0.107 | 0.943 | -0.943 | 0.107 |
| 96.09999999999668 | 2.439 | -2.439 | -0.107 | 0.943 | -0.943 | 0.107 |
| 96.14999999999668 | 2.439 | -2.439 | -0.107 | 0.942 | -0.942 | 0.107 |
| 96.19999999999666 | 2.438 | -2.438 | -0.107 | 0.942 | -0.942 | 0.107 |
| 96.24999999999667 | 2.438 | -2.438 | -0.107 | 0.941 | -0.941 | 0.107 |
| 96.29999999999667 | 2.437 | -2.437 | -0.107 | 0.941 | -0.941 | 0.107 |
| 96.34999999999665 | 2.437 | -2.437 | -0.107 | 0.94 | -0.94 | 0.107 |
| 96.39999999999667 | 2.436 | -2.436 | -0.106 | 0.94 | -0.94 | 0.106 |
| 96.44999999999666 | 2.436 | -2.436 | -0.106 | 0.939 | -0.939 | 0.106 |
| 96.49999999999666 | 2.435 | -2.435 | -0.106 | 0.939 | -0.939 | 0.106 |
| 96.54999999999664 | 2.435 | -2.435 | -0.106 | 0.939 | -0.939 | 0.106 |
| 96.59999999999665 | 2.434 | -2.434 | -0.106 | 0.938 | -0.938 | 0.106 |
| 96.64999999999665 | 2.434 | -2.434 | -0.106 | 0.938 | -0.938 | 0.106 |
| 96.69999999999663 | 2.433 | -2.433 | -0.106 | 0.937 | -0.937 | 0.106 |
| 96.74999999999665 | 2.433 | -2.433 | -0.106 | 0.937 | -0.937 | 0.106 |
| 96.79999999999664 | 2.432 | -2.432 | -0.106 | 0.936 | -0.936 | 0.106 |
| 96.84999999999664 | 2.432 | -2.432 | -0.105 | 0.936 | -0.936 | 0.105 |
| 96.89999999999662 | 2.431 | -2.431 | -0.105 | 0.935 | -0.935 | 0.105 |
| 96.94999999999663 | 2.431 | -2.431 | -0.105 | 0.935 | -0.935 | 0.105 |
| 96.99999999999663 | 2.43 | -2.43 | -0.105 | 0.935 | -0.935 | 0.105 |
| 97.04999999999661 | 2.43 | -2.43 | -0.105 | 0.934 | -0.934 | 0.105 |
| 97.09999999999663 | 2.429 | -2.429 | -0.105 | 0.934 | -0.934 | 0.105 |
| 97.14999999999662 | 2.429 | -2.429 | -0.105 | 0.933 | -0.933 | 0.105 |
| 97.19999999999662 | 2.429 | -2.429 | -0.105 | 0.933 | -0.933 | 0.105 |
| 97.2499999999966 | 2.428 | -2.428 | -0.105 | 0.932 | -0.932 | 0.105 |
| 97.2999999999966 | 2.428 | -2.428 | -0.105 | 0.932 | -0.932 | 0.105 |
| 97.3499999999966 | 2.427 | -2.427 | -0.104 | 0.932 | -0.932 | 0.104 |
| 97.3999999999966 | 2.427 | -2.427 | -0.104 | 0.931 | -0.931 | 0.104 |
| 97.4499999999966 | 2.426 | -2.426 | -0.104 | 0.931 | -0.931 | 0.104 |
| 97.4999999999966 | 2.426 | -2.426 | -0.104 | 0.93 | -0.93 | 0.104 |
| 97.5499999999966 | 2.425 | -2.425 | -0.104 | 0.93 | -0.93 | 0.104 |
| 97.5999999999966 | 2.425 | -2.425 | -0.104 | 0.929 | -0.929 | 0.104 |
| 97.6499999999966 | 2.424 | -2.424 | -0.104 | 0.929 | -0.929 | 0.104 |
| 97.6999999999966 | 2.424 | -2.424 | -0.104 | 0.929 | -0.929 | 0.104 |
| 97.74999999999658 | 2.423 | -2.423 | -0.104 | 0.928 | -0.928 | 0.104 |
| 97.79999999999659 | 2.423 | -2.423 | -0.103 | 0.928 | -0.928 | 0.103 |
| 97.84999999999658 | 2.422 | -2.422 | -0.103 | 0.927 | -0.927 | 0.103 |
| 97.89999999999658 | 2.422 | -2.422 | -0.103 | 0.927 | -0.927 | 0.103 |
| 97.94999999999656 | 2.421 | -2.421 | -0.103 | 0.926 | -0.926 | 0.103 |
| 97.99999999999658 | 2.421 | -2.421 | -0.103 | 0.926 | -0.926 | 0.103 |
| 98.04999999999657 | 2.421 | -2.421 | -0.103 | 0.925 | -0.925 | 0.103 |
| 98.09999999999656 | 2.42 | -2.42 | -0.103 | 0.925 | -0.925 | 0.103 |
| 98.14999999999657 | 2.42 | -2.42 | -0.103 | 0.925 | -0.925 | 0.103 |
| 98.19999999999656 | 2.419 | -2.419 | -0.103 | 0.924 | -0.924 | 0.103 |
| 98.24999999999656 | 2.419 | -2.419 | -0.103 | 0.924 | -0.924 | 0.103 |
| 98.29999999999654 | 2.418 | -2.418 | -0.102 | 0.923 | -0.923 | 0.102 |
| 98.34999999999656 | 2.418 | -2.418 | -0.102 | 0.923 | -0.923 | 0.102 |
| 98.39999999999655 | 2.417 | -2.417 | -0.102 | 0.923 | -0.923 | 0.102 |
| 98.44999999999654 | 2.417 | -2.417 | -0.102 | 0.922 | -0.922 | 0.102 |
| 98.49999999999655 | 2.416 | -2.416 | -0.102 | 0.922 | -0.922 | 0.102 |
| 98.54999999999654 | 2.416 | -2.416 | -0.102 | 0.921 | -0.921 | 0.102 |
| 98.59999999999654 | 2.415 | -2.415 | -0.102 | 0.921 | -0.921 | 0.102 |
| 98.64999999999652 | 2.415 | -2.415 | -0.102 | 0.92 | -0.92 | 0.102 |
| 98.69999999999654 | 2.414 | -2.414 | -0.102 | 0.92 | -0.92 | 0.102 |
| 98.74999999999653 | 2.414 | -2.414 | -0.102 | 0.92 | -0.92 | 0.102 |
| 98.79999999999652 | 2.414 | -2.414 | -0.101 | 0.919 | -0.919 | 0.101 |
| 98.84999999999653 | 2.413 | -2.413 | -0.101 | 0.919 | -0.919 | 0.101 |
| 98.89999999999652 | 2.413 | -2.413 | -0.101 | 0.918 | -0.918 | 0.101 |
| 98.9499999999965 | 2.412 | -2.412 | -0.101 | 0.918 | -0.918 | 0.101 |
| 98.9999999999965 | 2.412 | -2.412 | -0.101 | 0.917 | -0.917 | 0.101 |
| 99.0499999999965 | 2.411 | -2.411 | -0.101 | 0.917 | -0.917 | 0.101 |
| 99.0999999999965 | 2.411 | -2.411 | -0.101 | 0.917 | -0.917 | 0.101 |
| 99.1499999999965 | 2.41 | -2.41 | -0.101 | 0.916 | -0.916 | 0.101 |
| 99.1999999999965 | 2.41 | -2.41 | -0.101 | 0.916 | -0.916 | 0.101 |
| 99.2499999999965 | 2.409 | -2.409 | -0.1 | 0.915 | -0.915 | 0.1 |
| 99.2999999999965 | 2.409 | -2.409 | -0.1 | 0.915 | -0.915 | 0.1 |
| 99.3499999999965 | 2.408 | -2.408 | -0.1 | 0.914 | -0.914 | 0.1 |
| 99.3999999999965 | 2.408 | -2.408 | -0.1 | 0.914 | -0.914 | 0.1 |
| 99.4499999999965 | 2.408 | -2.408 | -0.1 | 0.914 | -0.914 | 0.1 |
| 99.49999999999648 | 2.407 | -2.407 | -0.1 | 0.913 | -0.913 | 0.1 |
| 99.54999999999649 | 2.407 | -2.407 | -0.1 | 0.913 | -0.913 | 0.1 |
| 99.59999999999648 | 2.406 | -2.406 | -0.1 | 0.912 | -0.912 | 0.1 |
| 99.64999999999648 | 2.406 | -2.406 | -0.1 | 0.912 | -0.912 | 0.1 |
| 99.69999999999646 | 2.405 | -2.405 | -0.1 | 0.912 | -0.912 | 0.1 |
| 99.74999999999648 | 2.405 | -2.405 | -0.1 | 0.911 | -0.911 | 0.1 |
| 99.79999999999647 | 2.404 | -2.404 | -0.099 | 0.911 | -0.911 | 0.099 |
| 99.84999999999646 | 2.404 | -2.404 | -0.099 | 0.91 | -0.91 | 0.099 |
| 99.89999999999645 | 2.403 | -2.403 | -0.099 | 0.91 | -0.91 | 0.099 |
| 99.94999999999646 | 2.403 | -2.403 | -0.099 | 0.91 | -0.91 | 0.099 |
| 99.99999999999646 | 2.403 | -2.403 | -0.099 | 0.909 | -0.909 | 0.099 |